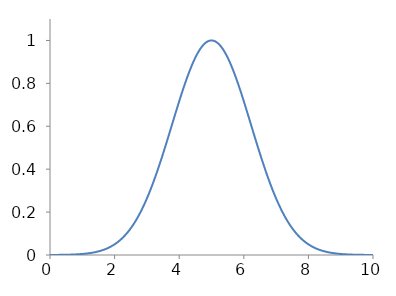
| Category | Series 0 |
|---|---|
| 0.0 | 0 |
| 0.001 | 0 |
| 0.002 | 0 |
| 0.003 | 0 |
| 0.004 | 0 |
| 0.005 | 0 |
| 0.006 | 0 |
| 0.007 | 0 |
| 0.008 | 0 |
| 0.009 | 0 |
| 0.01 | 0 |
| 0.011 | 0 |
| 0.012 | 0 |
| 0.013 | 0 |
| 0.014 | 0 |
| 0.015 | 0 |
| 0.016 | 0 |
| 0.017 | 0 |
| 0.018 | 0 |
| 0.019 | 0 |
| 0.02 | 0 |
| 0.021 | 0 |
| 0.022 | 0 |
| 0.023 | 0 |
| 0.024 | 0 |
| 0.025 | 0 |
| 0.026 | 0 |
| 0.027 | 0 |
| 0.028 | 0 |
| 0.029 | 0 |
| 0.03 | 0 |
| 0.031 | 0 |
| 0.032 | 0 |
| 0.033 | 0 |
| 0.034 | 0 |
| 0.035 | 0 |
| 0.036 | 0 |
| 0.037 | 0 |
| 0.038 | 0 |
| 0.039 | 0 |
| 0.04 | 0 |
| 0.041 | 0 |
| 0.042 | 0 |
| 0.043 | 0 |
| 0.044 | 0 |
| 0.045 | 0 |
| 0.046 | 0 |
| 0.047 | 0 |
| 0.048 | 0 |
| 0.049 | 0 |
| 0.05 | 0 |
| 0.051 | 0 |
| 0.052 | 0 |
| 0.053 | 0 |
| 0.054 | 0 |
| 0.055 | 0 |
| 0.056 | 0 |
| 0.057 | 0 |
| 0.058 | 0 |
| 0.059 | 0 |
| 0.06 | 0 |
| 0.061 | 0 |
| 0.062 | 0 |
| 0.063 | 0 |
| 0.064 | 0 |
| 0.065 | 0 |
| 0.066 | 0 |
| 0.067 | 0 |
| 0.068 | 0 |
| 0.069 | 0 |
| 0.07 | 0 |
| 0.071 | 0 |
| 0.072 | 0 |
| 0.073 | 0 |
| 0.074 | 0 |
| 0.075 | 0 |
| 0.076 | 0 |
| 0.077 | 0 |
| 0.078 | 0 |
| 0.079 | 0 |
| 0.08 | 0 |
| 0.081 | 0 |
| 0.082 | 0 |
| 0.083 | 0 |
| 0.084 | 0 |
| 0.085 | 0 |
| 0.086 | 0 |
| 0.087 | 0 |
| 0.088 | 0 |
| 0.089 | 0 |
| 0.09 | 0 |
| 0.091 | 0 |
| 0.092 | 0 |
| 0.093 | 0 |
| 0.094 | 0 |
| 0.095 | 0 |
| 0.096 | 0 |
| 0.097 | 0 |
| 0.098 | 0 |
| 0.099 | 0 |
| 0.1 | 0 |
| 0.101 | 0 |
| 0.102 | 0 |
| 0.103 | 0 |
| 0.104 | 0 |
| 0.105 | 0 |
| 0.106 | 0 |
| 0.107 | 0 |
| 0.108 | 0 |
| 0.109 | 0 |
| 0.11 | 0 |
| 0.111 | 0 |
| 0.112 | 0 |
| 0.113 | 0 |
| 0.114 | 0 |
| 0.115 | 0 |
| 0.116 | 0 |
| 0.117 | 0 |
| 0.118 | 0 |
| 0.119 | 0 |
| 0.12 | 0 |
| 0.121 | 0 |
| 0.122 | 0 |
| 0.123 | 0 |
| 0.124 | 0 |
| 0.125 | 0 |
| 0.126 | 0 |
| 0.127 | 0 |
| 0.128 | 0 |
| 0.129 | 0 |
| 0.13 | 0 |
| 0.131 | 0 |
| 0.132 | 0 |
| 0.133 | 0 |
| 0.134 | 0 |
| 0.135 | 0 |
| 0.136 | 0 |
| 0.137 | 0 |
| 0.138 | 0 |
| 0.139 | 0 |
| 0.14 | 0 |
| 0.141 | 0 |
| 0.142 | 0 |
| 0.143 | 0 |
| 0.144 | 0 |
| 0.145 | 0 |
| 0.146 | 0 |
| 0.147 | 0 |
| 0.148 | 0 |
| 0.149 | 0 |
| 0.15 | 0 |
| 0.151 | 0 |
| 0.152 | 0 |
| 0.153 | 0 |
| 0.154 | 0 |
| 0.155 | 0 |
| 0.156 | 0 |
| 0.157 | 0 |
| 0.158 | 0 |
| 0.159 | 0 |
| 0.16 | 0 |
| 0.161 | 0 |
| 0.162 | 0 |
| 0.163 | 0 |
| 0.164 | 0 |
| 0.165 | 0 |
| 0.166 | 0 |
| 0.167 | 0 |
| 0.168 | 0 |
| 0.169 | 0 |
| 0.17 | 0 |
| 0.171 | 0 |
| 0.172 | 0 |
| 0.173 | 0 |
| 0.174 | 0 |
| 0.175 | 0 |
| 0.176 | 0 |
| 0.177 | 0 |
| 0.178 | 0 |
| 0.179 | 0 |
| 0.18 | 0 |
| 0.181 | 0 |
| 0.182 | 0 |
| 0.183 | 0 |
| 0.184 | 0 |
| 0.185 | 0 |
| 0.186 | 0 |
| 0.187 | 0 |
| 0.188 | 0 |
| 0.189 | 0 |
| 0.19 | 0 |
| 0.191 | 0 |
| 0.192 | 0 |
| 0.193 | 0 |
| 0.194 | 0 |
| 0.195 | 0 |
| 0.196 | 0 |
| 0.197 | 0 |
| 0.198 | 0 |
| 0.199 | 0 |
| 0.2 | 0 |
| 0.201 | 0 |
| 0.202 | 0 |
| 0.203 | 0 |
| 0.204 | 0 |
| 0.205 | 0 |
| 0.206 | 0 |
| 0.207 | 0 |
| 0.208 | 0 |
| 0.209 | 0 |
| 0.21 | 0 |
| 0.211 | 0 |
| 0.212 | 0 |
| 0.213 | 0 |
| 0.214 | 0 |
| 0.215 | 0 |
| 0.216 | 0 |
| 0.217 | 0 |
| 0.218 | 0 |
| 0.219 | 0 |
| 0.22 | 0 |
| 0.221 | 0 |
| 0.222 | 0 |
| 0.223 | 0 |
| 0.224 | 0 |
| 0.225 | 0.001 |
| 0.226 | 0.001 |
| 0.227 | 0.001 |
| 0.228 | 0.001 |
| 0.229 | 0.001 |
| 0.23 | 0.001 |
| 0.231 | 0.001 |
| 0.232 | 0.001 |
| 0.233 | 0.001 |
| 0.234 | 0.001 |
| 0.235 | 0.001 |
| 0.236 | 0.001 |
| 0.237 | 0.001 |
| 0.238 | 0.001 |
| 0.239 | 0.001 |
| 0.24 | 0.001 |
| 0.241 | 0.001 |
| 0.242 | 0.001 |
| 0.243 | 0.001 |
| 0.244 | 0.001 |
| 0.245 | 0.001 |
| 0.246 | 0.001 |
| 0.247 | 0.001 |
| 0.248 | 0.001 |
| 0.249 | 0.001 |
| 0.25 | 0.001 |
| 0.251 | 0.001 |
| 0.252 | 0.001 |
| 0.253 | 0.001 |
| 0.254 | 0.001 |
| 0.255 | 0.001 |
| 0.256 | 0.001 |
| 0.257 | 0.001 |
| 0.258 | 0.001 |
| 0.259 | 0.001 |
| 0.26 | 0.001 |
| 0.261 | 0.001 |
| 0.262 | 0.001 |
| 0.263 | 0.001 |
| 0.264 | 0.001 |
| 0.265 | 0.001 |
| 0.266 | 0.001 |
| 0.267 | 0.001 |
| 0.268 | 0.001 |
| 0.269 | 0.001 |
| 0.27 | 0.001 |
| 0.271 | 0.001 |
| 0.272 | 0.001 |
| 0.273 | 0.001 |
| 0.274 | 0.001 |
| 0.275 | 0.001 |
| 0.276 | 0.001 |
| 0.277 | 0.001 |
| 0.278 | 0.001 |
| 0.279 | 0.001 |
| 0.28 | 0.001 |
| 0.281 | 0.001 |
| 0.282 | 0.001 |
| 0.283 | 0.001 |
| 0.284 | 0.001 |
| 0.285 | 0.001 |
| 0.286 | 0.001 |
| 0.287 | 0.001 |
| 0.288 | 0.001 |
| 0.289 | 0.001 |
| 0.29 | 0.001 |
| 0.291 | 0.001 |
| 0.292 | 0.001 |
| 0.293 | 0.001 |
| 0.294 | 0.001 |
| 0.295 | 0.001 |
| 0.296 | 0.001 |
| 0.297 | 0.001 |
| 0.298 | 0.001 |
| 0.299 | 0.001 |
| 0.3 | 0.001 |
| 0.301 | 0.001 |
| 0.302 | 0.001 |
| 0.303 | 0.001 |
| 0.304 | 0.001 |
| 0.305 | 0.001 |
| 0.306 | 0.001 |
| 0.307 | 0.001 |
| 0.308 | 0.001 |
| 0.309 | 0.001 |
| 0.31 | 0.001 |
| 0.311 | 0.001 |
| 0.312 | 0.001 |
| 0.313 | 0.001 |
| 0.314 | 0.001 |
| 0.315 | 0.001 |
| 0.316 | 0.001 |
| 0.317 | 0.001 |
| 0.318 | 0.001 |
| 0.319 | 0.001 |
| 0.32 | 0.001 |
| 0.321 | 0.001 |
| 0.322 | 0.001 |
| 0.323 | 0.001 |
| 0.324 | 0.001 |
| 0.325 | 0.001 |
| 0.326 | 0.001 |
| 0.327 | 0.001 |
| 0.328 | 0.001 |
| 0.329 | 0.001 |
| 0.33 | 0.001 |
| 0.331 | 0.001 |
| 0.332 | 0.001 |
| 0.333 | 0.001 |
| 0.334 | 0.001 |
| 0.335 | 0.001 |
| 0.336 | 0.001 |
| 0.337 | 0.001 |
| 0.338 | 0.001 |
| 0.339 | 0.001 |
| 0.34 | 0.001 |
| 0.341 | 0.001 |
| 0.342 | 0.001 |
| 0.343 | 0.001 |
| 0.344 | 0.001 |
| 0.345 | 0.001 |
| 0.346 | 0.001 |
| 0.347 | 0.001 |
| 0.348 | 0.001 |
| 0.349 | 0.001 |
| 0.35 | 0.001 |
| 0.351 | 0.001 |
| 0.352 | 0.001 |
| 0.353 | 0.001 |
| 0.354 | 0.001 |
| 0.355 | 0.001 |
| 0.356 | 0.001 |
| 0.357 | 0.001 |
| 0.358 | 0.001 |
| 0.359 | 0.001 |
| 0.36 | 0.001 |
| 0.361 | 0.001 |
| 0.362 | 0.001 |
| 0.363 | 0.001 |
| 0.364 | 0.001 |
| 0.365 | 0.001 |
| 0.366 | 0.001 |
| 0.367 | 0.001 |
| 0.368 | 0.001 |
| 0.369 | 0.001 |
| 0.37 | 0.001 |
| 0.371 | 0.001 |
| 0.372 | 0.001 |
| 0.373 | 0.001 |
| 0.374 | 0.001 |
| 0.375 | 0.001 |
| 0.376 | 0.001 |
| 0.377 | 0.001 |
| 0.378 | 0.001 |
| 0.379 | 0.001 |
| 0.38 | 0.001 |
| 0.381 | 0.001 |
| 0.382 | 0.001 |
| 0.383 | 0.001 |
| 0.384 | 0.001 |
| 0.385 | 0.001 |
| 0.386 | 0.001 |
| 0.387 | 0.001 |
| 0.388 | 0.001 |
| 0.389 | 0.001 |
| 0.39 | 0.001 |
| 0.391 | 0.001 |
| 0.392 | 0.001 |
| 0.393 | 0.001 |
| 0.394 | 0.001 |
| 0.395 | 0.001 |
| 0.396 | 0.001 |
| 0.397 | 0.001 |
| 0.398 | 0.001 |
| 0.399 | 0.001 |
| 0.4 | 0.001 |
| 0.401 | 0.001 |
| 0.402 | 0.001 |
| 0.403 | 0.001 |
| 0.404 | 0.001 |
| 0.405 | 0.001 |
| 0.406 | 0.001 |
| 0.407 | 0.001 |
| 0.408 | 0.001 |
| 0.409 | 0.001 |
| 0.41 | 0.001 |
| 0.411 | 0.001 |
| 0.412 | 0.001 |
| 0.413 | 0.001 |
| 0.414 | 0.001 |
| 0.415 | 0.001 |
| 0.416 | 0.001 |
| 0.417 | 0.001 |
| 0.418 | 0.001 |
| 0.419 | 0.001 |
| 0.42 | 0.001 |
| 0.421 | 0.001 |
| 0.422 | 0.001 |
| 0.423 | 0.001 |
| 0.424 | 0.001 |
| 0.425 | 0.001 |
| 0.426 | 0.001 |
| 0.427 | 0.001 |
| 0.428 | 0.001 |
| 0.429 | 0.001 |
| 0.43 | 0.001 |
| 0.431 | 0.001 |
| 0.432 | 0.001 |
| 0.433 | 0.001 |
| 0.434 | 0.001 |
| 0.435 | 0.001 |
| 0.436 | 0.001 |
| 0.437 | 0.001 |
| 0.438 | 0.001 |
| 0.439 | 0.001 |
| 0.44 | 0.001 |
| 0.441 | 0.001 |
| 0.442 | 0.001 |
| 0.443 | 0.001 |
| 0.444 | 0.001 |
| 0.445 | 0.001 |
| 0.446 | 0.001 |
| 0.447 | 0.001 |
| 0.448 | 0.001 |
| 0.449 | 0.001 |
| 0.45 | 0.001 |
| 0.451 | 0.001 |
| 0.452 | 0.001 |
| 0.453 | 0.001 |
| 0.454 | 0.001 |
| 0.455 | 0.001 |
| 0.456 | 0.001 |
| 0.457 | 0.001 |
| 0.458 | 0.001 |
| 0.459 | 0.001 |
| 0.46 | 0.001 |
| 0.461 | 0.001 |
| 0.462 | 0.001 |
| 0.463 | 0.001 |
| 0.464 | 0.001 |
| 0.465 | 0.001 |
| 0.466 | 0.001 |
| 0.467 | 0.001 |
| 0.468 | 0.001 |
| 0.469 | 0.001 |
| 0.47 | 0.001 |
| 0.471 | 0.001 |
| 0.472 | 0.001 |
| 0.473 | 0.001 |
| 0.474 | 0.001 |
| 0.475 | 0.001 |
| 0.476 | 0.001 |
| 0.477 | 0.001 |
| 0.478 | 0.001 |
| 0.479 | 0.001 |
| 0.48 | 0.001 |
| 0.481 | 0.001 |
| 0.482 | 0.001 |
| 0.483 | 0.001 |
| 0.484 | 0.001 |
| 0.485 | 0.001 |
| 0.486 | 0.001 |
| 0.487 | 0.001 |
| 0.488 | 0.001 |
| 0.489 | 0.001 |
| 0.49 | 0.001 |
| 0.491 | 0.001 |
| 0.492 | 0.001 |
| 0.493 | 0.001 |
| 0.494 | 0.001 |
| 0.495 | 0.001 |
| 0.496 | 0.001 |
| 0.497 | 0.001 |
| 0.498 | 0.001 |
| 0.499 | 0.001 |
| 0.5 | 0.001 |
| 0.501 | 0.001 |
| 0.502 | 0.001 |
| 0.503 | 0.001 |
| 0.504 | 0.001 |
| 0.505 | 0.001 |
| 0.506 | 0.001 |
| 0.507 | 0.001 |
| 0.508 | 0.001 |
| 0.509 | 0.001 |
| 0.51 | 0.001 |
| 0.511 | 0.001 |
| 0.512 | 0.001 |
| 0.513 | 0.001 |
| 0.514 | 0.001 |
| 0.515 | 0.001 |
| 0.516 | 0.001 |
| 0.517 | 0.001 |
| 0.518 | 0.001 |
| 0.519 | 0.001 |
| 0.52 | 0.001 |
| 0.521 | 0.001 |
| 0.522 | 0.001 |
| 0.523 | 0.001 |
| 0.524 | 0.001 |
| 0.525 | 0.001 |
| 0.526 | 0.001 |
| 0.527 | 0.001 |
| 0.528 | 0.001 |
| 0.529 | 0.001 |
| 0.53 | 0.001 |
| 0.531 | 0.001 |
| 0.532 | 0.001 |
| 0.533 | 0.001 |
| 0.534 | 0.001 |
| 0.535 | 0.001 |
| 0.536 | 0.001 |
| 0.537 | 0.001 |
| 0.538 | 0.001 |
| 0.539 | 0.001 |
| 0.54 | 0.001 |
| 0.541 | 0.001 |
| 0.542 | 0.001 |
| 0.543 | 0.001 |
| 0.544 | 0.001 |
| 0.545 | 0.001 |
| 0.546 | 0.001 |
| 0.547 | 0.001 |
| 0.548 | 0.001 |
| 0.549 | 0.001 |
| 0.55 | 0.001 |
| 0.551 | 0.001 |
| 0.552 | 0.001 |
| 0.553 | 0.001 |
| 0.554 | 0.001 |
| 0.555 | 0.001 |
| 0.556 | 0.001 |
| 0.557 | 0.001 |
| 0.558 | 0.001 |
| 0.559 | 0.001 |
| 0.56 | 0.001 |
| 0.561 | 0.001 |
| 0.562 | 0.001 |
| 0.563 | 0.001 |
| 0.564 | 0.001 |
| 0.565 | 0.001 |
| 0.566 | 0.001 |
| 0.567 | 0.001 |
| 0.568 | 0.001 |
| 0.569 | 0.001 |
| 0.57 | 0.001 |
| 0.571 | 0.001 |
| 0.572 | 0.001 |
| 0.573 | 0.001 |
| 0.574 | 0.001 |
| 0.575 | 0.001 |
| 0.576 | 0.001 |
| 0.577 | 0.001 |
| 0.578 | 0.001 |
| 0.579 | 0.001 |
| 0.58 | 0.001 |
| 0.581 | 0.001 |
| 0.582 | 0.001 |
| 0.583 | 0.001 |
| 0.584 | 0.002 |
| 0.585 | 0.002 |
| 0.586 | 0.002 |
| 0.587 | 0.002 |
| 0.588 | 0.002 |
| 0.589 | 0.002 |
| 0.59 | 0.002 |
| 0.591 | 0.002 |
| 0.592 | 0.002 |
| 0.593 | 0.002 |
| 0.594 | 0.002 |
| 0.595 | 0.002 |
| 0.596 | 0.002 |
| 0.597 | 0.002 |
| 0.598 | 0.002 |
| 0.599 | 0.002 |
| 0.6 | 0.002 |
| 0.601 | 0.002 |
| 0.602 | 0.002 |
| 0.603 | 0.002 |
| 0.604 | 0.002 |
| 0.605 | 0.002 |
| 0.606 | 0.002 |
| 0.607 | 0.002 |
| 0.608 | 0.002 |
| 0.609 | 0.002 |
| 0.61 | 0.002 |
| 0.611 | 0.002 |
| 0.612 | 0.002 |
| 0.613 | 0.002 |
| 0.614 | 0.002 |
| 0.615 | 0.002 |
| 0.616 | 0.002 |
| 0.617 | 0.002 |
| 0.618 | 0.002 |
| 0.619 | 0.002 |
| 0.62 | 0.002 |
| 0.621 | 0.002 |
| 0.622 | 0.002 |
| 0.623 | 0.002 |
| 0.624 | 0.002 |
| 0.625 | 0.002 |
| 0.626 | 0.002 |
| 0.627 | 0.002 |
| 0.628 | 0.002 |
| 0.629 | 0.002 |
| 0.63 | 0.002 |
| 0.631 | 0.002 |
| 0.632 | 0.002 |
| 0.633 | 0.002 |
| 0.634 | 0.002 |
| 0.635 | 0.002 |
| 0.636 | 0.002 |
| 0.637 | 0.002 |
| 0.638 | 0.002 |
| 0.639 | 0.002 |
| 0.64 | 0.002 |
| 0.641 | 0.002 |
| 0.642 | 0.002 |
| 0.643 | 0.002 |
| 0.644 | 0.002 |
| 0.645 | 0.002 |
| 0.646 | 0.002 |
| 0.647 | 0.002 |
| 0.648 | 0.002 |
| 0.649 | 0.002 |
| 0.65 | 0.002 |
| 0.651 | 0.002 |
| 0.652 | 0.002 |
| 0.653 | 0.002 |
| 0.654 | 0.002 |
| 0.655 | 0.002 |
| 0.656 | 0.002 |
| 0.657 | 0.002 |
| 0.658 | 0.002 |
| 0.659 | 0.002 |
| 0.66 | 0.002 |
| 0.661 | 0.002 |
| 0.662 | 0.002 |
| 0.663 | 0.002 |
| 0.664 | 0.002 |
| 0.665 | 0.002 |
| 0.666 | 0.002 |
| 0.667 | 0.002 |
| 0.668 | 0.002 |
| 0.669 | 0.002 |
| 0.67 | 0.002 |
| 0.671 | 0.002 |
| 0.672 | 0.002 |
| 0.673 | 0.002 |
| 0.674 | 0.002 |
| 0.675 | 0.002 |
| 0.676 | 0.002 |
| 0.677 | 0.002 |
| 0.678 | 0.002 |
| 0.679 | 0.002 |
| 0.68 | 0.002 |
| 0.681 | 0.002 |
| 0.682 | 0.002 |
| 0.683 | 0.002 |
| 0.684 | 0.002 |
| 0.685 | 0.002 |
| 0.686 | 0.002 |
| 0.687 | 0.002 |
| 0.688 | 0.002 |
| 0.689 | 0.002 |
| 0.69 | 0.002 |
| 0.691 | 0.002 |
| 0.692 | 0.002 |
| 0.693 | 0.002 |
| 0.694 | 0.002 |
| 0.695 | 0.002 |
| 0.696 | 0.002 |
| 0.697 | 0.002 |
| 0.698 | 0.002 |
| 0.699 | 0.002 |
| 0.7 | 0.002 |
| 0.701 | 0.002 |
| 0.702 | 0.002 |
| 0.703 | 0.002 |
| 0.704 | 0.002 |
| 0.705 | 0.002 |
| 0.706 | 0.002 |
| 0.707 | 0.002 |
| 0.708 | 0.002 |
| 0.709 | 0.002 |
| 0.71 | 0.002 |
| 0.711 | 0.002 |
| 0.712 | 0.002 |
| 0.713 | 0.002 |
| 0.714 | 0.002 |
| 0.715 | 0.002 |
| 0.716 | 0.002 |
| 0.717 | 0.002 |
| 0.718 | 0.002 |
| 0.719 | 0.002 |
| 0.72 | 0.002 |
| 0.721 | 0.002 |
| 0.722 | 0.002 |
| 0.723 | 0.002 |
| 0.724 | 0.002 |
| 0.725 | 0.002 |
| 0.726 | 0.002 |
| 0.727 | 0.002 |
| 0.728 | 0.002 |
| 0.729 | 0.002 |
| 0.73 | 0.002 |
| 0.731 | 0.002 |
| 0.732 | 0.002 |
| 0.733 | 0.002 |
| 0.734 | 0.002 |
| 0.735 | 0.002 |
| 0.736 | 0.002 |
| 0.737 | 0.002 |
| 0.738 | 0.002 |
| 0.739 | 0.002 |
| 0.74 | 0.002 |
| 0.741 | 0.002 |
| 0.742 | 0.002 |
| 0.743 | 0.002 |
| 0.744 | 0.002 |
| 0.745 | 0.002 |
| 0.746 | 0.002 |
| 0.747 | 0.002 |
| 0.748 | 0.002 |
| 0.749 | 0.002 |
| 0.75 | 0.002 |
| 0.751 | 0.002 |
| 0.752 | 0.002 |
| 0.753 | 0.002 |
| 0.754 | 0.002 |
| 0.755 | 0.002 |
| 0.756 | 0.002 |
| 0.757 | 0.002 |
| 0.758 | 0.002 |
| 0.759 | 0.002 |
| 0.76 | 0.002 |
| 0.761 | 0.003 |
| 0.762 | 0.003 |
| 0.763 | 0.003 |
| 0.764 | 0.003 |
| 0.765 | 0.003 |
| 0.766 | 0.003 |
| 0.767 | 0.003 |
| 0.768 | 0.003 |
| 0.769 | 0.003 |
| 0.77 | 0.003 |
| 0.771 | 0.003 |
| 0.772 | 0.003 |
| 0.773 | 0.003 |
| 0.774 | 0.003 |
| 0.775 | 0.003 |
| 0.776 | 0.003 |
| 0.777 | 0.003 |
| 0.778 | 0.003 |
| 0.779 | 0.003 |
| 0.78 | 0.003 |
| 0.781 | 0.003 |
| 0.782 | 0.003 |
| 0.783 | 0.003 |
| 0.784 | 0.003 |
| 0.785 | 0.003 |
| 0.786 | 0.003 |
| 0.787 | 0.003 |
| 0.788 | 0.003 |
| 0.789 | 0.003 |
| 0.79 | 0.003 |
| 0.791 | 0.003 |
| 0.792 | 0.003 |
| 0.793 | 0.003 |
| 0.794 | 0.003 |
| 0.795 | 0.003 |
| 0.796 | 0.003 |
| 0.797 | 0.003 |
| 0.798 | 0.003 |
| 0.799 | 0.003 |
| 0.8 | 0.003 |
| 0.801 | 0.003 |
| 0.802 | 0.003 |
| 0.803 | 0.003 |
| 0.804 | 0.003 |
| 0.805 | 0.003 |
| 0.806 | 0.003 |
| 0.807 | 0.003 |
| 0.808 | 0.003 |
| 0.809 | 0.003 |
| 0.81 | 0.003 |
| 0.811 | 0.003 |
| 0.812 | 0.003 |
| 0.813 | 0.003 |
| 0.814 | 0.003 |
| 0.815 | 0.003 |
| 0.816 | 0.003 |
| 0.817 | 0.003 |
| 0.818 | 0.003 |
| 0.819 | 0.003 |
| 0.82 | 0.003 |
| 0.821 | 0.003 |
| 0.822 | 0.003 |
| 0.823 | 0.003 |
| 0.824 | 0.003 |
| 0.825 | 0.003 |
| 0.826 | 0.003 |
| 0.827 | 0.003 |
| 0.828 | 0.003 |
| 0.829 | 0.003 |
| 0.83 | 0.003 |
| 0.831 | 0.003 |
| 0.832 | 0.003 |
| 0.833 | 0.003 |
| 0.834 | 0.003 |
| 0.835 | 0.003 |
| 0.836 | 0.003 |
| 0.837 | 0.003 |
| 0.838 | 0.003 |
| 0.839 | 0.003 |
| 0.84 | 0.003 |
| 0.841 | 0.003 |
| 0.842 | 0.003 |
| 0.843 | 0.003 |
| 0.844 | 0.003 |
| 0.845 | 0.003 |
| 0.846 | 0.003 |
| 0.847 | 0.003 |
| 0.848 | 0.003 |
| 0.849 | 0.003 |
| 0.85 | 0.003 |
| 0.851 | 0.003 |
| 0.852 | 0.003 |
| 0.853 | 0.003 |
| 0.854 | 0.003 |
| 0.855 | 0.003 |
| 0.856 | 0.003 |
| 0.857 | 0.003 |
| 0.858 | 0.003 |
| 0.859 | 0.003 |
| 0.86 | 0.003 |
| 0.861 | 0.003 |
| 0.862 | 0.003 |
| 0.863 | 0.003 |
| 0.864 | 0.003 |
| 0.865 | 0.003 |
| 0.866 | 0.003 |
| 0.867 | 0.003 |
| 0.868 | 0.003 |
| 0.869 | 0.003 |
| 0.87 | 0.003 |
| 0.871 | 0.003 |
| 0.872 | 0.003 |
| 0.873 | 0.003 |
| 0.874 | 0.003 |
| 0.875 | 0.003 |
| 0.876 | 0.003 |
| 0.877 | 0.003 |
| 0.878 | 0.003 |
| 0.879 | 0.003 |
| 0.88 | 0.003 |
| 0.881 | 0.003 |
| 0.882 | 0.004 |
| 0.883 | 0.004 |
| 0.884 | 0.004 |
| 0.885 | 0.004 |
| 0.886 | 0.004 |
| 0.887 | 0.004 |
| 0.888 | 0.004 |
| 0.889 | 0.004 |
| 0.89 | 0.004 |
| 0.891 | 0.004 |
| 0.892 | 0.004 |
| 0.893 | 0.004 |
| 0.894 | 0.004 |
| 0.895 | 0.004 |
| 0.896 | 0.004 |
| 0.897 | 0.004 |
| 0.898 | 0.004 |
| 0.899 | 0.004 |
| 0.9 | 0.004 |
| 0.901 | 0.004 |
| 0.902 | 0.004 |
| 0.903 | 0.004 |
| 0.904 | 0.004 |
| 0.905 | 0.004 |
| 0.906 | 0.004 |
| 0.907 | 0.004 |
| 0.908 | 0.004 |
| 0.909 | 0.004 |
| 0.91 | 0.004 |
| 0.911 | 0.004 |
| 0.912 | 0.004 |
| 0.913 | 0.004 |
| 0.914 | 0.004 |
| 0.915 | 0.004 |
| 0.916 | 0.004 |
| 0.917 | 0.004 |
| 0.918 | 0.004 |
| 0.919 | 0.004 |
| 0.92 | 0.004 |
| 0.921 | 0.004 |
| 0.922 | 0.004 |
| 0.923 | 0.004 |
| 0.924 | 0.004 |
| 0.925 | 0.004 |
| 0.926 | 0.004 |
| 0.927 | 0.004 |
| 0.928 | 0.004 |
| 0.929 | 0.004 |
| 0.93 | 0.004 |
| 0.931 | 0.004 |
| 0.932 | 0.004 |
| 0.933 | 0.004 |
| 0.934 | 0.004 |
| 0.935 | 0.004 |
| 0.936 | 0.004 |
| 0.937 | 0.004 |
| 0.938 | 0.004 |
| 0.939 | 0.004 |
| 0.94 | 0.004 |
| 0.941 | 0.004 |
| 0.942 | 0.004 |
| 0.943 | 0.004 |
| 0.944 | 0.004 |
| 0.945 | 0.004 |
| 0.946 | 0.004 |
| 0.947 | 0.004 |
| 0.948 | 0.004 |
| 0.949 | 0.004 |
| 0.95 | 0.004 |
| 0.951 | 0.004 |
| 0.952 | 0.004 |
| 0.953 | 0.004 |
| 0.954 | 0.004 |
| 0.955 | 0.004 |
| 0.956 | 0.004 |
| 0.957 | 0.004 |
| 0.958 | 0.004 |
| 0.959 | 0.004 |
| 0.96 | 0.004 |
| 0.961 | 0.004 |
| 0.962 | 0.004 |
| 0.963 | 0.004 |
| 0.964 | 0.004 |
| 0.965 | 0.004 |
| 0.966 | 0.004 |
| 0.967 | 0.004 |
| 0.968 | 0.004 |
| 0.969 | 0.004 |
| 0.97 | 0.004 |
| 0.971 | 0.004 |
| 0.972 | 0.004 |
| 0.973 | 0.004 |
| 0.974 | 0.005 |
| 0.975 | 0.005 |
| 0.976 | 0.005 |
| 0.977 | 0.005 |
| 0.978 | 0.005 |
| 0.979 | 0.005 |
| 0.98 | 0.005 |
| 0.981 | 0.005 |
| 0.982 | 0.005 |
| 0.983 | 0.005 |
| 0.984 | 0.005 |
| 0.985 | 0.005 |
| 0.986 | 0.005 |
| 0.987 | 0.005 |
| 0.988 | 0.005 |
| 0.989 | 0.005 |
| 0.99 | 0.005 |
| 0.991 | 0.005 |
| 0.992 | 0.005 |
| 0.993 | 0.005 |
| 0.994 | 0.005 |
| 0.995 | 0.005 |
| 0.996 | 0.005 |
| 0.997 | 0.005 |
| 0.998 | 0.005 |
| 0.999 | 0.005 |
| 1.0 | 0.005 |
| 1.001 | 0.005 |
| 1.002 | 0.005 |
| 1.003 | 0.005 |
| 1.004 | 0.005 |
| 1.005 | 0.005 |
| 1.006 | 0.005 |
| 1.007 | 0.005 |
| 1.008 | 0.005 |
| 1.009 | 0.005 |
| 1.01 | 0.005 |
| 1.011 | 0.005 |
| 1.012 | 0.005 |
| 1.013 | 0.005 |
| 1.014 | 0.005 |
| 1.015 | 0.005 |
| 1.016 | 0.005 |
| 1.017 | 0.005 |
| 1.018 | 0.005 |
| 1.019 | 0.005 |
| 1.02 | 0.005 |
| 1.021 | 0.005 |
| 1.022 | 0.005 |
| 1.023 | 0.005 |
| 1.024 | 0.005 |
| 1.025 | 0.005 |
| 1.026 | 0.005 |
| 1.027 | 0.005 |
| 1.028 | 0.005 |
| 1.029 | 0.005 |
| 1.03 | 0.005 |
| 1.031 | 0.005 |
| 1.032 | 0.005 |
| 1.033 | 0.005 |
| 1.034 | 0.005 |
| 1.035 | 0.005 |
| 1.036 | 0.005 |
| 1.037 | 0.005 |
| 1.038 | 0.005 |
| 1.039 | 0.005 |
| 1.04 | 0.005 |
| 1.041 | 0.005 |
| 1.042 | 0.005 |
| 1.043 | 0.005 |
| 1.044 | 0.005 |
| 1.045 | 0.005 |
| 1.046 | 0.005 |
| 1.047 | 0.005 |
| 1.048 | 0.005 |
| 1.049 | 0.005 |
| 1.05 | 0.006 |
| 1.051 | 0.006 |
| 1.052 | 0.006 |
| 1.053 | 0.006 |
| 1.054 | 0.006 |
| 1.055 | 0.006 |
| 1.056 | 0.006 |
| 1.057 | 0.006 |
| 1.058 | 0.006 |
| 1.059 | 0.006 |
| 1.06 | 0.006 |
| 1.061 | 0.006 |
| 1.062 | 0.006 |
| 1.063 | 0.006 |
| 1.064 | 0.006 |
| 1.065 | 0.006 |
| 1.066 | 0.006 |
| 1.067 | 0.006 |
| 1.068 | 0.006 |
| 1.069 | 0.006 |
| 1.07 | 0.006 |
| 1.071 | 0.006 |
| 1.072 | 0.006 |
| 1.073 | 0.006 |
| 1.074 | 0.006 |
| 1.075 | 0.006 |
| 1.076 | 0.006 |
| 1.077 | 0.006 |
| 1.078 | 0.006 |
| 1.079 | 0.006 |
| 1.08 | 0.006 |
| 1.081 | 0.006 |
| 1.082 | 0.006 |
| 1.083 | 0.006 |
| 1.084 | 0.006 |
| 1.085 | 0.006 |
| 1.086 | 0.006 |
| 1.087 | 0.006 |
| 1.088 | 0.006 |
| 1.089 | 0.006 |
| 1.09 | 0.006 |
| 1.091 | 0.006 |
| 1.092 | 0.006 |
| 1.093 | 0.006 |
| 1.094 | 0.006 |
| 1.095 | 0.006 |
| 1.096 | 0.006 |
| 1.097 | 0.006 |
| 1.098 | 0.006 |
| 1.099 | 0.006 |
| 1.1 | 0.006 |
| 1.101 | 0.006 |
| 1.102 | 0.006 |
| 1.103 | 0.006 |
| 1.104 | 0.006 |
| 1.105 | 0.006 |
| 1.106 | 0.006 |
| 1.107 | 0.006 |
| 1.108 | 0.006 |
| 1.109 | 0.006 |
| 1.11 | 0.006 |
| 1.111 | 0.006 |
| 1.112 | 0.006 |
| 1.113 | 0.006 |
| 1.114 | 0.007 |
| 1.115 | 0.007 |
| 1.116 | 0.007 |
| 1.117 | 0.007 |
| 1.118 | 0.007 |
| 1.119 | 0.007 |
| 1.12 | 0.007 |
| 1.121 | 0.007 |
| 1.122 | 0.007 |
| 1.123 | 0.007 |
| 1.124 | 0.007 |
| 1.125 | 0.007 |
| 1.126 | 0.007 |
| 1.127 | 0.007 |
| 1.128 | 0.007 |
| 1.129 | 0.007 |
| 1.13 | 0.007 |
| 1.131 | 0.007 |
| 1.132 | 0.007 |
| 1.133 | 0.007 |
| 1.134 | 0.007 |
| 1.135 | 0.007 |
| 1.136 | 0.007 |
| 1.137 | 0.007 |
| 1.138 | 0.007 |
| 1.139 | 0.007 |
| 1.14 | 0.007 |
| 1.141 | 0.007 |
| 1.142 | 0.007 |
| 1.143 | 0.007 |
| 1.144 | 0.007 |
| 1.145 | 0.007 |
| 1.146 | 0.007 |
| 1.147 | 0.007 |
| 1.148 | 0.007 |
| 1.149 | 0.007 |
| 1.15 | 0.007 |
| 1.151 | 0.007 |
| 1.152 | 0.007 |
| 1.153 | 0.007 |
| 1.154 | 0.007 |
| 1.155 | 0.007 |
| 1.156 | 0.007 |
| 1.157 | 0.007 |
| 1.158 | 0.007 |
| 1.159 | 0.007 |
| 1.16 | 0.007 |
| 1.161 | 0.007 |
| 1.162 | 0.007 |
| 1.163 | 0.007 |
| 1.164 | 0.007 |
| 1.165 | 0.007 |
| 1.166 | 0.007 |
| 1.167 | 0.007 |
| 1.168 | 0.007 |
| 1.169 | 0.008 |
| 1.17 | 0.008 |
| 1.171 | 0.008 |
| 1.172 | 0.008 |
| 1.173 | 0.008 |
| 1.174 | 0.008 |
| 1.175 | 0.008 |
| 1.176 | 0.008 |
| 1.177 | 0.008 |
| 1.178 | 0.008 |
| 1.179 | 0.008 |
| 1.18 | 0.008 |
| 1.181 | 0.008 |
| 1.182 | 0.008 |
| 1.183 | 0.008 |
| 1.184 | 0.008 |
| 1.185 | 0.008 |
| 1.186 | 0.008 |
| 1.187 | 0.008 |
| 1.188 | 0.008 |
| 1.189 | 0.008 |
| 1.19 | 0.008 |
| 1.191 | 0.008 |
| 1.192 | 0.008 |
| 1.193 | 0.008 |
| 1.194 | 0.008 |
| 1.195 | 0.008 |
| 1.196 | 0.008 |
| 1.197 | 0.008 |
| 1.198 | 0.008 |
| 1.199 | 0.008 |
| 1.2 | 0.008 |
| 1.201 | 0.008 |
| 1.202 | 0.008 |
| 1.203 | 0.008 |
| 1.204 | 0.008 |
| 1.205 | 0.008 |
| 1.206 | 0.008 |
| 1.207 | 0.008 |
| 1.208 | 0.008 |
| 1.209 | 0.008 |
| 1.21 | 0.008 |
| 1.211 | 0.008 |
| 1.212 | 0.008 |
| 1.213 | 0.008 |
| 1.214 | 0.008 |
| 1.215 | 0.008 |
| 1.216 | 0.008 |
| 1.217 | 0.008 |
| 1.218 | 0.008 |
| 1.219 | 0.009 |
| 1.22 | 0.009 |
| 1.221 | 0.009 |
| 1.222 | 0.009 |
| 1.223 | 0.009 |
| 1.224 | 0.009 |
| 1.225 | 0.009 |
| 1.226 | 0.009 |
| 1.227 | 0.009 |
| 1.228 | 0.009 |
| 1.229 | 0.009 |
| 1.23 | 0.009 |
| 1.231 | 0.009 |
| 1.232 | 0.009 |
| 1.233 | 0.009 |
| 1.234 | 0.009 |
| 1.235 | 0.009 |
| 1.236 | 0.009 |
| 1.237 | 0.009 |
| 1.238 | 0.009 |
| 1.239 | 0.009 |
| 1.24 | 0.009 |
| 1.241 | 0.009 |
| 1.242 | 0.009 |
| 1.243 | 0.009 |
| 1.244 | 0.009 |
| 1.245 | 0.009 |
| 1.246 | 0.009 |
| 1.247 | 0.009 |
| 1.248 | 0.009 |
| 1.249 | 0.009 |
| 1.25 | 0.009 |
| 1.251 | 0.009 |
| 1.252 | 0.009 |
| 1.253 | 0.009 |
| 1.254 | 0.009 |
| 1.255 | 0.009 |
| 1.256 | 0.009 |
| 1.257 | 0.009 |
| 1.258 | 0.009 |
| 1.259 | 0.009 |
| 1.26 | 0.009 |
| 1.261 | 0.009 |
| 1.262 | 0.009 |
| 1.263 | 0.01 |
| 1.264 | 0.01 |
| 1.265 | 0.01 |
| 1.266 | 0.01 |
| 1.267 | 0.01 |
| 1.268 | 0.01 |
| 1.269 | 0.01 |
| 1.27 | 0.01 |
| 1.271 | 0.01 |
| 1.272 | 0.01 |
| 1.273 | 0.01 |
| 1.274 | 0.01 |
| 1.275 | 0.01 |
| 1.276 | 0.01 |
| 1.277 | 0.01 |
| 1.278 | 0.01 |
| 1.279 | 0.01 |
| 1.28 | 0.01 |
| 1.281 | 0.01 |
| 1.282 | 0.01 |
| 1.283 | 0.01 |
| 1.284 | 0.01 |
| 1.285 | 0.01 |
| 1.286 | 0.01 |
| 1.287 | 0.01 |
| 1.288 | 0.01 |
| 1.289 | 0.01 |
| 1.29 | 0.01 |
| 1.291 | 0.01 |
| 1.292 | 0.01 |
| 1.293 | 0.01 |
| 1.294 | 0.01 |
| 1.295 | 0.01 |
| 1.296 | 0.01 |
| 1.297 | 0.01 |
| 1.298 | 0.01 |
| 1.299 | 0.01 |
| 1.3 | 0.01 |
| 1.301 | 0.01 |
| 1.302 | 0.01 |
| 1.303 | 0.011 |
| 1.304 | 0.011 |
| 1.305 | 0.011 |
| 1.306 | 0.011 |
| 1.307 | 0.011 |
| 1.308 | 0.011 |
| 1.309 | 0.011 |
| 1.31 | 0.011 |
| 1.311 | 0.011 |
| 1.312 | 0.011 |
| 1.313 | 0.011 |
| 1.314 | 0.011 |
| 1.315 | 0.011 |
| 1.316 | 0.011 |
| 1.317 | 0.011 |
| 1.318 | 0.011 |
| 1.319 | 0.011 |
| 1.32 | 0.011 |
| 1.321 | 0.011 |
| 1.322 | 0.011 |
| 1.323 | 0.011 |
| 1.324 | 0.011 |
| 1.325 | 0.011 |
| 1.326 | 0.011 |
| 1.327 | 0.011 |
| 1.328 | 0.011 |
| 1.329 | 0.011 |
| 1.33 | 0.011 |
| 1.331 | 0.011 |
| 1.332 | 0.011 |
| 1.333 | 0.011 |
| 1.334 | 0.011 |
| 1.335 | 0.011 |
| 1.336 | 0.011 |
| 1.337 | 0.011 |
| 1.338 | 0.011 |
| 1.339 | 0.011 |
| 1.34 | 0.012 |
| 1.341 | 0.012 |
| 1.342 | 0.012 |
| 1.343 | 0.012 |
| 1.344 | 0.012 |
| 1.345 | 0.012 |
| 1.346 | 0.012 |
| 1.347 | 0.012 |
| 1.348 | 0.012 |
| 1.349 | 0.012 |
| 1.35 | 0.012 |
| 1.351 | 0.012 |
| 1.352 | 0.012 |
| 1.353 | 0.012 |
| 1.354 | 0.012 |
| 1.355 | 0.012 |
| 1.356 | 0.012 |
| 1.357 | 0.012 |
| 1.358 | 0.012 |
| 1.359 | 0.012 |
| 1.36 | 0.012 |
| 1.361 | 0.012 |
| 1.362 | 0.012 |
| 1.363 | 0.012 |
| 1.364 | 0.012 |
| 1.365 | 0.012 |
| 1.366 | 0.012 |
| 1.367 | 0.012 |
| 1.368 | 0.012 |
| 1.369 | 0.012 |
| 1.37 | 0.012 |
| 1.371 | 0.012 |
| 1.372 | 0.012 |
| 1.373 | 0.012 |
| 1.374 | 0.012 |
| 1.375 | 0.013 |
| 1.376 | 0.013 |
| 1.377 | 0.013 |
| 1.378 | 0.013 |
| 1.379 | 0.013 |
| 1.38 | 0.013 |
| 1.381 | 0.013 |
| 1.382 | 0.013 |
| 1.383 | 0.013 |
| 1.384 | 0.013 |
| 1.385 | 0.013 |
| 1.386 | 0.013 |
| 1.387 | 0.013 |
| 1.388 | 0.013 |
| 1.389 | 0.013 |
| 1.39 | 0.013 |
| 1.391 | 0.013 |
| 1.392 | 0.013 |
| 1.393 | 0.013 |
| 1.394 | 0.013 |
| 1.395 | 0.013 |
| 1.396 | 0.013 |
| 1.397 | 0.013 |
| 1.398 | 0.013 |
| 1.399 | 0.013 |
| 1.4 | 0.013 |
| 1.401 | 0.013 |
| 1.402 | 0.013 |
| 1.403 | 0.013 |
| 1.404 | 0.013 |
| 1.405 | 0.013 |
| 1.406 | 0.013 |
| 1.407 | 0.014 |
| 1.408 | 0.014 |
| 1.409 | 0.014 |
| 1.41 | 0.014 |
| 1.411 | 0.014 |
| 1.412 | 0.014 |
| 1.413 | 0.014 |
| 1.414 | 0.014 |
| 1.415 | 0.014 |
| 1.416 | 0.014 |
| 1.417 | 0.014 |
| 1.418 | 0.014 |
| 1.419 | 0.014 |
| 1.42 | 0.014 |
| 1.421 | 0.014 |
| 1.422 | 0.014 |
| 1.423 | 0.014 |
| 1.424 | 0.014 |
| 1.425 | 0.014 |
| 1.426 | 0.014 |
| 1.427 | 0.014 |
| 1.428 | 0.014 |
| 1.429 | 0.014 |
| 1.43 | 0.014 |
| 1.431 | 0.014 |
| 1.432 | 0.014 |
| 1.433 | 0.014 |
| 1.434 | 0.014 |
| 1.435 | 0.014 |
| 1.436 | 0.014 |
| 1.437 | 0.015 |
| 1.438 | 0.015 |
| 1.439 | 0.015 |
| 1.44 | 0.015 |
| 1.441 | 0.015 |
| 1.442 | 0.015 |
| 1.443 | 0.015 |
| 1.444 | 0.015 |
| 1.445 | 0.015 |
| 1.446 | 0.015 |
| 1.447 | 0.015 |
| 1.448 | 0.015 |
| 1.449 | 0.015 |
| 1.45 | 0.015 |
| 1.451 | 0.015 |
| 1.452 | 0.015 |
| 1.453 | 0.015 |
| 1.454 | 0.015 |
| 1.455 | 0.015 |
| 1.456 | 0.015 |
| 1.457 | 0.015 |
| 1.458 | 0.015 |
| 1.459 | 0.015 |
| 1.46 | 0.015 |
| 1.461 | 0.015 |
| 1.462 | 0.015 |
| 1.463 | 0.015 |
| 1.464 | 0.015 |
| 1.465 | 0.016 |
| 1.466 | 0.016 |
| 1.467 | 0.016 |
| 1.468 | 0.016 |
| 1.469 | 0.016 |
| 1.47 | 0.016 |
| 1.471 | 0.016 |
| 1.472 | 0.016 |
| 1.473 | 0.016 |
| 1.474 | 0.016 |
| 1.475 | 0.016 |
| 1.476 | 0.016 |
| 1.477 | 0.016 |
| 1.478 | 0.016 |
| 1.479 | 0.016 |
| 1.48 | 0.016 |
| 1.481 | 0.016 |
| 1.482 | 0.016 |
| 1.483 | 0.016 |
| 1.484 | 0.016 |
| 1.485 | 0.016 |
| 1.486 | 0.016 |
| 1.487 | 0.016 |
| 1.488 | 0.016 |
| 1.489 | 0.016 |
| 1.49 | 0.016 |
| 1.491 | 0.017 |
| 1.492 | 0.017 |
| 1.493 | 0.017 |
| 1.494 | 0.017 |
| 1.495 | 0.017 |
| 1.496 | 0.017 |
| 1.497 | 0.017 |
| 1.498 | 0.017 |
| 1.499 | 0.017 |
| 1.5 | 0.017 |
| 1.501 | 0.017 |
| 1.502 | 0.017 |
| 1.503 | 0.017 |
| 1.504 | 0.017 |
| 1.505 | 0.017 |
| 1.506 | 0.017 |
| 1.507 | 0.017 |
| 1.508 | 0.017 |
| 1.509 | 0.017 |
| 1.51 | 0.017 |
| 1.511 | 0.017 |
| 1.512 | 0.017 |
| 1.513 | 0.017 |
| 1.514 | 0.017 |
| 1.515 | 0.017 |
| 1.516 | 0.017 |
| 1.517 | 0.018 |
| 1.518 | 0.018 |
| 1.519 | 0.018 |
| 1.52 | 0.018 |
| 1.521 | 0.018 |
| 1.522 | 0.018 |
| 1.523 | 0.018 |
| 1.524 | 0.018 |
| 1.525 | 0.018 |
| 1.526 | 0.018 |
| 1.527 | 0.018 |
| 1.528 | 0.018 |
| 1.529 | 0.018 |
| 1.53 | 0.018 |
| 1.531 | 0.018 |
| 1.532 | 0.018 |
| 1.533 | 0.018 |
| 1.534 | 0.018 |
| 1.535 | 0.018 |
| 1.536 | 0.018 |
| 1.537 | 0.018 |
| 1.538 | 0.018 |
| 1.539 | 0.018 |
| 1.54 | 0.018 |
| 1.541 | 0.019 |
| 1.542 | 0.019 |
| 1.543 | 0.019 |
| 1.544 | 0.019 |
| 1.545 | 0.019 |
| 1.546 | 0.019 |
| 1.547 | 0.019 |
| 1.548 | 0.019 |
| 1.549 | 0.019 |
| 1.55 | 0.019 |
| 1.551 | 0.019 |
| 1.552 | 0.019 |
| 1.553 | 0.019 |
| 1.554 | 0.019 |
| 1.555 | 0.019 |
| 1.556 | 0.019 |
| 1.557 | 0.019 |
| 1.558 | 0.019 |
| 1.559 | 0.019 |
| 1.56 | 0.019 |
| 1.561 | 0.019 |
| 1.562 | 0.019 |
| 1.563 | 0.019 |
| 1.564 | 0.02 |
| 1.565 | 0.02 |
| 1.566 | 0.02 |
| 1.567 | 0.02 |
| 1.568 | 0.02 |
| 1.569 | 0.02 |
| 1.57 | 0.02 |
| 1.571 | 0.02 |
| 1.572 | 0.02 |
| 1.573 | 0.02 |
| 1.574 | 0.02 |
| 1.575 | 0.02 |
| 1.576 | 0.02 |
| 1.577 | 0.02 |
| 1.578 | 0.02 |
| 1.579 | 0.02 |
| 1.58 | 0.02 |
| 1.581 | 0.02 |
| 1.582 | 0.02 |
| 1.583 | 0.02 |
| 1.584 | 0.02 |
| 1.585 | 0.02 |
| 1.586 | 0.021 |
| 1.587 | 0.021 |
| 1.588 | 0.021 |
| 1.589 | 0.021 |
| 1.59 | 0.021 |
| 1.591 | 0.021 |
| 1.592 | 0.021 |
| 1.593 | 0.021 |
| 1.594 | 0.021 |
| 1.595 | 0.021 |
| 1.596 | 0.021 |
| 1.597 | 0.021 |
| 1.598 | 0.021 |
| 1.599 | 0.021 |
| 1.6 | 0.021 |
| 1.601 | 0.021 |
| 1.602 | 0.021 |
| 1.603 | 0.021 |
| 1.604 | 0.021 |
| 1.605 | 0.021 |
| 1.606 | 0.021 |
| 1.607 | 0.022 |
| 1.608 | 0.022 |
| 1.609 | 0.022 |
| 1.61 | 0.022 |
| 1.611 | 0.022 |
| 1.612 | 0.022 |
| 1.613 | 0.022 |
| 1.614 | 0.022 |
| 1.615 | 0.022 |
| 1.616 | 0.022 |
| 1.617 | 0.022 |
| 1.618 | 0.022 |
| 1.619 | 0.022 |
| 1.62 | 0.022 |
| 1.621 | 0.022 |
| 1.622 | 0.022 |
| 1.623 | 0.022 |
| 1.624 | 0.022 |
| 1.625 | 0.022 |
| 1.626 | 0.022 |
| 1.627 | 0.023 |
| 1.628 | 0.023 |
| 1.629 | 0.023 |
| 1.63 | 0.023 |
| 1.631 | 0.023 |
| 1.632 | 0.023 |
| 1.633 | 0.023 |
| 1.634 | 0.023 |
| 1.635 | 0.023 |
| 1.636 | 0.023 |
| 1.637 | 0.023 |
| 1.638 | 0.023 |
| 1.639 | 0.023 |
| 1.64 | 0.023 |
| 1.641 | 0.023 |
| 1.642 | 0.023 |
| 1.643 | 0.023 |
| 1.644 | 0.023 |
| 1.645 | 0.023 |
| 1.646 | 0.024 |
| 1.647 | 0.024 |
| 1.648 | 0.024 |
| 1.649 | 0.024 |
| 1.65 | 0.024 |
| 1.651 | 0.024 |
| 1.652 | 0.024 |
| 1.653 | 0.024 |
| 1.654 | 0.024 |
| 1.655 | 0.024 |
| 1.656 | 0.024 |
| 1.657 | 0.024 |
| 1.658 | 0.024 |
| 1.659 | 0.024 |
| 1.66 | 0.024 |
| 1.661 | 0.024 |
| 1.662 | 0.024 |
| 1.663 | 0.024 |
| 1.664 | 0.024 |
| 1.665 | 0.025 |
| 1.666 | 0.025 |
| 1.667 | 0.025 |
| 1.668 | 0.025 |
| 1.669 | 0.025 |
| 1.67 | 0.025 |
| 1.671 | 0.025 |
| 1.672 | 0.025 |
| 1.673 | 0.025 |
| 1.674 | 0.025 |
| 1.675 | 0.025 |
| 1.676 | 0.025 |
| 1.677 | 0.025 |
| 1.678 | 0.025 |
| 1.679 | 0.025 |
| 1.68 | 0.025 |
| 1.681 | 0.025 |
| 1.682 | 0.025 |
| 1.683 | 0.026 |
| 1.684 | 0.026 |
| 1.685 | 0.026 |
| 1.686 | 0.026 |
| 1.687 | 0.026 |
| 1.688 | 0.026 |
| 1.689 | 0.026 |
| 1.69 | 0.026 |
| 1.691 | 0.026 |
| 1.692 | 0.026 |
| 1.693 | 0.026 |
| 1.694 | 0.026 |
| 1.695 | 0.026 |
| 1.696 | 0.026 |
| 1.697 | 0.026 |
| 1.698 | 0.026 |
| 1.699 | 0.026 |
| 1.7 | 0.027 |
| 1.701 | 0.027 |
| 1.702 | 0.027 |
| 1.703 | 0.027 |
| 1.704 | 0.027 |
| 1.705 | 0.027 |
| 1.706 | 0.027 |
| 1.707 | 0.027 |
| 1.708 | 0.027 |
| 1.709 | 0.027 |
| 1.71 | 0.027 |
| 1.711 | 0.027 |
| 1.712 | 0.027 |
| 1.713 | 0.027 |
| 1.714 | 0.027 |
| 1.715 | 0.027 |
| 1.716 | 0.027 |
| 1.717 | 0.028 |
| 1.718 | 0.028 |
| 1.719 | 0.028 |
| 1.72 | 0.028 |
| 1.721 | 0.028 |
| 1.722 | 0.028 |
| 1.723 | 0.028 |
| 1.724 | 0.028 |
| 1.725 | 0.028 |
| 1.726 | 0.028 |
| 1.727 | 0.028 |
| 1.728 | 0.028 |
| 1.729 | 0.028 |
| 1.73 | 0.028 |
| 1.731 | 0.028 |
| 1.732 | 0.028 |
| 1.733 | 0.029 |
| 1.734 | 0.029 |
| 1.735 | 0.029 |
| 1.736 | 0.029 |
| 1.737 | 0.029 |
| 1.738 | 0.029 |
| 1.739 | 0.029 |
| 1.74 | 0.029 |
| 1.741 | 0.029 |
| 1.742 | 0.029 |
| 1.743 | 0.029 |
| 1.744 | 0.029 |
| 1.745 | 0.029 |
| 1.746 | 0.029 |
| 1.747 | 0.029 |
| 1.748 | 0.029 |
| 1.749 | 0.03 |
| 1.75 | 0.03 |
| 1.751 | 0.03 |
| 1.752 | 0.03 |
| 1.753 | 0.03 |
| 1.754 | 0.03 |
| 1.755 | 0.03 |
| 1.756 | 0.03 |
| 1.757 | 0.03 |
| 1.758 | 0.03 |
| 1.759 | 0.03 |
| 1.76 | 0.03 |
| 1.761 | 0.03 |
| 1.762 | 0.03 |
| 1.763 | 0.03 |
| 1.764 | 0.03 |
| 1.765 | 0.031 |
| 1.766 | 0.031 |
| 1.767 | 0.031 |
| 1.768 | 0.031 |
| 1.769 | 0.031 |
| 1.77 | 0.031 |
| 1.771 | 0.031 |
| 1.772 | 0.031 |
| 1.773 | 0.031 |
| 1.774 | 0.031 |
| 1.775 | 0.031 |
| 1.776 | 0.031 |
| 1.777 | 0.031 |
| 1.778 | 0.031 |
| 1.779 | 0.031 |
| 1.78 | 0.032 |
| 1.781 | 0.032 |
| 1.782 | 0.032 |
| 1.783 | 0.032 |
| 1.784 | 0.032 |
| 1.785 | 0.032 |
| 1.786 | 0.032 |
| 1.787 | 0.032 |
| 1.788 | 0.032 |
| 1.789 | 0.032 |
| 1.79 | 0.032 |
| 1.791 | 0.032 |
| 1.792 | 0.032 |
| 1.793 | 0.032 |
| 1.794 | 0.033 |
| 1.795 | 0.033 |
| 1.796 | 0.033 |
| 1.797 | 0.033 |
| 1.798 | 0.033 |
| 1.799 | 0.033 |
| 1.8 | 0.033 |
| 1.801 | 0.033 |
| 1.802 | 0.033 |
| 1.803 | 0.033 |
| 1.804 | 0.033 |
| 1.805 | 0.033 |
| 1.806 | 0.033 |
| 1.807 | 0.033 |
| 1.808 | 0.033 |
| 1.809 | 0.034 |
| 1.81 | 0.034 |
| 1.811 | 0.034 |
| 1.812 | 0.034 |
| 1.813 | 0.034 |
| 1.814 | 0.034 |
| 1.815 | 0.034 |
| 1.816 | 0.034 |
| 1.817 | 0.034 |
| 1.818 | 0.034 |
| 1.819 | 0.034 |
| 1.82 | 0.034 |
| 1.821 | 0.034 |
| 1.822 | 0.035 |
| 1.823 | 0.035 |
| 1.824 | 0.035 |
| 1.825 | 0.035 |
| 1.826 | 0.035 |
| 1.827 | 0.035 |
| 1.828 | 0.035 |
| 1.829 | 0.035 |
| 1.83 | 0.035 |
| 1.831 | 0.035 |
| 1.832 | 0.035 |
| 1.833 | 0.035 |
| 1.834 | 0.035 |
| 1.835 | 0.035 |
| 1.836 | 0.036 |
| 1.837 | 0.036 |
| 1.838 | 0.036 |
| 1.839 | 0.036 |
| 1.84 | 0.036 |
| 1.841 | 0.036 |
| 1.842 | 0.036 |
| 1.843 | 0.036 |
| 1.844 | 0.036 |
| 1.845 | 0.036 |
| 1.846 | 0.036 |
| 1.847 | 0.036 |
| 1.848 | 0.036 |
| 1.849 | 0.037 |
| 1.85 | 0.037 |
| 1.851 | 0.037 |
| 1.852 | 0.037 |
| 1.853 | 0.037 |
| 1.854 | 0.037 |
| 1.855 | 0.037 |
| 1.856 | 0.037 |
| 1.857 | 0.037 |
| 1.858 | 0.037 |
| 1.859 | 0.037 |
| 1.86 | 0.037 |
| 1.861 | 0.037 |
| 1.862 | 0.038 |
| 1.863 | 0.038 |
| 1.864 | 0.038 |
| 1.865 | 0.038 |
| 1.866 | 0.038 |
| 1.867 | 0.038 |
| 1.868 | 0.038 |
| 1.869 | 0.038 |
| 1.87 | 0.038 |
| 1.871 | 0.038 |
| 1.872 | 0.038 |
| 1.873 | 0.038 |
| 1.874 | 0.038 |
| 1.875 | 0.039 |
| 1.876 | 0.039 |
| 1.877 | 0.039 |
| 1.878 | 0.039 |
| 1.879 | 0.039 |
| 1.88 | 0.039 |
| 1.881 | 0.039 |
| 1.882 | 0.039 |
| 1.883 | 0.039 |
| 1.884 | 0.039 |
| 1.885 | 0.039 |
| 1.886 | 0.039 |
| 1.887 | 0.04 |
| 1.888 | 0.04 |
| 1.889 | 0.04 |
| 1.89 | 0.04 |
| 1.891 | 0.04 |
| 1.892 | 0.04 |
| 1.893 | 0.04 |
| 1.894 | 0.04 |
| 1.895 | 0.04 |
| 1.896 | 0.04 |
| 1.897 | 0.04 |
| 1.898 | 0.04 |
| 1.899 | 0.041 |
| 1.9 | 0.041 |
| 1.901 | 0.041 |
| 1.902 | 0.041 |
| 1.903 | 0.041 |
| 1.904 | 0.041 |
| 1.905 | 0.041 |
| 1.906 | 0.041 |
| 1.907 | 0.041 |
| 1.908 | 0.041 |
| 1.909 | 0.041 |
| 1.91 | 0.041 |
| 1.911 | 0.042 |
| 1.912 | 0.042 |
| 1.913 | 0.042 |
| 1.914 | 0.042 |
| 1.915 | 0.042 |
| 1.916 | 0.042 |
| 1.917 | 0.042 |
| 1.918 | 0.042 |
| 1.919 | 0.042 |
| 1.92 | 0.042 |
| 1.921 | 0.042 |
| 1.922 | 0.043 |
| 1.923 | 0.043 |
| 1.924 | 0.043 |
| 1.925 | 0.043 |
| 1.926 | 0.043 |
| 1.927 | 0.043 |
| 1.928 | 0.043 |
| 1.929 | 0.043 |
| 1.93 | 0.043 |
| 1.931 | 0.043 |
| 1.932 | 0.043 |
| 1.933 | 0.043 |
| 1.934 | 0.044 |
| 1.935 | 0.044 |
| 1.936 | 0.044 |
| 1.937 | 0.044 |
| 1.938 | 0.044 |
| 1.939 | 0.044 |
| 1.94 | 0.044 |
| 1.941 | 0.044 |
| 1.942 | 0.044 |
| 1.943 | 0.044 |
| 1.944 | 0.044 |
| 1.945 | 0.045 |
| 1.946 | 0.045 |
| 1.947 | 0.045 |
| 1.948 | 0.045 |
| 1.949 | 0.045 |
| 1.95 | 0.045 |
| 1.951 | 0.045 |
| 1.952 | 0.045 |
| 1.953 | 0.045 |
| 1.954 | 0.045 |
| 1.955 | 0.045 |
| 1.956 | 0.046 |
| 1.957 | 0.046 |
| 1.958 | 0.046 |
| 1.959 | 0.046 |
| 1.96 | 0.046 |
| 1.961 | 0.046 |
| 1.962 | 0.046 |
| 1.963 | 0.046 |
| 1.964 | 0.046 |
| 1.965 | 0.046 |
| 1.966 | 0.046 |
| 1.967 | 0.047 |
| 1.968 | 0.047 |
| 1.969 | 0.047 |
| 1.97 | 0.047 |
| 1.971 | 0.047 |
| 1.972 | 0.047 |
| 1.973 | 0.047 |
| 1.974 | 0.047 |
| 1.975 | 0.047 |
| 1.976 | 0.047 |
| 1.977 | 0.048 |
| 1.978 | 0.048 |
| 1.979 | 0.048 |
| 1.98 | 0.048 |
| 1.981 | 0.048 |
| 1.982 | 0.048 |
| 1.983 | 0.048 |
| 1.984 | 0.048 |
| 1.985 | 0.048 |
| 1.986 | 0.048 |
| 1.987 | 0.049 |
| 1.988 | 0.049 |
| 1.989 | 0.049 |
| 1.99 | 0.049 |
| 1.991 | 0.049 |
| 1.992 | 0.049 |
| 1.993 | 0.049 |
| 1.994 | 0.049 |
| 1.995 | 0.049 |
| 1.996 | 0.049 |
| 1.997 | 0.049 |
| 1.998 | 0.05 |
| 1.999 | 0.05 |
| 2.0 | 0.05 |
| 2.001 | 0.05 |
| 2.002 | 0.05 |
| 2.003 | 0.05 |
| 2.004 | 0.05 |
| 2.005 | 0.05 |
| 2.006 | 0.05 |
| 2.007 | 0.05 |
| 2.008 | 0.051 |
| 2.009 | 0.051 |
| 2.01 | 0.051 |
| 2.011 | 0.051 |
| 2.012 | 0.051 |
| 2.013 | 0.051 |
| 2.014 | 0.051 |
| 2.015 | 0.051 |
| 2.016 | 0.051 |
| 2.017 | 0.052 |
| 2.018 | 0.052 |
| 2.019 | 0.052 |
| 2.02 | 0.052 |
| 2.021 | 0.052 |
| 2.022 | 0.052 |
| 2.023 | 0.052 |
| 2.024 | 0.052 |
| 2.025 | 0.052 |
| 2.026 | 0.052 |
| 2.027 | 0.053 |
| 2.028 | 0.053 |
| 2.029 | 0.053 |
| 2.03 | 0.053 |
| 2.031 | 0.053 |
| 2.032 | 0.053 |
| 2.033 | 0.053 |
| 2.034 | 0.053 |
| 2.035 | 0.053 |
| 2.036 | 0.053 |
| 2.037 | 0.054 |
| 2.038 | 0.054 |
| 2.039 | 0.054 |
| 2.04 | 0.054 |
| 2.041 | 0.054 |
| 2.042 | 0.054 |
| 2.043 | 0.054 |
| 2.044 | 0.054 |
| 2.045 | 0.054 |
| 2.046 | 0.055 |
| 2.047 | 0.055 |
| 2.048 | 0.055 |
| 2.049 | 0.055 |
| 2.05 | 0.055 |
| 2.051 | 0.055 |
| 2.052 | 0.055 |
| 2.053 | 0.055 |
| 2.054 | 0.055 |
| 2.055 | 0.056 |
| 2.056 | 0.056 |
| 2.057 | 0.056 |
| 2.058 | 0.056 |
| 2.059 | 0.056 |
| 2.06 | 0.056 |
| 2.061 | 0.056 |
| 2.062 | 0.056 |
| 2.063 | 0.056 |
| 2.064 | 0.057 |
| 2.065 | 0.057 |
| 2.066 | 0.057 |
| 2.067 | 0.057 |
| 2.068 | 0.057 |
| 2.069 | 0.057 |
| 2.07 | 0.057 |
| 2.071 | 0.057 |
| 2.072 | 0.057 |
| 2.073 | 0.058 |
| 2.074 | 0.058 |
| 2.075 | 0.058 |
| 2.076 | 0.058 |
| 2.077 | 0.058 |
| 2.078 | 0.058 |
| 2.079 | 0.058 |
| 2.08 | 0.058 |
| 2.081 | 0.058 |
| 2.082 | 0.059 |
| 2.083 | 0.059 |
| 2.084 | 0.059 |
| 2.085 | 0.059 |
| 2.086 | 0.059 |
| 2.087 | 0.059 |
| 2.088 | 0.059 |
| 2.089 | 0.059 |
| 2.09 | 0.059 |
| 2.091 | 0.06 |
| 2.092 | 0.06 |
| 2.093 | 0.06 |
| 2.094 | 0.06 |
| 2.095 | 0.06 |
| 2.096 | 0.06 |
| 2.097 | 0.06 |
| 2.098 | 0.06 |
| 2.099 | 0.06 |
| 2.1 | 0.061 |
| 2.101 | 0.061 |
| 2.102 | 0.061 |
| 2.103 | 0.061 |
| 2.104 | 0.061 |
| 2.105 | 0.061 |
| 2.106 | 0.061 |
| 2.107 | 0.061 |
| 2.108 | 0.062 |
| 2.109 | 0.062 |
| 2.11 | 0.062 |
| 2.111 | 0.062 |
| 2.112 | 0.062 |
| 2.113 | 0.062 |
| 2.114 | 0.062 |
| 2.115 | 0.062 |
| 2.116 | 0.063 |
| 2.117 | 0.063 |
| 2.118 | 0.063 |
| 2.119 | 0.063 |
| 2.12 | 0.063 |
| 2.121 | 0.063 |
| 2.122 | 0.063 |
| 2.123 | 0.063 |
| 2.124 | 0.063 |
| 2.125 | 0.064 |
| 2.126 | 0.064 |
| 2.127 | 0.064 |
| 2.128 | 0.064 |
| 2.129 | 0.064 |
| 2.13 | 0.064 |
| 2.131 | 0.064 |
| 2.132 | 0.064 |
| 2.133 | 0.065 |
| 2.134 | 0.065 |
| 2.135 | 0.065 |
| 2.136 | 0.065 |
| 2.137 | 0.065 |
| 2.138 | 0.065 |
| 2.139 | 0.065 |
| 2.14 | 0.065 |
| 2.141 | 0.066 |
| 2.142 | 0.066 |
| 2.143 | 0.066 |
| 2.144 | 0.066 |
| 2.145 | 0.066 |
| 2.146 | 0.066 |
| 2.147 | 0.066 |
| 2.148 | 0.066 |
| 2.149 | 0.067 |
| 2.15 | 0.067 |
| 2.151 | 0.067 |
| 2.152 | 0.067 |
| 2.153 | 0.067 |
| 2.154 | 0.067 |
| 2.155 | 0.067 |
| 2.156 | 0.067 |
| 2.157 | 0.068 |
| 2.158 | 0.068 |
| 2.159 | 0.068 |
| 2.16 | 0.068 |
| 2.161 | 0.068 |
| 2.162 | 0.068 |
| 2.163 | 0.068 |
| 2.164 | 0.068 |
| 2.165 | 0.069 |
| 2.166 | 0.069 |
| 2.167 | 0.069 |
| 2.168 | 0.069 |
| 2.169 | 0.069 |
| 2.17 | 0.069 |
| 2.171 | 0.069 |
| 2.172 | 0.07 |
| 2.173 | 0.07 |
| 2.174 | 0.07 |
| 2.175 | 0.07 |
| 2.176 | 0.07 |
| 2.177 | 0.07 |
| 2.178 | 0.07 |
| 2.179 | 0.07 |
| 2.18 | 0.071 |
| 2.181 | 0.071 |
| 2.182 | 0.071 |
| 2.183 | 0.071 |
| 2.184 | 0.071 |
| 2.185 | 0.071 |
| 2.186 | 0.071 |
| 2.187 | 0.072 |
| 2.188 | 0.072 |
| 2.189 | 0.072 |
| 2.19 | 0.072 |
| 2.191 | 0.072 |
| 2.192 | 0.072 |
| 2.193 | 0.072 |
| 2.194 | 0.072 |
| 2.195 | 0.073 |
| 2.196 | 0.073 |
| 2.197 | 0.073 |
| 2.198 | 0.073 |
| 2.199 | 0.073 |
| 2.2 | 0.073 |
| 2.201 | 0.073 |
| 2.202 | 0.074 |
| 2.203 | 0.074 |
| 2.204 | 0.074 |
| 2.205 | 0.074 |
| 2.206 | 0.074 |
| 2.207 | 0.074 |
| 2.208 | 0.074 |
| 2.209 | 0.075 |
| 2.21 | 0.075 |
| 2.211 | 0.075 |
| 2.212 | 0.075 |
| 2.213 | 0.075 |
| 2.214 | 0.075 |
| 2.215 | 0.075 |
| 2.216 | 0.076 |
| 2.217 | 0.076 |
| 2.218 | 0.076 |
| 2.219 | 0.076 |
| 2.22 | 0.076 |
| 2.221 | 0.076 |
| 2.222 | 0.076 |
| 2.223 | 0.076 |
| 2.224 | 0.077 |
| 2.225 | 0.077 |
| 2.226 | 0.077 |
| 2.227 | 0.077 |
| 2.228 | 0.077 |
| 2.229 | 0.077 |
| 2.23 | 0.077 |
| 2.231 | 0.078 |
| 2.232 | 0.078 |
| 2.233 | 0.078 |
| 2.234 | 0.078 |
| 2.235 | 0.078 |
| 2.236 | 0.078 |
| 2.237 | 0.078 |
| 2.238 | 0.079 |
| 2.239 | 0.079 |
| 2.24 | 0.079 |
| 2.241 | 0.079 |
| 2.242 | 0.079 |
| 2.243 | 0.079 |
| 2.244 | 0.08 |
| 2.245 | 0.08 |
| 2.246 | 0.08 |
| 2.247 | 0.08 |
| 2.248 | 0.08 |
| 2.249 | 0.08 |
| 2.25 | 0.08 |
| 2.251 | 0.081 |
| 2.252 | 0.081 |
| 2.253 | 0.081 |
| 2.254 | 0.081 |
| 2.255 | 0.081 |
| 2.256 | 0.081 |
| 2.257 | 0.081 |
| 2.258 | 0.082 |
| 2.259 | 0.082 |
| 2.26 | 0.082 |
| 2.261 | 0.082 |
| 2.262 | 0.082 |
| 2.263 | 0.082 |
| 2.264 | 0.082 |
| 2.265 | 0.083 |
| 2.266 | 0.083 |
| 2.267 | 0.083 |
| 2.268 | 0.083 |
| 2.269 | 0.083 |
| 2.27 | 0.083 |
| 2.271 | 0.084 |
| 2.272 | 0.084 |
| 2.273 | 0.084 |
| 2.274 | 0.084 |
| 2.275 | 0.084 |
| 2.276 | 0.084 |
| 2.277 | 0.084 |
| 2.278 | 0.085 |
| 2.279 | 0.085 |
| 2.28 | 0.085 |
| 2.281 | 0.085 |
| 2.282 | 0.085 |
| 2.283 | 0.085 |
| 2.284 | 0.086 |
| 2.285 | 0.086 |
| 2.286 | 0.086 |
| 2.287 | 0.086 |
| 2.288 | 0.086 |
| 2.289 | 0.086 |
| 2.29 | 0.086 |
| 2.291 | 0.087 |
| 2.292 | 0.087 |
| 2.293 | 0.087 |
| 2.294 | 0.087 |
| 2.295 | 0.087 |
| 2.296 | 0.087 |
| 2.297 | 0.088 |
| 2.298 | 0.088 |
| 2.299 | 0.088 |
| 2.3 | 0.088 |
| 2.301 | 0.088 |
| 2.302 | 0.088 |
| 2.303 | 0.089 |
| 2.304 | 0.089 |
| 2.305 | 0.089 |
| 2.306 | 0.089 |
| 2.307 | 0.089 |
| 2.308 | 0.089 |
| 2.309 | 0.089 |
| 2.31 | 0.09 |
| 2.311 | 0.09 |
| 2.312 | 0.09 |
| 2.313 | 0.09 |
| 2.314 | 0.09 |
| 2.315 | 0.09 |
| 2.316 | 0.091 |
| 2.317 | 0.091 |
| 2.318 | 0.091 |
| 2.319 | 0.091 |
| 2.32 | 0.091 |
| 2.321 | 0.091 |
| 2.322 | 0.092 |
| 2.323 | 0.092 |
| 2.324 | 0.092 |
| 2.325 | 0.092 |
| 2.326 | 0.092 |
| 2.327 | 0.092 |
| 2.328 | 0.093 |
| 2.329 | 0.093 |
| 2.33 | 0.093 |
| 2.331 | 0.093 |
| 2.332 | 0.093 |
| 2.333 | 0.093 |
| 2.334 | 0.094 |
| 2.335 | 0.094 |
| 2.336 | 0.094 |
| 2.337 | 0.094 |
| 2.338 | 0.094 |
| 2.339 | 0.094 |
| 2.34 | 0.095 |
| 2.341 | 0.095 |
| 2.342 | 0.095 |
| 2.343 | 0.095 |
| 2.344 | 0.095 |
| 2.345 | 0.095 |
| 2.346 | 0.096 |
| 2.347 | 0.096 |
| 2.348 | 0.096 |
| 2.349 | 0.096 |
| 2.35 | 0.096 |
| 2.351 | 0.096 |
| 2.352 | 0.097 |
| 2.353 | 0.097 |
| 2.354 | 0.097 |
| 2.355 | 0.097 |
| 2.356 | 0.097 |
| 2.357 | 0.097 |
| 2.358 | 0.098 |
| 2.359 | 0.098 |
| 2.36 | 0.098 |
| 2.361 | 0.098 |
| 2.362 | 0.098 |
| 2.363 | 0.098 |
| 2.364 | 0.099 |
| 2.365 | 0.099 |
| 2.366 | 0.099 |
| 2.367 | 0.099 |
| 2.368 | 0.099 |
| 2.369 | 0.1 |
| 2.37 | 0.1 |
| 2.371 | 0.1 |
| 2.372 | 0.1 |
| 2.373 | 0.1 |
| 2.374 | 0.1 |
| 2.375 | 0.101 |
| 2.376 | 0.101 |
| 2.377 | 0.101 |
| 2.378 | 0.101 |
| 2.379 | 0.101 |
| 2.38 | 0.101 |
| 2.381 | 0.102 |
| 2.382 | 0.102 |
| 2.383 | 0.102 |
| 2.384 | 0.102 |
| 2.385 | 0.102 |
| 2.386 | 0.103 |
| 2.387 | 0.103 |
| 2.388 | 0.103 |
| 2.389 | 0.103 |
| 2.39 | 0.103 |
| 2.391 | 0.103 |
| 2.392 | 0.104 |
| 2.393 | 0.104 |
| 2.394 | 0.104 |
| 2.395 | 0.104 |
| 2.396 | 0.104 |
| 2.397 | 0.105 |
| 2.398 | 0.105 |
| 2.399 | 0.105 |
| 2.4 | 0.105 |
| 2.401 | 0.105 |
| 2.402 | 0.105 |
| 2.403 | 0.106 |
| 2.404 | 0.106 |
| 2.405 | 0.106 |
| 2.406 | 0.106 |
| 2.407 | 0.106 |
| 2.408 | 0.107 |
| 2.409 | 0.107 |
| 2.41 | 0.107 |
| 2.411 | 0.107 |
| 2.412 | 0.107 |
| 2.413 | 0.107 |
| 2.414 | 0.108 |
| 2.415 | 0.108 |
| 2.416 | 0.108 |
| 2.417 | 0.108 |
| 2.418 | 0.108 |
| 2.419 | 0.109 |
| 2.42 | 0.109 |
| 2.421 | 0.109 |
| 2.422 | 0.109 |
| 2.423 | 0.109 |
| 2.424 | 0.109 |
| 2.425 | 0.11 |
| 2.426 | 0.11 |
| 2.427 | 0.11 |
| 2.428 | 0.11 |
| 2.429 | 0.11 |
| 2.43 | 0.111 |
| 2.431 | 0.111 |
| 2.432 | 0.111 |
| 2.433 | 0.111 |
| 2.434 | 0.111 |
| 2.435 | 0.112 |
| 2.436 | 0.112 |
| 2.437 | 0.112 |
| 2.438 | 0.112 |
| 2.439 | 0.112 |
| 2.44 | 0.113 |
| 2.441 | 0.113 |
| 2.442 | 0.113 |
| 2.443 | 0.113 |
| 2.444 | 0.113 |
| 2.445 | 0.113 |
| 2.446 | 0.114 |
| 2.447 | 0.114 |
| 2.448 | 0.114 |
| 2.449 | 0.114 |
| 2.45 | 0.114 |
| 2.451 | 0.115 |
| 2.452 | 0.115 |
| 2.453 | 0.115 |
| 2.454 | 0.115 |
| 2.455 | 0.115 |
| 2.456 | 0.116 |
| 2.457 | 0.116 |
| 2.458 | 0.116 |
| 2.459 | 0.116 |
| 2.46 | 0.116 |
| 2.461 | 0.117 |
| 2.462 | 0.117 |
| 2.463 | 0.117 |
| 2.464 | 0.117 |
| 2.465 | 0.117 |
| 2.466 | 0.118 |
| 2.467 | 0.118 |
| 2.468 | 0.118 |
| 2.469 | 0.118 |
| 2.47 | 0.118 |
| 2.471 | 0.119 |
| 2.472 | 0.119 |
| 2.473 | 0.119 |
| 2.474 | 0.119 |
| 2.475 | 0.119 |
| 2.476 | 0.12 |
| 2.477 | 0.12 |
| 2.478 | 0.12 |
| 2.479 | 0.12 |
| 2.48 | 0.12 |
| 2.481 | 0.121 |
| 2.482 | 0.121 |
| 2.483 | 0.121 |
| 2.484 | 0.121 |
| 2.485 | 0.121 |
| 2.486 | 0.122 |
| 2.487 | 0.122 |
| 2.488 | 0.122 |
| 2.489 | 0.122 |
| 2.49 | 0.122 |
| 2.491 | 0.123 |
| 2.492 | 0.123 |
| 2.493 | 0.123 |
| 2.494 | 0.123 |
| 2.495 | 0.123 |
| 2.496 | 0.124 |
| 2.497 | 0.124 |
| 2.498 | 0.124 |
| 2.499 | 0.124 |
| 2.5 | 0.125 |
| 2.501 | 0.125 |
| 2.502 | 0.125 |
| 2.503 | 0.125 |
| 2.504 | 0.125 |
| 2.505 | 0.126 |
| 2.506 | 0.126 |
| 2.507 | 0.126 |
| 2.508 | 0.126 |
| 2.509 | 0.126 |
| 2.51 | 0.127 |
| 2.511 | 0.127 |
| 2.512 | 0.127 |
| 2.513 | 0.127 |
| 2.514 | 0.127 |
| 2.515 | 0.128 |
| 2.516 | 0.128 |
| 2.517 | 0.128 |
| 2.518 | 0.128 |
| 2.519 | 0.129 |
| 2.52 | 0.129 |
| 2.521 | 0.129 |
| 2.522 | 0.129 |
| 2.523 | 0.129 |
| 2.524 | 0.13 |
| 2.525 | 0.13 |
| 2.526 | 0.13 |
| 2.527 | 0.13 |
| 2.528 | 0.13 |
| 2.529 | 0.131 |
| 2.53 | 0.131 |
| 2.531 | 0.131 |
| 2.532 | 0.131 |
| 2.533 | 0.132 |
| 2.534 | 0.132 |
| 2.535 | 0.132 |
| 2.536 | 0.132 |
| 2.537 | 0.132 |
| 2.538 | 0.133 |
| 2.539 | 0.133 |
| 2.54 | 0.133 |
| 2.541 | 0.133 |
| 2.542 | 0.133 |
| 2.543 | 0.134 |
| 2.544 | 0.134 |
| 2.545 | 0.134 |
| 2.546 | 0.134 |
| 2.547 | 0.135 |
| 2.548 | 0.135 |
| 2.549 | 0.135 |
| 2.55 | 0.135 |
| 2.551 | 0.135 |
| 2.552 | 0.136 |
| 2.553 | 0.136 |
| 2.554 | 0.136 |
| 2.555 | 0.136 |
| 2.556 | 0.137 |
| 2.557 | 0.137 |
| 2.558 | 0.137 |
| 2.559 | 0.137 |
| 2.56 | 0.137 |
| 2.561 | 0.138 |
| 2.562 | 0.138 |
| 2.563 | 0.138 |
| 2.564 | 0.138 |
| 2.565 | 0.139 |
| 2.566 | 0.139 |
| 2.567 | 0.139 |
| 2.568 | 0.139 |
| 2.569 | 0.139 |
| 2.57 | 0.14 |
| 2.571 | 0.14 |
| 2.572 | 0.14 |
| 2.573 | 0.14 |
| 2.574 | 0.141 |
| 2.575 | 0.141 |
| 2.576 | 0.141 |
| 2.577 | 0.141 |
| 2.578 | 0.142 |
| 2.579 | 0.142 |
| 2.58 | 0.142 |
| 2.581 | 0.142 |
| 2.582 | 0.142 |
| 2.583 | 0.143 |
| 2.584 | 0.143 |
| 2.585 | 0.143 |
| 2.586 | 0.143 |
| 2.587 | 0.144 |
| 2.588 | 0.144 |
| 2.589 | 0.144 |
| 2.59 | 0.144 |
| 2.591 | 0.145 |
| 2.592 | 0.145 |
| 2.593 | 0.145 |
| 2.594 | 0.145 |
| 2.595 | 0.145 |
| 2.596 | 0.146 |
| 2.597 | 0.146 |
| 2.598 | 0.146 |
| 2.599 | 0.146 |
| 2.6 | 0.147 |
| 2.601 | 0.147 |
| 2.602 | 0.147 |
| 2.603 | 0.147 |
| 2.604 | 0.148 |
| 2.605 | 0.148 |
| 2.606 | 0.148 |
| 2.607 | 0.148 |
| 2.608 | 0.148 |
| 2.609 | 0.149 |
| 2.61 | 0.149 |
| 2.611 | 0.149 |
| 2.612 | 0.149 |
| 2.613 | 0.15 |
| 2.614 | 0.15 |
| 2.615 | 0.15 |
| 2.616 | 0.15 |
| 2.617 | 0.151 |
| 2.618 | 0.151 |
| 2.619 | 0.151 |
| 2.62 | 0.151 |
| 2.621 | 0.152 |
| 2.622 | 0.152 |
| 2.623 | 0.152 |
| 2.624 | 0.152 |
| 2.625 | 0.153 |
| 2.626 | 0.153 |
| 2.627 | 0.153 |
| 2.628 | 0.153 |
| 2.629 | 0.154 |
| 2.63 | 0.154 |
| 2.631 | 0.154 |
| 2.632 | 0.154 |
| 2.633 | 0.154 |
| 2.634 | 0.155 |
| 2.635 | 0.155 |
| 2.636 | 0.155 |
| 2.637 | 0.155 |
| 2.638 | 0.156 |
| 2.639 | 0.156 |
| 2.64 | 0.156 |
| 2.641 | 0.156 |
| 2.642 | 0.157 |
| 2.643 | 0.157 |
| 2.644 | 0.157 |
| 2.645 | 0.157 |
| 2.646 | 0.158 |
| 2.647 | 0.158 |
| 2.648 | 0.158 |
| 2.649 | 0.158 |
| 2.65 | 0.159 |
| 2.651 | 0.159 |
| 2.652 | 0.159 |
| 2.653 | 0.159 |
| 2.654 | 0.16 |
| 2.655 | 0.16 |
| 2.656 | 0.16 |
| 2.657 | 0.16 |
| 2.658 | 0.161 |
| 2.659 | 0.161 |
| 2.66 | 0.161 |
| 2.661 | 0.161 |
| 2.662 | 0.162 |
| 2.663 | 0.162 |
| 2.664 | 0.162 |
| 2.665 | 0.162 |
| 2.666 | 0.163 |
| 2.667 | 0.163 |
| 2.668 | 0.163 |
| 2.669 | 0.163 |
| 2.67 | 0.164 |
| 2.671 | 0.164 |
| 2.672 | 0.164 |
| 2.673 | 0.164 |
| 2.674 | 0.165 |
| 2.675 | 0.165 |
| 2.676 | 0.165 |
| 2.677 | 0.166 |
| 2.678 | 0.166 |
| 2.679 | 0.166 |
| 2.68 | 0.166 |
| 2.681 | 0.167 |
| 2.682 | 0.167 |
| 2.683 | 0.167 |
| 2.684 | 0.167 |
| 2.685 | 0.168 |
| 2.686 | 0.168 |
| 2.687 | 0.168 |
| 2.688 | 0.168 |
| 2.689 | 0.169 |
| 2.69 | 0.169 |
| 2.691 | 0.169 |
| 2.692 | 0.169 |
| 2.693 | 0.17 |
| 2.694 | 0.17 |
| 2.695 | 0.17 |
| 2.696 | 0.17 |
| 2.697 | 0.171 |
| 2.698 | 0.171 |
| 2.699 | 0.171 |
| 2.7 | 0.171 |
| 2.701 | 0.172 |
| 2.702 | 0.172 |
| 2.703 | 0.172 |
| 2.704 | 0.173 |
| 2.705 | 0.173 |
| 2.706 | 0.173 |
| 2.707 | 0.173 |
| 2.708 | 0.174 |
| 2.709 | 0.174 |
| 2.71 | 0.174 |
| 2.711 | 0.174 |
| 2.712 | 0.175 |
| 2.713 | 0.175 |
| 2.714 | 0.175 |
| 2.715 | 0.175 |
| 2.716 | 0.176 |
| 2.717 | 0.176 |
| 2.718 | 0.176 |
| 2.719 | 0.177 |
| 2.72 | 0.177 |
| 2.721 | 0.177 |
| 2.722 | 0.177 |
| 2.723 | 0.178 |
| 2.724 | 0.178 |
| 2.725 | 0.178 |
| 2.726 | 0.178 |
| 2.727 | 0.179 |
| 2.728 | 0.179 |
| 2.729 | 0.179 |
| 2.73 | 0.179 |
| 2.731 | 0.18 |
| 2.732 | 0.18 |
| 2.733 | 0.18 |
| 2.734 | 0.181 |
| 2.735 | 0.181 |
| 2.736 | 0.181 |
| 2.737 | 0.181 |
| 2.738 | 0.182 |
| 2.739 | 0.182 |
| 2.74 | 0.182 |
| 2.741 | 0.182 |
| 2.742 | 0.183 |
| 2.743 | 0.183 |
| 2.744 | 0.183 |
| 2.745 | 0.184 |
| 2.746 | 0.184 |
| 2.747 | 0.184 |
| 2.748 | 0.184 |
| 2.749 | 0.185 |
| 2.75 | 0.185 |
| 2.751 | 0.185 |
| 2.752 | 0.186 |
| 2.753 | 0.186 |
| 2.754 | 0.186 |
| 2.755 | 0.186 |
| 2.756 | 0.187 |
| 2.757 | 0.187 |
| 2.758 | 0.187 |
| 2.759 | 0.187 |
| 2.76 | 0.188 |
| 2.761 | 0.188 |
| 2.762 | 0.188 |
| 2.763 | 0.189 |
| 2.764 | 0.189 |
| 2.765 | 0.189 |
| 2.766 | 0.189 |
| 2.767 | 0.19 |
| 2.768 | 0.19 |
| 2.769 | 0.19 |
| 2.77 | 0.191 |
| 2.771 | 0.191 |
| 2.772 | 0.191 |
| 2.773 | 0.191 |
| 2.774 | 0.192 |
| 2.775 | 0.192 |
| 2.776 | 0.192 |
| 2.777 | 0.193 |
| 2.778 | 0.193 |
| 2.779 | 0.193 |
| 2.78 | 0.193 |
| 2.781 | 0.194 |
| 2.782 | 0.194 |
| 2.783 | 0.194 |
| 2.784 | 0.195 |
| 2.785 | 0.195 |
| 2.786 | 0.195 |
| 2.787 | 0.195 |
| 2.788 | 0.196 |
| 2.789 | 0.196 |
| 2.79 | 0.196 |
| 2.791 | 0.197 |
| 2.792 | 0.197 |
| 2.793 | 0.197 |
| 2.794 | 0.197 |
| 2.795 | 0.198 |
| 2.796 | 0.198 |
| 2.797 | 0.198 |
| 2.798 | 0.199 |
| 2.799 | 0.199 |
| 2.8 | 0.199 |
| 2.801 | 0.2 |
| 2.802 | 0.2 |
| 2.803 | 0.2 |
| 2.804 | 0.2 |
| 2.805 | 0.201 |
| 2.806 | 0.201 |
| 2.807 | 0.201 |
| 2.808 | 0.202 |
| 2.809 | 0.202 |
| 2.81 | 0.202 |
| 2.811 | 0.202 |
| 2.812 | 0.203 |
| 2.813 | 0.203 |
| 2.814 | 0.203 |
| 2.815 | 0.204 |
| 2.816 | 0.204 |
| 2.817 | 0.204 |
| 2.818 | 0.205 |
| 2.819 | 0.205 |
| 2.82 | 0.205 |
| 2.821 | 0.205 |
| 2.822 | 0.206 |
| 2.823 | 0.206 |
| 2.824 | 0.206 |
| 2.825 | 0.207 |
| 2.826 | 0.207 |
| 2.827 | 0.207 |
| 2.828 | 0.208 |
| 2.829 | 0.208 |
| 2.83 | 0.208 |
| 2.831 | 0.208 |
| 2.832 | 0.209 |
| 2.833 | 0.209 |
| 2.834 | 0.209 |
| 2.835 | 0.21 |
| 2.836 | 0.21 |
| 2.837 | 0.21 |
| 2.838 | 0.211 |
| 2.839 | 0.211 |
| 2.84 | 0.211 |
| 2.841 | 0.211 |
| 2.842 | 0.212 |
| 2.843 | 0.212 |
| 2.844 | 0.212 |
| 2.845 | 0.213 |
| 2.846 | 0.213 |
| 2.847 | 0.213 |
| 2.848 | 0.214 |
| 2.849 | 0.214 |
| 2.85 | 0.214 |
| 2.851 | 0.215 |
| 2.852 | 0.215 |
| 2.853 | 0.215 |
| 2.854 | 0.215 |
| 2.855 | 0.216 |
| 2.856 | 0.216 |
| 2.857 | 0.216 |
| 2.858 | 0.217 |
| 2.859 | 0.217 |
| 2.86 | 0.217 |
| 2.861 | 0.218 |
| 2.862 | 0.218 |
| 2.863 | 0.218 |
| 2.864 | 0.219 |
| 2.865 | 0.219 |
| 2.866 | 0.219 |
| 2.867 | 0.219 |
| 2.868 | 0.22 |
| 2.869 | 0.22 |
| 2.87 | 0.22 |
| 2.871 | 0.221 |
| 2.872 | 0.221 |
| 2.873 | 0.221 |
| 2.874 | 0.222 |
| 2.875 | 0.222 |
| 2.876 | 0.222 |
| 2.877 | 0.223 |
| 2.878 | 0.223 |
| 2.879 | 0.223 |
| 2.88 | 0.224 |
| 2.881 | 0.224 |
| 2.882 | 0.224 |
| 2.883 | 0.224 |
| 2.884 | 0.225 |
| 2.885 | 0.225 |
| 2.886 | 0.225 |
| 2.887 | 0.226 |
| 2.888 | 0.226 |
| 2.889 | 0.226 |
| 2.89 | 0.227 |
| 2.891 | 0.227 |
| 2.892 | 0.227 |
| 2.893 | 0.228 |
| 2.894 | 0.228 |
| 2.895 | 0.228 |
| 2.896 | 0.229 |
| 2.897 | 0.229 |
| 2.898 | 0.229 |
| 2.899 | 0.23 |
| 2.9 | 0.23 |
| 2.901 | 0.23 |
| 2.902 | 0.231 |
| 2.903 | 0.231 |
| 2.904 | 0.231 |
| 2.905 | 0.232 |
| 2.906 | 0.232 |
| 2.907 | 0.232 |
| 2.908 | 0.233 |
| 2.909 | 0.233 |
| 2.91 | 0.233 |
| 2.911 | 0.233 |
| 2.912 | 0.234 |
| 2.913 | 0.234 |
| 2.914 | 0.234 |
| 2.915 | 0.235 |
| 2.916 | 0.235 |
| 2.917 | 0.235 |
| 2.918 | 0.236 |
| 2.919 | 0.236 |
| 2.92 | 0.236 |
| 2.921 | 0.237 |
| 2.922 | 0.237 |
| 2.923 | 0.237 |
| 2.924 | 0.238 |
| 2.925 | 0.238 |
| 2.926 | 0.238 |
| 2.927 | 0.239 |
| 2.928 | 0.239 |
| 2.929 | 0.239 |
| 2.93 | 0.24 |
| 2.931 | 0.24 |
| 2.932 | 0.24 |
| 2.933 | 0.241 |
| 2.934 | 0.241 |
| 2.935 | 0.241 |
| 2.936 | 0.242 |
| 2.937 | 0.242 |
| 2.938 | 0.242 |
| 2.939 | 0.243 |
| 2.94 | 0.243 |
| 2.941 | 0.243 |
| 2.942 | 0.244 |
| 2.943 | 0.244 |
| 2.944 | 0.244 |
| 2.945 | 0.245 |
| 2.946 | 0.245 |
| 2.947 | 0.245 |
| 2.948 | 0.246 |
| 2.949 | 0.246 |
| 2.95 | 0.246 |
| 2.951 | 0.247 |
| 2.952 | 0.247 |
| 2.953 | 0.247 |
| 2.954 | 0.248 |
| 2.955 | 0.248 |
| 2.956 | 0.248 |
| 2.957 | 0.249 |
| 2.958 | 0.249 |
| 2.959 | 0.249 |
| 2.96 | 0.25 |
| 2.961 | 0.25 |
| 2.962 | 0.25 |
| 2.963 | 0.251 |
| 2.964 | 0.251 |
| 2.965 | 0.251 |
| 2.966 | 0.252 |
| 2.967 | 0.252 |
| 2.968 | 0.253 |
| 2.969 | 0.253 |
| 2.97 | 0.253 |
| 2.971 | 0.254 |
| 2.972 | 0.254 |
| 2.973 | 0.254 |
| 2.974 | 0.255 |
| 2.975 | 0.255 |
| 2.976 | 0.255 |
| 2.977 | 0.256 |
| 2.978 | 0.256 |
| 2.979 | 0.256 |
| 2.98 | 0.257 |
| 2.981 | 0.257 |
| 2.982 | 0.257 |
| 2.983 | 0.258 |
| 2.984 | 0.258 |
| 2.985 | 0.258 |
| 2.986 | 0.259 |
| 2.987 | 0.259 |
| 2.988 | 0.259 |
| 2.989 | 0.26 |
| 2.99 | 0.26 |
| 2.991 | 0.26 |
| 2.992 | 0.261 |
| 2.993 | 0.261 |
| 2.994 | 0.261 |
| 2.995 | 0.262 |
| 2.996 | 0.262 |
| 2.997 | 0.263 |
| 2.998 | 0.263 |
| 2.999 | 0.263 |
| 3.0 | 0.264 |
| 3.001 | 0.264 |
| 3.002 | 0.264 |
| 3.003 | 0.265 |
| 3.004 | 0.265 |
| 3.005 | 0.265 |
| 3.006 | 0.266 |
| 3.007 | 0.266 |
| 3.008 | 0.266 |
| 3.009 | 0.267 |
| 3.01 | 0.267 |
| 3.011 | 0.267 |
| 3.012 | 0.268 |
| 3.013 | 0.268 |
| 3.014 | 0.269 |
| 3.015 | 0.269 |
| 3.016 | 0.269 |
| 3.017 | 0.27 |
| 3.018 | 0.27 |
| 3.019 | 0.27 |
| 3.02 | 0.271 |
| 3.021 | 0.271 |
| 3.022 | 0.271 |
| 3.023 | 0.272 |
| 3.024 | 0.272 |
| 3.025 | 0.272 |
| 3.026 | 0.273 |
| 3.027 | 0.273 |
| 3.028 | 0.274 |
| 3.029 | 0.274 |
| 3.03 | 0.274 |
| 3.031 | 0.275 |
| 3.032 | 0.275 |
| 3.033 | 0.275 |
| 3.034 | 0.276 |
| 3.035 | 0.276 |
| 3.036 | 0.276 |
| 3.037 | 0.277 |
| 3.038 | 0.277 |
| 3.039 | 0.278 |
| 3.04 | 0.278 |
| 3.041 | 0.278 |
| 3.042 | 0.279 |
| 3.043 | 0.279 |
| 3.044 | 0.279 |
| 3.045 | 0.28 |
| 3.046 | 0.28 |
| 3.047 | 0.28 |
| 3.048 | 0.281 |
| 3.049 | 0.281 |
| 3.05 | 0.282 |
| 3.051 | 0.282 |
| 3.052 | 0.282 |
| 3.053 | 0.283 |
| 3.054 | 0.283 |
| 3.055 | 0.283 |
| 3.056 | 0.284 |
| 3.057 | 0.284 |
| 3.058 | 0.284 |
| 3.059 | 0.285 |
| 3.06 | 0.285 |
| 3.061 | 0.286 |
| 3.062 | 0.286 |
| 3.063 | 0.286 |
| 3.064 | 0.287 |
| 3.065 | 0.287 |
| 3.066 | 0.287 |
| 3.067 | 0.288 |
| 3.068 | 0.288 |
| 3.069 | 0.289 |
| 3.07 | 0.289 |
| 3.071 | 0.289 |
| 3.072 | 0.29 |
| 3.073 | 0.29 |
| 3.074 | 0.29 |
| 3.075 | 0.291 |
| 3.076 | 0.291 |
| 3.077 | 0.292 |
| 3.078 | 0.292 |
| 3.079 | 0.292 |
| 3.08 | 0.293 |
| 3.081 | 0.293 |
| 3.082 | 0.293 |
| 3.083 | 0.294 |
| 3.084 | 0.294 |
| 3.085 | 0.295 |
| 3.086 | 0.295 |
| 3.087 | 0.295 |
| 3.088 | 0.296 |
| 3.089 | 0.296 |
| 3.09 | 0.296 |
| 3.091 | 0.297 |
| 3.092 | 0.297 |
| 3.093 | 0.298 |
| 3.094 | 0.298 |
| 3.095 | 0.298 |
| 3.096 | 0.299 |
| 3.097 | 0.299 |
| 3.098 | 0.299 |
| 3.099 | 0.3 |
| 3.1 | 0.3 |
| 3.101 | 0.301 |
| 3.102 | 0.301 |
| 3.103 | 0.301 |
| 3.104 | 0.302 |
| 3.105 | 0.302 |
| 3.106 | 0.302 |
| 3.107 | 0.303 |
| 3.108 | 0.303 |
| 3.109 | 0.304 |
| 3.11 | 0.304 |
| 3.111 | 0.304 |
| 3.112 | 0.305 |
| 3.113 | 0.305 |
| 3.114 | 0.306 |
| 3.115 | 0.306 |
| 3.116 | 0.306 |
| 3.117 | 0.307 |
| 3.118 | 0.307 |
| 3.119 | 0.307 |
| 3.12 | 0.308 |
| 3.121 | 0.308 |
| 3.122 | 0.309 |
| 3.123 | 0.309 |
| 3.124 | 0.309 |
| 3.125 | 0.31 |
| 3.126 | 0.31 |
| 3.127 | 0.311 |
| 3.128 | 0.311 |
| 3.129 | 0.311 |
| 3.13 | 0.312 |
| 3.131 | 0.312 |
| 3.132 | 0.313 |
| 3.133 | 0.313 |
| 3.134 | 0.313 |
| 3.135 | 0.314 |
| 3.136 | 0.314 |
| 3.137 | 0.314 |
| 3.138 | 0.315 |
| 3.139 | 0.315 |
| 3.14 | 0.316 |
| 3.141 | 0.316 |
| 3.142 | 0.316 |
| 3.143 | 0.317 |
| 3.144 | 0.317 |
| 3.145 | 0.318 |
| 3.146 | 0.318 |
| 3.147 | 0.318 |
| 3.148 | 0.319 |
| 3.149 | 0.319 |
| 3.15 | 0.32 |
| 3.151 | 0.32 |
| 3.152 | 0.32 |
| 3.153 | 0.321 |
| 3.154 | 0.321 |
| 3.155 | 0.322 |
| 3.156 | 0.322 |
| 3.157 | 0.322 |
| 3.158 | 0.323 |
| 3.159 | 0.323 |
| 3.16 | 0.324 |
| 3.161 | 0.324 |
| 3.162 | 0.324 |
| 3.163 | 0.325 |
| 3.164 | 0.325 |
| 3.165 | 0.325 |
| 3.166 | 0.326 |
| 3.167 | 0.326 |
| 3.168 | 0.327 |
| 3.169 | 0.327 |
| 3.17 | 0.327 |
| 3.171 | 0.328 |
| 3.172 | 0.328 |
| 3.173 | 0.329 |
| 3.174 | 0.329 |
| 3.175 | 0.329 |
| 3.176 | 0.33 |
| 3.177 | 0.33 |
| 3.178 | 0.331 |
| 3.179 | 0.331 |
| 3.18 | 0.331 |
| 3.181 | 0.332 |
| 3.182 | 0.332 |
| 3.183 | 0.333 |
| 3.184 | 0.333 |
| 3.185 | 0.334 |
| 3.186 | 0.334 |
| 3.187 | 0.334 |
| 3.188 | 0.335 |
| 3.189 | 0.335 |
| 3.19 | 0.336 |
| 3.191 | 0.336 |
| 3.192 | 0.336 |
| 3.193 | 0.337 |
| 3.194 | 0.337 |
| 3.195 | 0.338 |
| 3.196 | 0.338 |
| 3.197 | 0.338 |
| 3.198 | 0.339 |
| 3.199 | 0.339 |
| 3.2 | 0.34 |
| 3.201 | 0.34 |
| 3.202 | 0.34 |
| 3.203 | 0.341 |
| 3.204 | 0.341 |
| 3.205 | 0.342 |
| 3.206 | 0.342 |
| 3.207 | 0.342 |
| 3.208 | 0.343 |
| 3.209 | 0.343 |
| 3.21 | 0.344 |
| 3.211 | 0.344 |
| 3.212 | 0.345 |
| 3.213 | 0.345 |
| 3.214 | 0.345 |
| 3.215 | 0.346 |
| 3.216 | 0.346 |
| 3.217 | 0.347 |
| 3.218 | 0.347 |
| 3.219 | 0.347 |
| 3.22 | 0.348 |
| 3.221 | 0.348 |
| 3.222 | 0.349 |
| 3.223 | 0.349 |
| 3.224 | 0.349 |
| 3.225 | 0.35 |
| 3.226 | 0.35 |
| 3.227 | 0.351 |
| 3.228 | 0.351 |
| 3.229 | 0.352 |
| 3.23 | 0.352 |
| 3.231 | 0.352 |
| 3.232 | 0.353 |
| 3.233 | 0.353 |
| 3.234 | 0.354 |
| 3.235 | 0.354 |
| 3.236 | 0.354 |
| 3.237 | 0.355 |
| 3.238 | 0.355 |
| 3.239 | 0.356 |
| 3.24 | 0.356 |
| 3.241 | 0.357 |
| 3.242 | 0.357 |
| 3.243 | 0.357 |
| 3.244 | 0.358 |
| 3.245 | 0.358 |
| 3.246 | 0.359 |
| 3.247 | 0.359 |
| 3.248 | 0.359 |
| 3.249 | 0.36 |
| 3.25 | 0.36 |
| 3.251 | 0.361 |
| 3.252 | 0.361 |
| 3.253 | 0.362 |
| 3.254 | 0.362 |
| 3.255 | 0.362 |
| 3.256 | 0.363 |
| 3.257 | 0.363 |
| 3.258 | 0.364 |
| 3.259 | 0.364 |
| 3.26 | 0.365 |
| 3.261 | 0.365 |
| 3.262 | 0.365 |
| 3.263 | 0.366 |
| 3.264 | 0.366 |
| 3.265 | 0.367 |
| 3.266 | 0.367 |
| 3.267 | 0.367 |
| 3.268 | 0.368 |
| 3.269 | 0.368 |
| 3.27 | 0.369 |
| 3.271 | 0.369 |
| 3.272 | 0.37 |
| 3.273 | 0.37 |
| 3.274 | 0.37 |
| 3.275 | 0.371 |
| 3.276 | 0.371 |
| 3.277 | 0.372 |
| 3.278 | 0.372 |
| 3.279 | 0.373 |
| 3.28 | 0.373 |
| 3.281 | 0.373 |
| 3.282 | 0.374 |
| 3.283 | 0.374 |
| 3.284 | 0.375 |
| 3.285 | 0.375 |
| 3.286 | 0.376 |
| 3.287 | 0.376 |
| 3.288 | 0.376 |
| 3.289 | 0.377 |
| 3.29 | 0.377 |
| 3.291 | 0.378 |
| 3.292 | 0.378 |
| 3.293 | 0.379 |
| 3.294 | 0.379 |
| 3.295 | 0.379 |
| 3.296 | 0.38 |
| 3.297 | 0.38 |
| 3.298 | 0.381 |
| 3.299 | 0.381 |
| 3.3 | 0.382 |
| 3.301 | 0.382 |
| 3.302 | 0.382 |
| 3.303 | 0.383 |
| 3.304 | 0.383 |
| 3.305 | 0.384 |
| 3.306 | 0.384 |
| 3.307 | 0.385 |
| 3.308 | 0.385 |
| 3.309 | 0.386 |
| 3.31 | 0.386 |
| 3.311 | 0.386 |
| 3.312 | 0.387 |
| 3.313 | 0.387 |
| 3.314 | 0.388 |
| 3.315 | 0.388 |
| 3.316 | 0.389 |
| 3.317 | 0.389 |
| 3.318 | 0.389 |
| 3.319 | 0.39 |
| 3.32 | 0.39 |
| 3.321 | 0.391 |
| 3.322 | 0.391 |
| 3.323 | 0.392 |
| 3.324 | 0.392 |
| 3.325 | 0.393 |
| 3.326 | 0.393 |
| 3.327 | 0.393 |
| 3.328 | 0.394 |
| 3.329 | 0.394 |
| 3.33 | 0.395 |
| 3.331 | 0.395 |
| 3.332 | 0.396 |
| 3.333 | 0.396 |
| 3.334 | 0.396 |
| 3.335 | 0.397 |
| 3.336 | 0.397 |
| 3.337 | 0.398 |
| 3.338 | 0.398 |
| 3.339 | 0.399 |
| 3.34 | 0.399 |
| 3.341 | 0.4 |
| 3.342 | 0.4 |
| 3.343 | 0.4 |
| 3.344 | 0.401 |
| 3.345 | 0.401 |
| 3.346 | 0.402 |
| 3.347 | 0.402 |
| 3.348 | 0.403 |
| 3.349 | 0.403 |
| 3.35 | 0.404 |
| 3.351 | 0.404 |
| 3.352 | 0.404 |
| 3.353 | 0.405 |
| 3.354 | 0.405 |
| 3.355 | 0.406 |
| 3.356 | 0.406 |
| 3.357 | 0.407 |
| 3.358 | 0.407 |
| 3.359 | 0.408 |
| 3.36 | 0.408 |
| 3.361 | 0.408 |
| 3.362 | 0.409 |
| 3.363 | 0.409 |
| 3.364 | 0.41 |
| 3.365 | 0.41 |
| 3.366 | 0.411 |
| 3.367 | 0.411 |
| 3.368 | 0.412 |
| 3.369 | 0.412 |
| 3.37 | 0.412 |
| 3.371 | 0.413 |
| 3.372 | 0.413 |
| 3.373 | 0.414 |
| 3.374 | 0.414 |
| 3.375 | 0.415 |
| 3.376 | 0.415 |
| 3.377 | 0.416 |
| 3.378 | 0.416 |
| 3.379 | 0.416 |
| 3.38 | 0.417 |
| 3.381 | 0.417 |
| 3.382 | 0.418 |
| 3.383 | 0.418 |
| 3.384 | 0.419 |
| 3.385 | 0.419 |
| 3.386 | 0.42 |
| 3.387 | 0.42 |
| 3.388 | 0.421 |
| 3.389 | 0.421 |
| 3.39 | 0.421 |
| 3.391 | 0.422 |
| 3.392 | 0.422 |
| 3.393 | 0.423 |
| 3.394 | 0.423 |
| 3.395 | 0.424 |
| 3.396 | 0.424 |
| 3.397 | 0.425 |
| 3.398 | 0.425 |
| 3.399 | 0.426 |
| 3.4 | 0.426 |
| 3.401 | 0.426 |
| 3.402 | 0.427 |
| 3.403 | 0.427 |
| 3.404 | 0.428 |
| 3.405 | 0.428 |
| 3.406 | 0.429 |
| 3.407 | 0.429 |
| 3.408 | 0.43 |
| 3.409 | 0.43 |
| 3.41 | 0.431 |
| 3.411 | 0.431 |
| 3.412 | 0.431 |
| 3.413 | 0.432 |
| 3.414 | 0.432 |
| 3.415 | 0.433 |
| 3.416 | 0.433 |
| 3.417 | 0.434 |
| 3.418 | 0.434 |
| 3.419 | 0.435 |
| 3.42 | 0.435 |
| 3.421 | 0.436 |
| 3.422 | 0.436 |
| 3.423 | 0.436 |
| 3.424 | 0.437 |
| 3.425 | 0.437 |
| 3.426 | 0.438 |
| 3.427 | 0.438 |
| 3.428 | 0.439 |
| 3.429 | 0.439 |
| 3.43 | 0.44 |
| 3.431 | 0.44 |
| 3.432 | 0.441 |
| 3.433 | 0.441 |
| 3.434 | 0.442 |
| 3.435 | 0.442 |
| 3.436 | 0.442 |
| 3.437 | 0.443 |
| 3.438 | 0.443 |
| 3.439 | 0.444 |
| 3.44 | 0.444 |
| 3.441 | 0.445 |
| 3.442 | 0.445 |
| 3.443 | 0.446 |
| 3.444 | 0.446 |
| 3.445 | 0.447 |
| 3.446 | 0.447 |
| 3.447 | 0.448 |
| 3.448 | 0.448 |
| 3.449 | 0.448 |
| 3.45 | 0.449 |
| 3.451 | 0.449 |
| 3.452 | 0.45 |
| 3.453 | 0.45 |
| 3.454 | 0.451 |
| 3.455 | 0.451 |
| 3.456 | 0.452 |
| 3.457 | 0.452 |
| 3.458 | 0.453 |
| 3.459 | 0.453 |
| 3.46 | 0.454 |
| 3.461 | 0.454 |
| 3.462 | 0.455 |
| 3.463 | 0.455 |
| 3.464 | 0.455 |
| 3.465 | 0.456 |
| 3.466 | 0.456 |
| 3.467 | 0.457 |
| 3.468 | 0.457 |
| 3.469 | 0.458 |
| 3.47 | 0.458 |
| 3.471 | 0.459 |
| 3.472 | 0.459 |
| 3.473 | 0.46 |
| 3.474 | 0.46 |
| 3.475 | 0.461 |
| 3.476 | 0.461 |
| 3.477 | 0.462 |
| 3.478 | 0.462 |
| 3.479 | 0.462 |
| 3.48 | 0.463 |
| 3.481 | 0.463 |
| 3.482 | 0.464 |
| 3.483 | 0.464 |
| 3.484 | 0.465 |
| 3.485 | 0.465 |
| 3.486 | 0.466 |
| 3.487 | 0.466 |
| 3.488 | 0.467 |
| 3.489 | 0.467 |
| 3.49 | 0.468 |
| 3.491 | 0.468 |
| 3.492 | 0.469 |
| 3.493 | 0.469 |
| 3.494 | 0.47 |
| 3.495 | 0.47 |
| 3.496 | 0.47 |
| 3.497 | 0.471 |
| 3.498 | 0.471 |
| 3.499 | 0.472 |
| 3.5 | 0.472 |
| 3.501 | 0.473 |
| 3.502 | 0.473 |
| 3.503 | 0.474 |
| 3.504 | 0.474 |
| 3.505 | 0.475 |
| 3.506 | 0.475 |
| 3.507 | 0.476 |
| 3.508 | 0.476 |
| 3.509 | 0.477 |
| 3.51 | 0.477 |
| 3.511 | 0.478 |
| 3.512 | 0.478 |
| 3.513 | 0.479 |
| 3.514 | 0.479 |
| 3.515 | 0.479 |
| 3.516 | 0.48 |
| 3.517 | 0.48 |
| 3.518 | 0.481 |
| 3.519 | 0.481 |
| 3.52 | 0.482 |
| 3.521 | 0.482 |
| 3.522 | 0.483 |
| 3.523 | 0.483 |
| 3.524 | 0.484 |
| 3.525 | 0.484 |
| 3.526 | 0.485 |
| 3.527 | 0.485 |
| 3.528 | 0.486 |
| 3.529 | 0.486 |
| 3.53 | 0.487 |
| 3.531 | 0.487 |
| 3.532 | 0.488 |
| 3.533 | 0.488 |
| 3.534 | 0.489 |
| 3.535 | 0.489 |
| 3.536 | 0.489 |
| 3.537 | 0.49 |
| 3.538 | 0.49 |
| 3.539 | 0.491 |
| 3.54 | 0.491 |
| 3.541 | 0.492 |
| 3.542 | 0.492 |
| 3.543 | 0.493 |
| 3.544 | 0.493 |
| 3.545 | 0.494 |
| 3.546 | 0.494 |
| 3.547 | 0.495 |
| 3.548 | 0.495 |
| 3.549 | 0.496 |
| 3.55 | 0.496 |
| 3.551 | 0.497 |
| 3.552 | 0.497 |
| 3.553 | 0.498 |
| 3.554 | 0.498 |
| 3.555 | 0.499 |
| 3.556 | 0.499 |
| 3.557 | 0.5 |
| 3.558 | 0.5 |
| 3.559 | 0.5 |
| 3.56 | 0.501 |
| 3.561 | 0.501 |
| 3.562 | 0.502 |
| 3.563 | 0.502 |
| 3.564 | 0.503 |
| 3.565 | 0.503 |
| 3.566 | 0.504 |
| 3.567 | 0.504 |
| 3.568 | 0.505 |
| 3.569 | 0.505 |
| 3.57 | 0.506 |
| 3.571 | 0.506 |
| 3.572 | 0.507 |
| 3.573 | 0.507 |
| 3.574 | 0.508 |
| 3.575 | 0.508 |
| 3.576 | 0.509 |
| 3.577 | 0.509 |
| 3.578 | 0.51 |
| 3.579 | 0.51 |
| 3.58 | 0.511 |
| 3.581 | 0.511 |
| 3.582 | 0.512 |
| 3.583 | 0.512 |
| 3.584 | 0.513 |
| 3.585 | 0.513 |
| 3.586 | 0.514 |
| 3.587 | 0.514 |
| 3.588 | 0.514 |
| 3.589 | 0.515 |
| 3.59 | 0.515 |
| 3.591 | 0.516 |
| 3.592 | 0.516 |
| 3.593 | 0.517 |
| 3.594 | 0.517 |
| 3.595 | 0.518 |
| 3.596 | 0.518 |
| 3.597 | 0.519 |
| 3.598 | 0.519 |
| 3.599 | 0.52 |
| 3.6 | 0.52 |
| 3.601 | 0.521 |
| 3.602 | 0.521 |
| 3.603 | 0.522 |
| 3.604 | 0.522 |
| 3.605 | 0.523 |
| 3.606 | 0.523 |
| 3.607 | 0.524 |
| 3.608 | 0.524 |
| 3.609 | 0.525 |
| 3.61 | 0.525 |
| 3.611 | 0.526 |
| 3.612 | 0.526 |
| 3.613 | 0.527 |
| 3.614 | 0.527 |
| 3.615 | 0.528 |
| 3.616 | 0.528 |
| 3.617 | 0.529 |
| 3.618 | 0.529 |
| 3.619 | 0.53 |
| 3.62 | 0.53 |
| 3.621 | 0.531 |
| 3.622 | 0.531 |
| 3.623 | 0.532 |
| 3.624 | 0.532 |
| 3.625 | 0.532 |
| 3.626 | 0.533 |
| 3.627 | 0.533 |
| 3.628 | 0.534 |
| 3.629 | 0.534 |
| 3.63 | 0.535 |
| 3.631 | 0.535 |
| 3.632 | 0.536 |
| 3.633 | 0.536 |
| 3.634 | 0.537 |
| 3.635 | 0.537 |
| 3.636 | 0.538 |
| 3.637 | 0.538 |
| 3.638 | 0.539 |
| 3.639 | 0.539 |
| 3.64 | 0.54 |
| 3.641 | 0.54 |
| 3.642 | 0.541 |
| 3.643 | 0.541 |
| 3.644 | 0.542 |
| 3.645 | 0.542 |
| 3.646 | 0.543 |
| 3.647 | 0.543 |
| 3.648 | 0.544 |
| 3.649 | 0.544 |
| 3.65 | 0.545 |
| 3.651 | 0.545 |
| 3.652 | 0.546 |
| 3.653 | 0.546 |
| 3.654 | 0.547 |
| 3.655 | 0.547 |
| 3.656 | 0.548 |
| 3.657 | 0.548 |
| 3.658 | 0.549 |
| 3.659 | 0.549 |
| 3.66 | 0.55 |
| 3.661 | 0.55 |
| 3.662 | 0.551 |
| 3.663 | 0.551 |
| 3.664 | 0.552 |
| 3.665 | 0.552 |
| 3.666 | 0.553 |
| 3.667 | 0.553 |
| 3.668 | 0.554 |
| 3.669 | 0.554 |
| 3.67 | 0.555 |
| 3.671 | 0.555 |
| 3.672 | 0.556 |
| 3.673 | 0.556 |
| 3.674 | 0.556 |
| 3.675 | 0.557 |
| 3.676 | 0.557 |
| 3.677 | 0.558 |
| 3.678 | 0.558 |
| 3.679 | 0.559 |
| 3.68 | 0.559 |
| 3.681 | 0.56 |
| 3.682 | 0.56 |
| 3.683 | 0.561 |
| 3.684 | 0.561 |
| 3.685 | 0.562 |
| 3.686 | 0.562 |
| 3.687 | 0.563 |
| 3.688 | 0.563 |
| 3.689 | 0.564 |
| 3.69 | 0.564 |
| 3.691 | 0.565 |
| 3.692 | 0.565 |
| 3.693 | 0.566 |
| 3.694 | 0.566 |
| 3.695 | 0.567 |
| 3.696 | 0.567 |
| 3.697 | 0.568 |
| 3.698 | 0.568 |
| 3.699 | 0.569 |
| 3.7 | 0.569 |
| 3.701 | 0.57 |
| 3.702 | 0.57 |
| 3.703 | 0.571 |
| 3.704 | 0.571 |
| 3.705 | 0.572 |
| 3.706 | 0.572 |
| 3.707 | 0.573 |
| 3.708 | 0.573 |
| 3.709 | 0.574 |
| 3.71 | 0.574 |
| 3.711 | 0.575 |
| 3.712 | 0.575 |
| 3.713 | 0.576 |
| 3.714 | 0.576 |
| 3.715 | 0.577 |
| 3.716 | 0.577 |
| 3.717 | 0.578 |
| 3.718 | 0.578 |
| 3.719 | 0.579 |
| 3.72 | 0.579 |
| 3.721 | 0.58 |
| 3.722 | 0.58 |
| 3.723 | 0.581 |
| 3.724 | 0.581 |
| 3.725 | 0.582 |
| 3.726 | 0.582 |
| 3.727 | 0.583 |
| 3.728 | 0.583 |
| 3.729 | 0.584 |
| 3.73 | 0.584 |
| 3.731 | 0.585 |
| 3.732 | 0.585 |
| 3.733 | 0.586 |
| 3.734 | 0.586 |
| 3.735 | 0.587 |
| 3.736 | 0.587 |
| 3.737 | 0.588 |
| 3.738 | 0.588 |
| 3.739 | 0.589 |
| 3.74 | 0.589 |
| 3.741 | 0.59 |
| 3.742 | 0.59 |
| 3.743 | 0.591 |
| 3.744 | 0.591 |
| 3.745 | 0.592 |
| 3.746 | 0.592 |
| 3.747 | 0.593 |
| 3.748 | 0.593 |
| 3.749 | 0.594 |
| 3.75 | 0.594 |
| 3.751 | 0.595 |
| 3.752 | 0.595 |
| 3.753 | 0.596 |
| 3.754 | 0.596 |
| 3.755 | 0.597 |
| 3.756 | 0.597 |
| 3.757 | 0.597 |
| 3.758 | 0.598 |
| 3.759 | 0.598 |
| 3.76 | 0.599 |
| 3.761 | 0.599 |
| 3.762 | 0.6 |
| 3.763 | 0.6 |
| 3.764 | 0.601 |
| 3.765 | 0.601 |
| 3.766 | 0.602 |
| 3.767 | 0.602 |
| 3.768 | 0.603 |
| 3.769 | 0.603 |
| 3.77 | 0.604 |
| 3.771 | 0.604 |
| 3.772 | 0.605 |
| 3.773 | 0.605 |
| 3.774 | 0.606 |
| 3.775 | 0.606 |
| 3.776 | 0.607 |
| 3.777 | 0.607 |
| 3.778 | 0.608 |
| 3.779 | 0.608 |
| 3.78 | 0.609 |
| 3.781 | 0.609 |
| 3.782 | 0.61 |
| 3.783 | 0.61 |
| 3.784 | 0.611 |
| 3.785 | 0.611 |
| 3.786 | 0.612 |
| 3.787 | 0.612 |
| 3.788 | 0.613 |
| 3.789 | 0.613 |
| 3.79 | 0.614 |
| 3.791 | 0.614 |
| 3.792 | 0.615 |
| 3.793 | 0.615 |
| 3.794 | 0.616 |
| 3.795 | 0.616 |
| 3.796 | 0.617 |
| 3.797 | 0.617 |
| 3.798 | 0.618 |
| 3.799 | 0.618 |
| 3.8 | 0.619 |
| 3.801 | 0.619 |
| 3.802 | 0.62 |
| 3.803 | 0.62 |
| 3.804 | 0.621 |
| 3.805 | 0.621 |
| 3.806 | 0.622 |
| 3.807 | 0.622 |
| 3.808 | 0.623 |
| 3.809 | 0.623 |
| 3.81 | 0.624 |
| 3.811 | 0.624 |
| 3.812 | 0.625 |
| 3.813 | 0.625 |
| 3.814 | 0.626 |
| 3.815 | 0.626 |
| 3.816 | 0.627 |
| 3.817 | 0.627 |
| 3.818 | 0.628 |
| 3.819 | 0.628 |
| 3.82 | 0.629 |
| 3.821 | 0.629 |
| 3.822 | 0.63 |
| 3.823 | 0.63 |
| 3.824 | 0.631 |
| 3.825 | 0.631 |
| 3.826 | 0.632 |
| 3.827 | 0.632 |
| 3.828 | 0.633 |
| 3.829 | 0.633 |
| 3.83 | 0.634 |
| 3.831 | 0.634 |
| 3.832 | 0.635 |
| 3.833 | 0.635 |
| 3.834 | 0.636 |
| 3.835 | 0.636 |
| 3.836 | 0.637 |
| 3.837 | 0.637 |
| 3.838 | 0.638 |
| 3.839 | 0.638 |
| 3.84 | 0.639 |
| 3.841 | 0.639 |
| 3.842 | 0.64 |
| 3.843 | 0.64 |
| 3.844 | 0.641 |
| 3.845 | 0.641 |
| 3.846 | 0.642 |
| 3.847 | 0.642 |
| 3.848 | 0.643 |
| 3.849 | 0.643 |
| 3.85 | 0.643 |
| 3.851 | 0.644 |
| 3.852 | 0.644 |
| 3.853 | 0.645 |
| 3.854 | 0.645 |
| 3.855 | 0.646 |
| 3.856 | 0.646 |
| 3.857 | 0.647 |
| 3.858 | 0.647 |
| 3.859 | 0.648 |
| 3.86 | 0.648 |
| 3.861 | 0.649 |
| 3.862 | 0.649 |
| 3.863 | 0.65 |
| 3.864 | 0.65 |
| 3.865 | 0.651 |
| 3.866 | 0.651 |
| 3.867 | 0.652 |
| 3.868 | 0.652 |
| 3.869 | 0.653 |
| 3.87 | 0.653 |
| 3.871 | 0.654 |
| 3.872 | 0.654 |
| 3.873 | 0.655 |
| 3.874 | 0.655 |
| 3.875 | 0.656 |
| 3.876 | 0.656 |
| 3.877 | 0.657 |
| 3.878 | 0.657 |
| 3.879 | 0.658 |
| 3.88 | 0.658 |
| 3.881 | 0.659 |
| 3.882 | 0.659 |
| 3.883 | 0.66 |
| 3.884 | 0.66 |
| 3.885 | 0.661 |
| 3.886 | 0.661 |
| 3.887 | 0.662 |
| 3.888 | 0.662 |
| 3.889 | 0.663 |
| 3.89 | 0.663 |
| 3.891 | 0.664 |
| 3.892 | 0.664 |
| 3.893 | 0.665 |
| 3.894 | 0.665 |
| 3.895 | 0.666 |
| 3.896 | 0.666 |
| 3.897 | 0.667 |
| 3.898 | 0.667 |
| 3.899 | 0.668 |
| 3.9 | 0.668 |
| 3.901 | 0.669 |
| 3.902 | 0.669 |
| 3.903 | 0.67 |
| 3.904 | 0.67 |
| 3.905 | 0.671 |
| 3.906 | 0.671 |
| 3.907 | 0.672 |
| 3.908 | 0.672 |
| 3.909 | 0.672 |
| 3.91 | 0.673 |
| 3.911 | 0.673 |
| 3.912 | 0.674 |
| 3.913 | 0.674 |
| 3.914 | 0.675 |
| 3.915 | 0.675 |
| 3.916 | 0.676 |
| 3.917 | 0.676 |
| 3.918 | 0.677 |
| 3.919 | 0.677 |
| 3.92 | 0.678 |
| 3.921 | 0.678 |
| 3.922 | 0.679 |
| 3.923 | 0.679 |
| 3.924 | 0.68 |
| 3.925 | 0.68 |
| 3.926 | 0.681 |
| 3.927 | 0.681 |
| 3.928 | 0.682 |
| 3.929 | 0.682 |
| 3.93 | 0.683 |
| 3.931 | 0.683 |
| 3.932 | 0.684 |
| 3.933 | 0.684 |
| 3.934 | 0.685 |
| 3.935 | 0.685 |
| 3.936 | 0.686 |
| 3.937 | 0.686 |
| 3.938 | 0.687 |
| 3.939 | 0.687 |
| 3.94 | 0.688 |
| 3.941 | 0.688 |
| 3.942 | 0.689 |
| 3.943 | 0.689 |
| 3.944 | 0.69 |
| 3.945 | 0.69 |
| 3.946 | 0.691 |
| 3.947 | 0.691 |
| 3.948 | 0.691 |
| 3.949 | 0.692 |
| 3.95 | 0.692 |
| 3.951 | 0.693 |
| 3.952 | 0.693 |
| 3.953 | 0.694 |
| 3.954 | 0.694 |
| 3.955 | 0.695 |
| 3.956 | 0.695 |
| 3.957 | 0.696 |
| 3.958 | 0.696 |
| 3.959 | 0.697 |
| 3.96 | 0.697 |
| 3.961 | 0.698 |
| 3.962 | 0.698 |
| 3.963 | 0.699 |
| 3.964 | 0.699 |
| 3.965 | 0.7 |
| 3.966 | 0.7 |
| 3.967 | 0.701 |
| 3.968 | 0.701 |
| 3.969 | 0.702 |
| 3.97 | 0.702 |
| 3.971 | 0.703 |
| 3.972 | 0.703 |
| 3.973 | 0.704 |
| 3.974 | 0.704 |
| 3.975 | 0.705 |
| 3.976 | 0.705 |
| 3.977 | 0.706 |
| 3.978 | 0.706 |
| 3.979 | 0.706 |
| 3.98 | 0.707 |
| 3.981 | 0.707 |
| 3.982 | 0.708 |
| 3.983 | 0.708 |
| 3.984 | 0.709 |
| 3.985 | 0.709 |
| 3.986 | 0.71 |
| 3.987 | 0.71 |
| 3.988 | 0.711 |
| 3.989 | 0.711 |
| 3.99 | 0.712 |
| 3.991 | 0.712 |
| 3.992 | 0.713 |
| 3.993 | 0.713 |
| 3.994 | 0.714 |
| 3.995 | 0.714 |
| 3.996 | 0.715 |
| 3.997 | 0.715 |
| 3.998 | 0.716 |
| 3.999 | 0.716 |
| 4.0 | 0.717 |
| 4.001 | 0.717 |
| 4.002 | 0.717 |
| 4.003 | 0.718 |
| 4.004 | 0.718 |
| 4.005 | 0.719 |
| 4.006 | 0.719 |
| 4.007 | 0.72 |
| 4.008 | 0.72 |
| 4.009 | 0.721 |
| 4.01 | 0.721 |
| 4.011 | 0.722 |
| 4.012 | 0.722 |
| 4.013 | 0.723 |
| 4.014 | 0.723 |
| 4.015 | 0.724 |
| 4.016 | 0.724 |
| 4.017 | 0.725 |
| 4.018 | 0.725 |
| 4.019 | 0.726 |
| 4.02 | 0.726 |
| 4.021 | 0.727 |
| 4.022 | 0.727 |
| 4.023 | 0.727 |
| 4.024 | 0.728 |
| 4.025 | 0.728 |
| 4.026 | 0.729 |
| 4.027 | 0.729 |
| 4.028 | 0.73 |
| 4.029 | 0.73 |
| 4.03 | 0.731 |
| 4.031 | 0.731 |
| 4.032 | 0.732 |
| 4.033 | 0.732 |
| 4.034 | 0.733 |
| 4.035 | 0.733 |
| 4.036 | 0.734 |
| 4.037 | 0.734 |
| 4.038 | 0.735 |
| 4.039 | 0.735 |
| 4.04 | 0.736 |
| 4.041 | 0.736 |
| 4.042 | 0.736 |
| 4.043 | 0.737 |
| 4.044 | 0.737 |
| 4.045 | 0.738 |
| 4.046 | 0.738 |
| 4.047 | 0.739 |
| 4.048 | 0.739 |
| 4.049 | 0.74 |
| 4.05 | 0.74 |
| 4.051 | 0.741 |
| 4.052 | 0.741 |
| 4.053 | 0.742 |
| 4.054 | 0.742 |
| 4.055 | 0.743 |
| 4.056 | 0.743 |
| 4.057 | 0.743 |
| 4.058 | 0.744 |
| 4.059 | 0.744 |
| 4.06 | 0.745 |
| 4.061 | 0.745 |
| 4.062 | 0.746 |
| 4.063 | 0.746 |
| 4.064 | 0.747 |
| 4.065 | 0.747 |
| 4.066 | 0.748 |
| 4.067 | 0.748 |
| 4.068 | 0.749 |
| 4.069 | 0.749 |
| 4.07 | 0.75 |
| 4.071 | 0.75 |
| 4.072 | 0.75 |
| 4.073 | 0.751 |
| 4.074 | 0.751 |
| 4.075 | 0.752 |
| 4.076 | 0.752 |
| 4.077 | 0.753 |
| 4.078 | 0.753 |
| 4.079 | 0.754 |
| 4.08 | 0.754 |
| 4.081 | 0.755 |
| 4.082 | 0.755 |
| 4.083 | 0.756 |
| 4.084 | 0.756 |
| 4.085 | 0.756 |
| 4.086 | 0.757 |
| 4.087 | 0.757 |
| 4.088 | 0.758 |
| 4.089 | 0.758 |
| 4.09 | 0.759 |
| 4.091 | 0.759 |
| 4.092 | 0.76 |
| 4.093 | 0.76 |
| 4.094 | 0.761 |
| 4.095 | 0.761 |
| 4.096 | 0.762 |
| 4.097 | 0.762 |
| 4.098 | 0.762 |
| 4.099 | 0.763 |
| 4.1 | 0.763 |
| 4.101 | 0.764 |
| 4.102 | 0.764 |
| 4.103 | 0.765 |
| 4.104 | 0.765 |
| 4.105 | 0.766 |
| 4.106 | 0.766 |
| 4.107 | 0.767 |
| 4.108 | 0.767 |
| 4.109 | 0.767 |
| 4.11 | 0.768 |
| 4.111 | 0.768 |
| 4.112 | 0.769 |
| 4.113 | 0.769 |
| 4.114 | 0.77 |
| 4.115 | 0.77 |
| 4.116 | 0.771 |
| 4.117 | 0.771 |
| 4.118 | 0.772 |
| 4.119 | 0.772 |
| 4.12 | 0.772 |
| 4.121 | 0.773 |
| 4.122 | 0.773 |
| 4.123 | 0.774 |
| 4.124 | 0.774 |
| 4.125 | 0.775 |
| 4.126 | 0.775 |
| 4.127 | 0.776 |
| 4.128 | 0.776 |
| 4.129 | 0.777 |
| 4.13 | 0.777 |
| 4.131 | 0.777 |
| 4.132 | 0.778 |
| 4.133 | 0.778 |
| 4.134 | 0.779 |
| 4.135 | 0.779 |
| 4.136 | 0.78 |
| 4.137 | 0.78 |
| 4.138 | 0.781 |
| 4.139 | 0.781 |
| 4.14 | 0.782 |
| 4.141 | 0.782 |
| 4.142 | 0.782 |
| 4.143 | 0.783 |
| 4.144 | 0.783 |
| 4.145 | 0.784 |
| 4.146 | 0.784 |
| 4.147 | 0.785 |
| 4.148 | 0.785 |
| 4.149 | 0.786 |
| 4.15 | 0.786 |
| 4.151 | 0.786 |
| 4.152 | 0.787 |
| 4.153 | 0.787 |
| 4.154 | 0.788 |
| 4.155 | 0.788 |
| 4.156 | 0.789 |
| 4.157 | 0.789 |
| 4.158 | 0.79 |
| 4.159 | 0.79 |
| 4.16 | 0.79 |
| 4.161 | 0.791 |
| 4.162 | 0.791 |
| 4.163 | 0.792 |
| 4.164 | 0.792 |
| 4.165 | 0.793 |
| 4.166 | 0.793 |
| 4.167 | 0.794 |
| 4.168 | 0.794 |
| 4.169 | 0.794 |
| 4.17 | 0.795 |
| 4.171 | 0.795 |
| 4.172 | 0.796 |
| 4.173 | 0.796 |
| 4.174 | 0.797 |
| 4.175 | 0.797 |
| 4.176 | 0.797 |
| 4.177 | 0.798 |
| 4.178 | 0.798 |
| 4.179 | 0.799 |
| 4.18 | 0.799 |
| 4.181 | 0.8 |
| 4.182 | 0.8 |
| 4.183 | 0.801 |
| 4.184 | 0.801 |
| 4.185 | 0.801 |
| 4.186 | 0.802 |
| 4.187 | 0.802 |
| 4.188 | 0.803 |
| 4.189 | 0.803 |
| 4.19 | 0.804 |
| 4.191 | 0.804 |
| 4.192 | 0.804 |
| 4.193 | 0.805 |
| 4.194 | 0.805 |
| 4.195 | 0.806 |
| 4.196 | 0.806 |
| 4.197 | 0.807 |
| 4.198 | 0.807 |
| 4.199 | 0.807 |
| 4.2 | 0.808 |
| 4.201 | 0.808 |
| 4.202 | 0.809 |
| 4.203 | 0.809 |
| 4.204 | 0.81 |
| 4.205 | 0.81 |
| 4.206 | 0.81 |
| 4.207 | 0.811 |
| 4.208 | 0.811 |
| 4.209 | 0.812 |
| 4.21 | 0.812 |
| 4.211 | 0.813 |
| 4.212 | 0.813 |
| 4.213 | 0.813 |
| 4.214 | 0.814 |
| 4.215 | 0.814 |
| 4.216 | 0.815 |
| 4.217 | 0.815 |
| 4.218 | 0.816 |
| 4.219 | 0.816 |
| 4.22 | 0.816 |
| 4.221 | 0.817 |
| 4.222 | 0.817 |
| 4.223 | 0.818 |
| 4.224 | 0.818 |
| 4.225 | 0.819 |
| 4.226 | 0.819 |
| 4.227 | 0.819 |
| 4.228 | 0.82 |
| 4.229 | 0.82 |
| 4.23 | 0.821 |
| 4.231 | 0.821 |
| 4.232 | 0.822 |
| 4.233 | 0.822 |
| 4.234 | 0.822 |
| 4.235 | 0.823 |
| 4.236 | 0.823 |
| 4.237 | 0.824 |
| 4.238 | 0.824 |
| 4.239 | 0.824 |
| 4.24 | 0.825 |
| 4.241 | 0.825 |
| 4.242 | 0.826 |
| 4.243 | 0.826 |
| 4.244 | 0.827 |
| 4.245 | 0.827 |
| 4.246 | 0.827 |
| 4.247 | 0.828 |
| 4.248 | 0.828 |
| 4.249 | 0.829 |
| 4.25 | 0.829 |
| 4.251 | 0.829 |
| 4.252 | 0.83 |
| 4.253 | 0.83 |
| 4.254 | 0.831 |
| 4.255 | 0.831 |
| 4.256 | 0.832 |
| 4.257 | 0.832 |
| 4.258 | 0.832 |
| 4.259 | 0.833 |
| 4.26 | 0.833 |
| 4.261 | 0.834 |
| 4.262 | 0.834 |
| 4.263 | 0.834 |
| 4.264 | 0.835 |
| 4.265 | 0.835 |
| 4.266 | 0.836 |
| 4.267 | 0.836 |
| 4.268 | 0.836 |
| 4.269 | 0.837 |
| 4.27 | 0.837 |
| 4.271 | 0.838 |
| 4.272 | 0.838 |
| 4.273 | 0.838 |
| 4.274 | 0.839 |
| 4.275 | 0.839 |
| 4.276 | 0.84 |
| 4.277 | 0.84 |
| 4.278 | 0.84 |
| 4.279 | 0.841 |
| 4.28 | 0.841 |
| 4.281 | 0.842 |
| 4.282 | 0.842 |
| 4.283 | 0.843 |
| 4.284 | 0.843 |
| 4.285 | 0.843 |
| 4.286 | 0.844 |
| 4.287 | 0.844 |
| 4.288 | 0.845 |
| 4.289 | 0.845 |
| 4.29 | 0.845 |
| 4.291 | 0.846 |
| 4.292 | 0.846 |
| 4.293 | 0.847 |
| 4.294 | 0.847 |
| 4.295 | 0.847 |
| 4.296 | 0.848 |
| 4.297 | 0.848 |
| 4.298 | 0.849 |
| 4.299 | 0.849 |
| 4.3 | 0.849 |
| 4.301 | 0.85 |
| 4.302 | 0.85 |
| 4.303 | 0.85 |
| 4.304 | 0.851 |
| 4.305 | 0.851 |
| 4.306 | 0.852 |
| 4.307 | 0.852 |
| 4.308 | 0.852 |
| 4.309 | 0.853 |
| 4.31 | 0.853 |
| 4.311 | 0.854 |
| 4.312 | 0.854 |
| 4.313 | 0.854 |
| 4.314 | 0.855 |
| 4.315 | 0.855 |
| 4.316 | 0.856 |
| 4.317 | 0.856 |
| 4.318 | 0.856 |
| 4.319 | 0.857 |
| 4.32 | 0.857 |
| 4.321 | 0.858 |
| 4.322 | 0.858 |
| 4.323 | 0.858 |
| 4.324 | 0.859 |
| 4.325 | 0.859 |
| 4.326 | 0.859 |
| 4.327 | 0.86 |
| 4.328 | 0.86 |
| 4.329 | 0.861 |
| 4.33 | 0.861 |
| 4.331 | 0.861 |
| 4.332 | 0.862 |
| 4.333 | 0.862 |
| 4.334 | 0.863 |
| 4.335 | 0.863 |
| 4.336 | 0.863 |
| 4.337 | 0.864 |
| 4.338 | 0.864 |
| 4.339 | 0.864 |
| 4.34 | 0.865 |
| 4.341 | 0.865 |
| 4.342 | 0.866 |
| 4.343 | 0.866 |
| 4.344 | 0.866 |
| 4.345 | 0.867 |
| 4.346 | 0.867 |
| 4.347 | 0.868 |
| 4.348 | 0.868 |
| 4.349 | 0.868 |
| 4.35 | 0.869 |
| 4.351 | 0.869 |
| 4.352 | 0.869 |
| 4.353 | 0.87 |
| 4.354 | 0.87 |
| 4.355 | 0.871 |
| 4.356 | 0.871 |
| 4.357 | 0.871 |
| 4.358 | 0.872 |
| 4.359 | 0.872 |
| 4.36 | 0.872 |
| 4.361 | 0.873 |
| 4.362 | 0.873 |
| 4.363 | 0.873 |
| 4.364 | 0.874 |
| 4.365 | 0.874 |
| 4.366 | 0.875 |
| 4.367 | 0.875 |
| 4.368 | 0.875 |
| 4.369 | 0.876 |
| 4.37 | 0.876 |
| 4.371 | 0.876 |
| 4.372 | 0.877 |
| 4.373 | 0.877 |
| 4.374 | 0.878 |
| 4.375 | 0.878 |
| 4.376 | 0.878 |
| 4.377 | 0.879 |
| 4.378 | 0.879 |
| 4.379 | 0.879 |
| 4.38 | 0.88 |
| 4.381 | 0.88 |
| 4.382 | 0.88 |
| 4.383 | 0.881 |
| 4.384 | 0.881 |
| 4.385 | 0.882 |
| 4.386 | 0.882 |
| 4.387 | 0.882 |
| 4.388 | 0.883 |
| 4.389 | 0.883 |
| 4.39 | 0.883 |
| 4.391 | 0.884 |
| 4.392 | 0.884 |
| 4.393 | 0.884 |
| 4.394 | 0.885 |
| 4.395 | 0.885 |
| 4.396 | 0.885 |
| 4.397 | 0.886 |
| 4.398 | 0.886 |
| 4.399 | 0.887 |
| 4.4 | 0.887 |
| 4.401 | 0.887 |
| 4.402 | 0.888 |
| 4.403 | 0.888 |
| 4.404 | 0.888 |
| 4.405 | 0.889 |
| 4.406 | 0.889 |
| 4.407 | 0.889 |
| 4.408 | 0.89 |
| 4.409 | 0.89 |
| 4.41 | 0.89 |
| 4.411 | 0.891 |
| 4.412 | 0.891 |
| 4.413 | 0.891 |
| 4.414 | 0.892 |
| 4.415 | 0.892 |
| 4.416 | 0.893 |
| 4.417 | 0.893 |
| 4.418 | 0.893 |
| 4.419 | 0.894 |
| 4.42 | 0.894 |
| 4.421 | 0.894 |
| 4.422 | 0.895 |
| 4.423 | 0.895 |
| 4.424 | 0.895 |
| 4.425 | 0.896 |
| 4.426 | 0.896 |
| 4.427 | 0.896 |
| 4.428 | 0.897 |
| 4.429 | 0.897 |
| 4.43 | 0.897 |
| 4.431 | 0.898 |
| 4.432 | 0.898 |
| 4.433 | 0.898 |
| 4.434 | 0.899 |
| 4.435 | 0.899 |
| 4.436 | 0.899 |
| 4.437 | 0.9 |
| 4.438 | 0.9 |
| 4.439 | 0.9 |
| 4.44 | 0.901 |
| 4.441 | 0.901 |
| 4.442 | 0.901 |
| 4.443 | 0.902 |
| 4.444 | 0.902 |
| 4.445 | 0.902 |
| 4.446 | 0.903 |
| 4.447 | 0.903 |
| 4.448 | 0.903 |
| 4.449 | 0.904 |
| 4.45 | 0.904 |
| 4.451 | 0.904 |
| 4.452 | 0.905 |
| 4.453 | 0.905 |
| 4.454 | 0.905 |
| 4.455 | 0.906 |
| 4.456 | 0.906 |
| 4.457 | 0.906 |
| 4.458 | 0.907 |
| 4.459 | 0.907 |
| 4.46 | 0.907 |
| 4.461 | 0.908 |
| 4.462 | 0.908 |
| 4.463 | 0.908 |
| 4.464 | 0.909 |
| 4.465 | 0.909 |
| 4.466 | 0.909 |
| 4.467 | 0.91 |
| 4.468 | 0.91 |
| 4.469 | 0.91 |
| 4.47 | 0.911 |
| 4.471 | 0.911 |
| 4.472 | 0.911 |
| 4.473 | 0.912 |
| 4.474 | 0.912 |
| 4.475 | 0.912 |
| 4.476 | 0.913 |
| 4.477 | 0.913 |
| 4.478 | 0.913 |
| 4.479 | 0.913 |
| 4.48 | 0.914 |
| 4.481 | 0.914 |
| 4.482 | 0.914 |
| 4.483 | 0.915 |
| 4.484 | 0.915 |
| 4.485 | 0.915 |
| 4.486 | 0.916 |
| 4.487 | 0.916 |
| 4.488 | 0.916 |
| 4.489 | 0.917 |
| 4.49 | 0.917 |
| 4.491 | 0.917 |
| 4.492 | 0.918 |
| 4.493 | 0.918 |
| 4.494 | 0.918 |
| 4.495 | 0.919 |
| 4.496 | 0.919 |
| 4.497 | 0.919 |
| 4.498 | 0.919 |
| 4.499 | 0.92 |
| 4.5 | 0.92 |
| 4.501 | 0.92 |
| 4.502 | 0.921 |
| 4.503 | 0.921 |
| 4.504 | 0.921 |
| 4.505 | 0.922 |
| 4.506 | 0.922 |
| 4.507 | 0.922 |
| 4.508 | 0.922 |
| 4.509 | 0.923 |
| 4.51 | 0.923 |
| 4.511 | 0.923 |
| 4.512 | 0.924 |
| 4.513 | 0.924 |
| 4.514 | 0.924 |
| 4.515 | 0.925 |
| 4.516 | 0.925 |
| 4.517 | 0.925 |
| 4.518 | 0.925 |
| 4.519 | 0.926 |
| 4.52 | 0.926 |
| 4.521 | 0.926 |
| 4.522 | 0.927 |
| 4.523 | 0.927 |
| 4.524 | 0.927 |
| 4.525 | 0.928 |
| 4.526 | 0.928 |
| 4.527 | 0.928 |
| 4.528 | 0.928 |
| 4.529 | 0.929 |
| 4.53 | 0.929 |
| 4.531 | 0.929 |
| 4.532 | 0.93 |
| 4.533 | 0.93 |
| 4.534 | 0.93 |
| 4.535 | 0.93 |
| 4.536 | 0.931 |
| 4.537 | 0.931 |
| 4.538 | 0.931 |
| 4.539 | 0.932 |
| 4.54 | 0.932 |
| 4.541 | 0.932 |
| 4.542 | 0.932 |
| 4.543 | 0.933 |
| 4.544 | 0.933 |
| 4.545 | 0.933 |
| 4.546 | 0.934 |
| 4.547 | 0.934 |
| 4.548 | 0.934 |
| 4.549 | 0.934 |
| 4.55 | 0.935 |
| 4.551 | 0.935 |
| 4.552 | 0.935 |
| 4.553 | 0.936 |
| 4.554 | 0.936 |
| 4.555 | 0.936 |
| 4.556 | 0.936 |
| 4.557 | 0.937 |
| 4.558 | 0.937 |
| 4.559 | 0.937 |
| 4.56 | 0.938 |
| 4.561 | 0.938 |
| 4.562 | 0.938 |
| 4.563 | 0.938 |
| 4.564 | 0.939 |
| 4.565 | 0.939 |
| 4.566 | 0.939 |
| 4.567 | 0.939 |
| 4.568 | 0.94 |
| 4.569 | 0.94 |
| 4.57 | 0.94 |
| 4.571 | 0.94 |
| 4.572 | 0.941 |
| 4.573 | 0.941 |
| 4.574 | 0.941 |
| 4.575 | 0.942 |
| 4.576 | 0.942 |
| 4.577 | 0.942 |
| 4.578 | 0.942 |
| 4.579 | 0.943 |
| 4.58 | 0.943 |
| 4.581 | 0.943 |
| 4.582 | 0.943 |
| 4.583 | 0.944 |
| 4.584 | 0.944 |
| 4.585 | 0.944 |
| 4.586 | 0.944 |
| 4.587 | 0.945 |
| 4.588 | 0.945 |
| 4.589 | 0.945 |
| 4.59 | 0.946 |
| 4.591 | 0.946 |
| 4.592 | 0.946 |
| 4.593 | 0.946 |
| 4.594 | 0.947 |
| 4.595 | 0.947 |
| 4.596 | 0.947 |
| 4.597 | 0.947 |
| 4.598 | 0.948 |
| 4.599 | 0.948 |
| 4.6 | 0.948 |
| 4.601 | 0.948 |
| 4.602 | 0.949 |
| 4.603 | 0.949 |
| 4.604 | 0.949 |
| 4.605 | 0.949 |
| 4.606 | 0.95 |
| 4.607 | 0.95 |
| 4.608 | 0.95 |
| 4.609 | 0.95 |
| 4.61 | 0.951 |
| 4.611 | 0.951 |
| 4.612 | 0.951 |
| 4.613 | 0.951 |
| 4.614 | 0.952 |
| 4.615 | 0.952 |
| 4.616 | 0.952 |
| 4.617 | 0.952 |
| 4.618 | 0.953 |
| 4.619 | 0.953 |
| 4.62 | 0.953 |
| 4.621 | 0.953 |
| 4.622 | 0.953 |
| 4.623 | 0.954 |
| 4.624 | 0.954 |
| 4.625 | 0.954 |
| 4.626 | 0.954 |
| 4.627 | 0.955 |
| 4.628 | 0.955 |
| 4.628999999999999 | 0.955 |
| 4.63 | 0.955 |
| 4.631 | 0.956 |
| 4.632 | 0.956 |
| 4.633 | 0.956 |
| 4.634 | 0.956 |
| 4.635 | 0.957 |
| 4.636 | 0.957 |
| 4.636999999999999 | 0.957 |
| 4.638 | 0.957 |
| 4.639 | 0.957 |
| 4.64 | 0.958 |
| 4.641 | 0.958 |
| 4.642 | 0.958 |
| 4.643 | 0.958 |
| 4.644 | 0.959 |
| 4.644999999999999 | 0.959 |
| 4.646 | 0.959 |
| 4.647 | 0.959 |
| 4.648 | 0.96 |
| 4.649 | 0.96 |
| 4.65 | 0.96 |
| 4.651 | 0.96 |
| 4.652 | 0.96 |
| 4.652999999999999 | 0.961 |
| 4.654 | 0.961 |
| 4.655 | 0.961 |
| 4.656 | 0.961 |
| 4.657 | 0.962 |
| 4.658 | 0.962 |
| 4.659 | 0.962 |
| 4.66 | 0.962 |
| 4.660999999999999 | 0.962 |
| 4.662 | 0.963 |
| 4.663 | 0.963 |
| 4.664 | 0.963 |
| 4.665 | 0.963 |
| 4.666 | 0.963 |
| 4.667 | 0.964 |
| 4.668 | 0.964 |
| 4.668999999999999 | 0.964 |
| 4.67 | 0.964 |
| 4.671 | 0.965 |
| 4.672 | 0.965 |
| 4.673 | 0.965 |
| 4.674 | 0.965 |
| 4.675 | 0.965 |
| 4.676 | 0.966 |
| 4.677 | 0.966 |
| 4.678 | 0.966 |
| 4.679 | 0.966 |
| 4.68 | 0.966 |
| 4.681 | 0.967 |
| 4.682 | 0.967 |
| 4.683 | 0.967 |
| 4.684 | 0.967 |
| 4.685 | 0.967 |
| 4.686 | 0.968 |
| 4.687 | 0.968 |
| 4.688 | 0.968 |
| 4.689 | 0.968 |
| 4.69 | 0.968 |
| 4.691 | 0.969 |
| 4.692 | 0.969 |
| 4.693 | 0.969 |
| 4.694 | 0.969 |
| 4.695 | 0.969 |
| 4.696 | 0.97 |
| 4.697 | 0.97 |
| 4.698 | 0.97 |
| 4.699 | 0.97 |
| 4.7 | 0.97 |
| 4.701 | 0.971 |
| 4.702 | 0.971 |
| 4.703 | 0.971 |
| 4.704 | 0.971 |
| 4.705 | 0.971 |
| 4.706 | 0.972 |
| 4.707 | 0.972 |
| 4.708 | 0.972 |
| 4.709 | 0.972 |
| 4.71 | 0.972 |
| 4.711 | 0.973 |
| 4.712 | 0.973 |
| 4.713 | 0.973 |
| 4.714 | 0.973 |
| 4.715 | 0.973 |
| 4.716 | 0.973 |
| 4.717 | 0.974 |
| 4.718 | 0.974 |
| 4.719 | 0.974 |
| 4.72 | 0.974 |
| 4.721 | 0.974 |
| 4.722 | 0.975 |
| 4.723 | 0.975 |
| 4.724 | 0.975 |
| 4.725 | 0.975 |
| 4.726 | 0.975 |
| 4.727 | 0.975 |
| 4.728 | 0.976 |
| 4.729 | 0.976 |
| 4.73 | 0.976 |
| 4.731 | 0.976 |
| 4.732 | 0.976 |
| 4.733 | 0.977 |
| 4.734 | 0.977 |
| 4.735 | 0.977 |
| 4.736 | 0.977 |
| 4.737 | 0.977 |
| 4.738 | 0.977 |
| 4.739 | 0.978 |
| 4.74 | 0.978 |
| 4.741 | 0.978 |
| 4.742 | 0.978 |
| 4.743 | 0.978 |
| 4.744 | 0.978 |
| 4.745 | 0.979 |
| 4.746 | 0.979 |
| 4.747 | 0.979 |
| 4.748 | 0.979 |
| 4.749 | 0.979 |
| 4.75 | 0.979 |
| 4.751 | 0.98 |
| 4.752 | 0.98 |
| 4.753 | 0.98 |
| 4.753999999999999 | 0.98 |
| 4.755 | 0.98 |
| 4.756 | 0.98 |
| 4.757 | 0.981 |
| 4.758 | 0.981 |
| 4.759 | 0.981 |
| 4.76 | 0.981 |
| 4.761 | 0.981 |
| 4.761999999999999 | 0.981 |
| 4.763 | 0.981 |
| 4.764 | 0.982 |
| 4.765 | 0.982 |
| 4.766 | 0.982 |
| 4.767 | 0.982 |
| 4.768 | 0.982 |
| 4.769 | 0.982 |
| 4.769999999999999 | 0.983 |
| 4.771 | 0.983 |
| 4.772 | 0.983 |
| 4.773 | 0.983 |
| 4.774 | 0.983 |
| 4.775 | 0.983 |
| 4.776 | 0.983 |
| 4.777 | 0.984 |
| 4.778 | 0.984 |
| 4.779 | 0.984 |
| 4.78 | 0.984 |
| 4.781 | 0.984 |
| 4.782 | 0.984 |
| 4.783 | 0.984 |
| 4.784 | 0.985 |
| 4.785 | 0.985 |
| 4.786 | 0.985 |
| 4.787 | 0.985 |
| 4.788 | 0.985 |
| 4.789 | 0.985 |
| 4.79 | 0.985 |
| 4.791 | 0.986 |
| 4.792 | 0.986 |
| 4.793 | 0.986 |
| 4.794 | 0.986 |
| 4.795 | 0.986 |
| 4.796 | 0.986 |
| 4.797 | 0.986 |
| 4.798 | 0.986 |
| 4.799 | 0.987 |
| 4.8 | 0.987 |
| 4.801 | 0.987 |
| 4.802 | 0.987 |
| 4.803 | 0.987 |
| 4.804 | 0.987 |
| 4.805 | 0.987 |
| 4.806 | 0.988 |
| 4.807 | 0.988 |
| 4.808 | 0.988 |
| 4.809 | 0.988 |
| 4.81 | 0.988 |
| 4.811 | 0.988 |
| 4.812 | 0.988 |
| 4.813 | 0.988 |
| 4.814 | 0.989 |
| 4.815 | 0.989 |
| 4.816 | 0.989 |
| 4.817 | 0.989 |
| 4.818 | 0.989 |
| 4.819 | 0.989 |
| 4.82 | 0.989 |
| 4.821 | 0.989 |
| 4.822 | 0.989 |
| 4.823 | 0.99 |
| 4.824 | 0.99 |
| 4.825 | 0.99 |
| 4.826 | 0.99 |
| 4.827 | 0.99 |
| 4.828 | 0.99 |
| 4.829 | 0.99 |
| 4.83 | 0.99 |
| 4.831 | 0.991 |
| 4.832 | 0.991 |
| 4.833 | 0.991 |
| 4.834 | 0.991 |
| 4.835 | 0.991 |
| 4.836 | 0.991 |
| 4.837 | 0.991 |
| 4.838 | 0.991 |
| 4.839 | 0.991 |
| 4.84 | 0.992 |
| 4.841 | 0.992 |
| 4.842 | 0.992 |
| 4.843 | 0.992 |
| 4.844 | 0.992 |
| 4.845 | 0.992 |
| 4.846 | 0.992 |
| 4.847 | 0.992 |
| 4.848 | 0.992 |
| 4.849 | 0.992 |
| 4.85 | 0.993 |
| 4.851 | 0.993 |
| 4.852 | 0.993 |
| 4.853 | 0.993 |
| 4.854 | 0.993 |
| 4.855 | 0.993 |
| 4.856 | 0.993 |
| 4.857 | 0.993 |
| 4.858 | 0.993 |
| 4.859 | 0.993 |
| 4.86 | 0.993 |
| 4.861 | 0.994 |
| 4.862 | 0.994 |
| 4.863 | 0.994 |
| 4.864 | 0.994 |
| 4.865 | 0.994 |
| 4.866 | 0.994 |
| 4.867 | 0.994 |
| 4.868 | 0.994 |
| 4.869 | 0.994 |
| 4.87 | 0.994 |
| 4.871 | 0.994 |
| 4.872 | 0.995 |
| 4.873 | 0.995 |
| 4.874 | 0.995 |
| 4.875 | 0.995 |
| 4.876 | 0.995 |
| 4.877 | 0.995 |
| 4.878 | 0.995 |
| 4.879 | 0.995 |
| 4.88 | 0.995 |
| 4.881 | 0.995 |
| 4.882 | 0.995 |
| 4.883 | 0.995 |
| 4.884 | 0.996 |
| 4.885 | 0.996 |
| 4.886 | 0.996 |
| 4.887 | 0.996 |
| 4.888 | 0.996 |
| 4.889 | 0.996 |
| 4.89 | 0.996 |
| 4.891 | 0.996 |
| 4.892 | 0.996 |
| 4.893 | 0.996 |
| 4.894 | 0.996 |
| 4.895 | 0.996 |
| 4.896 | 0.996 |
| 4.897 | 0.996 |
| 4.898 | 0.997 |
| 4.899 | 0.997 |
| 4.9 | 0.997 |
| 4.901 | 0.997 |
| 4.902 | 0.997 |
| 4.903 | 0.997 |
| 4.904 | 0.997 |
| 4.905 | 0.997 |
| 4.906 | 0.997 |
| 4.907 | 0.997 |
| 4.908 | 0.997 |
| 4.909 | 0.997 |
| 4.91 | 0.997 |
| 4.911 | 0.997 |
| 4.912 | 0.997 |
| 4.913 | 0.997 |
| 4.914 | 0.998 |
| 4.915 | 0.998 |
| 4.916 | 0.998 |
| 4.917 | 0.998 |
| 4.918 | 0.998 |
| 4.919 | 0.998 |
| 4.92 | 0.998 |
| 4.921 | 0.998 |
| 4.922 | 0.998 |
| 4.923 | 0.998 |
| 4.924 | 0.998 |
| 4.925 | 0.998 |
| 4.926 | 0.998 |
| 4.927 | 0.998 |
| 4.928 | 0.998 |
| 4.929 | 0.998 |
| 4.93 | 0.998 |
| 4.931 | 0.998 |
| 4.932 | 0.998 |
| 4.933 | 0.999 |
| 4.934 | 0.999 |
| 4.935 | 0.999 |
| 4.936 | 0.999 |
| 4.937 | 0.999 |
| 4.938 | 0.999 |
| 4.939 | 0.999 |
| 4.94 | 0.999 |
| 4.941 | 0.999 |
| 4.942 | 0.999 |
| 4.943 | 0.999 |
| 4.944 | 0.999 |
| 4.945 | 0.999 |
| 4.946 | 0.999 |
| 4.947 | 0.999 |
| 4.948 | 0.999 |
| 4.949 | 0.999 |
| 4.95 | 0.999 |
| 4.951 | 0.999 |
| 4.952 | 0.999 |
| 4.953 | 0.999 |
| 4.954 | 0.999 |
| 4.955 | 0.999 |
| 4.956 | 0.999 |
| 4.957 | 0.999 |
| 4.958 | 0.999 |
| 4.959 | 0.999 |
| 4.96 | 0.999 |
| 4.961 | 0.999 |
| 4.962 | 1 |
| 4.963 | 1 |
| 4.964 | 1 |
| 4.965 | 1 |
| 4.966 | 1 |
| 4.967 | 1 |
| 4.968 | 1 |
| 4.969 | 1 |
| 4.97 | 1 |
| 4.971 | 1 |
| 4.972 | 1 |
| 4.973 | 1 |
| 4.974 | 1 |
| 4.975 | 1 |
| 4.976 | 1 |
| 4.977 | 1 |
| 4.978 | 1 |
| 4.979 | 1 |
| 4.98 | 1 |
| 4.981 | 1 |
| 4.982 | 1 |
| 4.983 | 1 |
| 4.984 | 1 |
| 4.985 | 1 |
| 4.986 | 1 |
| 4.987 | 1 |
| 4.988 | 1 |
| 4.989 | 1 |
| 4.99 | 1 |
| 4.991 | 1 |
| 4.992 | 1 |
| 4.993 | 1 |
| 4.994 | 1 |
| 4.995 | 1 |
| 4.996 | 1 |
| 4.997 | 1 |
| 4.998 | 1 |
| 4.999 | 1 |
| 5.0 | 1 |
| 5.001 | 1 |
| 5.002 | 1 |
| 5.003 | 1 |
| 5.004 | 1 |
| 5.005 | 1 |
| 5.006 | 1 |
| 5.007 | 1 |
| 5.008 | 1 |
| 5.009 | 1 |
| 5.01 | 1 |
| 5.011 | 1 |
| 5.012 | 1 |
| 5.013 | 1 |
| 5.014 | 1 |
| 5.015 | 1 |
| 5.016 | 1 |
| 5.017 | 1 |
| 5.018 | 1 |
| 5.019 | 1 |
| 5.02 | 1 |
| 5.021 | 1 |
| 5.022 | 1 |
| 5.023 | 1 |
| 5.024 | 1 |
| 5.025 | 1 |
| 5.026 | 1 |
| 5.027 | 1 |
| 5.028 | 1 |
| 5.029 | 1 |
| 5.03 | 1 |
| 5.031 | 1 |
| 5.032 | 1 |
| 5.033 | 1 |
| 5.034 | 1 |
| 5.035 | 1 |
| 5.036 | 1 |
| 5.037 | 1 |
| 5.038 | 1 |
| 5.039 | 0.999 |
| 5.04 | 0.999 |
| 5.041 | 0.999 |
| 5.042 | 0.999 |
| 5.043 | 0.999 |
| 5.044 | 0.999 |
| 5.045 | 0.999 |
| 5.046 | 0.999 |
| 5.047 | 0.999 |
| 5.048 | 0.999 |
| 5.049 | 0.999 |
| 5.05 | 0.999 |
| 5.051 | 0.999 |
| 5.052 | 0.999 |
| 5.053 | 0.999 |
| 5.054 | 0.999 |
| 5.055 | 0.999 |
| 5.056 | 0.999 |
| 5.057 | 0.999 |
| 5.058 | 0.999 |
| 5.059 | 0.999 |
| 5.06 | 0.999 |
| 5.061 | 0.999 |
| 5.062 | 0.999 |
| 5.063 | 0.999 |
| 5.064 | 0.999 |
| 5.065 | 0.999 |
| 5.066 | 0.999 |
| 5.067 | 0.999 |
| 5.068 | 0.998 |
| 5.069 | 0.998 |
| 5.07 | 0.998 |
| 5.071 | 0.998 |
| 5.072 | 0.998 |
| 5.073 | 0.998 |
| 5.074 | 0.998 |
| 5.075 | 0.998 |
| 5.076 | 0.998 |
| 5.077 | 0.998 |
| 5.078 | 0.998 |
| 5.079 | 0.998 |
| 5.08 | 0.998 |
| 5.081 | 0.998 |
| 5.082 | 0.998 |
| 5.083 | 0.998 |
| 5.084 | 0.998 |
| 5.085 | 0.998 |
| 5.086 | 0.998 |
| 5.087 | 0.997 |
| 5.088 | 0.997 |
| 5.089 | 0.997 |
| 5.09 | 0.997 |
| 5.091 | 0.997 |
| 5.092 | 0.997 |
| 5.093 | 0.997 |
| 5.094 | 0.997 |
| 5.095 | 0.997 |
| 5.096 | 0.997 |
| 5.097 | 0.997 |
| 5.098 | 0.997 |
| 5.099 | 0.997 |
| 5.1 | 0.997 |
| 5.101 | 0.997 |
| 5.102 | 0.997 |
| 5.103 | 0.996 |
| 5.104 | 0.996 |
| 5.105 | 0.996 |
| 5.106 | 0.996 |
| 5.107 | 0.996 |
| 5.108 | 0.996 |
| 5.109 | 0.996 |
| 5.11 | 0.996 |
| 5.111 | 0.996 |
| 5.112 | 0.996 |
| 5.113 | 0.996 |
| 5.114 | 0.996 |
| 5.115 | 0.996 |
| 5.116 | 0.996 |
| 5.117 | 0.995 |
| 5.118 | 0.995 |
| 5.119 | 0.995 |
| 5.12 | 0.995 |
| 5.121 | 0.995 |
| 5.122 | 0.995 |
| 5.123 | 0.995 |
| 5.124 | 0.995 |
| 5.125 | 0.995 |
| 5.126 | 0.995 |
| 5.127 | 0.995 |
| 5.128 | 0.995 |
| 5.129 | 0.994 |
| 5.13 | 0.994 |
| 5.131 | 0.994 |
| 5.132 | 0.994 |
| 5.133 | 0.994 |
| 5.134 | 0.994 |
| 5.135 | 0.994 |
| 5.136 | 0.994 |
| 5.137 | 0.994 |
| 5.138 | 0.994 |
| 5.139 | 0.994 |
| 5.14 | 0.993 |
| 5.141 | 0.993 |
| 5.142 | 0.993 |
| 5.143 | 0.993 |
| 5.144 | 0.993 |
| 5.145 | 0.993 |
| 5.146 | 0.993 |
| 5.147 | 0.993 |
| 5.148 | 0.993 |
| 5.149 | 0.993 |
| 5.15 | 0.993 |
| 5.151 | 0.992 |
| 5.152 | 0.992 |
| 5.153 | 0.992 |
| 5.154 | 0.992 |
| 5.155 | 0.992 |
| 5.156 | 0.992 |
| 5.157 | 0.992 |
| 5.158 | 0.992 |
| 5.159 | 0.992 |
| 5.16 | 0.992 |
| 5.161 | 0.991 |
| 5.162 | 0.991 |
| 5.163 | 0.991 |
| 5.164 | 0.991 |
| 5.165 | 0.991 |
| 5.166 | 0.991 |
| 5.167 | 0.991 |
| 5.168 | 0.991 |
| 5.169 | 0.991 |
| 5.17 | 0.99 |
| 5.171 | 0.99 |
| 5.172 | 0.99 |
| 5.173 | 0.99 |
| 5.174 | 0.99 |
| 5.175 | 0.99 |
| 5.176 | 0.99 |
| 5.177 | 0.99 |
| 5.178 | 0.989 |
| 5.179 | 0.989 |
| 5.18 | 0.989 |
| 5.181 | 0.989 |
| 5.182 | 0.989 |
| 5.183 | 0.989 |
| 5.184 | 0.989 |
| 5.185 | 0.989 |
| 5.186 | 0.989 |
| 5.187 | 0.988 |
| 5.188 | 0.988 |
| 5.189 | 0.988 |
| 5.19 | 0.988 |
| 5.191 | 0.988 |
| 5.192 | 0.988 |
| 5.193 | 0.988 |
| 5.194 | 0.988 |
| 5.195 | 0.987 |
| 5.196 | 0.987 |
| 5.197 | 0.987 |
| 5.198 | 0.987 |
| 5.199 | 0.987 |
| 5.2 | 0.987 |
| 5.201 | 0.987 |
| 5.202 | 0.986 |
| 5.203 | 0.986 |
| 5.204 | 0.986 |
| 5.205 | 0.986 |
| 5.206 | 0.986 |
| 5.207 | 0.986 |
| 5.208 | 0.986 |
| 5.209 | 0.986 |
| 5.21 | 0.985 |
| 5.211 | 0.985 |
| 5.212 | 0.985 |
| 5.213 | 0.985 |
| 5.214 | 0.985 |
| 5.215 | 0.985 |
| 5.216 | 0.985 |
| 5.217 | 0.984 |
| 5.218 | 0.984 |
| 5.219 | 0.984 |
| 5.22 | 0.984 |
| 5.221 | 0.984 |
| 5.222 | 0.984 |
| 5.223 | 0.984 |
| 5.224 | 0.983 |
| 5.225 | 0.983 |
| 5.226 | 0.983 |
| 5.227 | 0.983 |
| 5.228 | 0.983 |
| 5.229 | 0.983 |
| 5.23 | 0.983 |
| 5.231 | 0.982 |
| 5.232 | 0.982 |
| 5.233 | 0.982 |
| 5.234 | 0.982 |
| 5.235 | 0.982 |
| 5.236 | 0.982 |
| 5.237 | 0.981 |
| 5.238 | 0.981 |
| 5.239 | 0.981 |
| 5.24 | 0.981 |
| 5.241 | 0.981 |
| 5.242 | 0.981 |
| 5.243 | 0.981 |
| 5.244 | 0.98 |
| 5.245 | 0.98 |
| 5.246 | 0.98 |
| 5.247 | 0.98 |
| 5.248 | 0.98 |
| 5.249 | 0.98 |
| 5.25 | 0.979 |
| 5.251 | 0.979 |
| 5.252 | 0.979 |
| 5.253 | 0.979 |
| 5.254 | 0.979 |
| 5.255 | 0.979 |
| 5.256 | 0.978 |
| 5.257 | 0.978 |
| 5.258 | 0.978 |
| 5.259 | 0.978 |
| 5.26 | 0.978 |
| 5.261 | 0.978 |
| 5.262 | 0.977 |
| 5.263 | 0.977 |
| 5.264 | 0.977 |
| 5.265 | 0.977 |
| 5.266 | 0.977 |
| 5.267 | 0.977 |
| 5.268 | 0.976 |
| 5.269 | 0.976 |
| 5.27 | 0.976 |
| 5.271 | 0.976 |
| 5.272 | 0.976 |
| 5.273 | 0.975 |
| 5.274 | 0.975 |
| 5.275 | 0.975 |
| 5.276 | 0.975 |
| 5.277 | 0.975 |
| 5.278 | 0.975 |
| 5.279 | 0.974 |
| 5.28 | 0.974 |
| 5.281 | 0.974 |
| 5.282 | 0.974 |
| 5.283 | 0.974 |
| 5.284 | 0.973 |
| 5.285 | 0.973 |
| 5.286 | 0.973 |
| 5.287 | 0.973 |
| 5.288 | 0.973 |
| 5.289 | 0.973 |
| 5.29 | 0.972 |
| 5.291 | 0.972 |
| 5.292 | 0.972 |
| 5.293 | 0.972 |
| 5.294 | 0.972 |
| 5.295 | 0.971 |
| 5.296 | 0.971 |
| 5.297 | 0.971 |
| 5.298 | 0.971 |
| 5.299 | 0.971 |
| 5.3 | 0.97 |
| 5.301 | 0.97 |
| 5.302 | 0.97 |
| 5.303 | 0.97 |
| 5.304 | 0.97 |
| 5.305 | 0.969 |
| 5.306 | 0.969 |
| 5.307 | 0.969 |
| 5.308 | 0.969 |
| 5.309 | 0.969 |
| 5.31 | 0.968 |
| 5.311 | 0.968 |
| 5.312 | 0.968 |
| 5.313 | 0.968 |
| 5.314 | 0.968 |
| 5.315 | 0.967 |
| 5.316 | 0.967 |
| 5.317 | 0.967 |
| 5.318 | 0.967 |
| 5.319 | 0.967 |
| 5.32 | 0.966 |
| 5.321 | 0.966 |
| 5.322 | 0.966 |
| 5.323 | 0.966 |
| 5.324 | 0.966 |
| 5.325 | 0.965 |
| 5.326 | 0.965 |
| 5.327 | 0.965 |
| 5.328 | 0.965 |
| 5.329 | 0.965 |
| 5.33 | 0.964 |
| 5.331 | 0.964 |
| 5.332 | 0.964 |
| 5.333 | 0.964 |
| 5.334 | 0.963 |
| 5.335 | 0.963 |
| 5.336 | 0.963 |
| 5.337 | 0.963 |
| 5.338 | 0.963 |
| 5.339 | 0.962 |
| 5.34 | 0.962 |
| 5.341 | 0.962 |
| 5.342 | 0.962 |
| 5.343 | 0.962 |
| 5.344 | 0.961 |
| 5.345 | 0.961 |
| 5.346 | 0.961 |
| 5.347 | 0.961 |
| 5.348 | 0.96 |
| 5.349 | 0.96 |
| 5.35 | 0.96 |
| 5.351 | 0.96 |
| 5.352 | 0.96 |
| 5.353 | 0.959 |
| 5.354 | 0.959 |
| 5.355 | 0.959 |
| 5.356 | 0.959 |
| 5.357 | 0.958 |
| 5.358 | 0.958 |
| 5.359 | 0.958 |
| 5.36 | 0.958 |
| 5.361 | 0.957 |
| 5.362 | 0.957 |
| 5.363 | 0.957 |
| 5.364 | 0.957 |
| 5.365 | 0.957 |
| 5.366 | 0.956 |
| 5.367 | 0.956 |
| 5.368 | 0.956 |
| 5.369 | 0.956 |
| 5.37 | 0.955 |
| 5.371 | 0.955 |
| 5.372 | 0.955 |
| 5.373 | 0.955 |
| 5.374 | 0.954 |
| 5.375 | 0.954 |
| 5.376 | 0.954 |
| 5.377 | 0.954 |
| 5.378 | 0.953 |
| 5.379 | 0.953 |
| 5.38 | 0.953 |
| 5.381 | 0.953 |
| 5.382 | 0.953 |
| 5.383 | 0.952 |
| 5.384 | 0.952 |
| 5.385 | 0.952 |
| 5.386 | 0.952 |
| 5.387 | 0.951 |
| 5.388 | 0.951 |
| 5.389 | 0.951 |
| 5.39 | 0.951 |
| 5.391 | 0.95 |
| 5.392 | 0.95 |
| 5.393 | 0.95 |
| 5.394 | 0.95 |
| 5.395 | 0.949 |
| 5.396 | 0.949 |
| 5.397 | 0.949 |
| 5.398 | 0.949 |
| 5.399 | 0.948 |
| 5.4 | 0.948 |
| 5.401 | 0.948 |
| 5.402 | 0.948 |
| 5.403 | 0.947 |
| 5.404 | 0.947 |
| 5.405 | 0.947 |
| 5.406 | 0.947 |
| 5.407 | 0.946 |
| 5.408 | 0.946 |
| 5.409 | 0.946 |
| 5.41 | 0.946 |
| 5.411 | 0.945 |
| 5.412 | 0.945 |
| 5.413 | 0.945 |
| 5.414 | 0.944 |
| 5.415 | 0.944 |
| 5.416 | 0.944 |
| 5.417 | 0.944 |
| 5.418 | 0.943 |
| 5.419 | 0.943 |
| 5.42 | 0.943 |
| 5.421 | 0.943 |
| 5.422 | 0.942 |
| 5.423 | 0.942 |
| 5.424 | 0.942 |
| 5.425 | 0.942 |
| 5.426 | 0.941 |
| 5.427 | 0.941 |
| 5.428 | 0.941 |
| 5.429 | 0.94 |
| 5.43 | 0.94 |
| 5.431 | 0.94 |
| 5.432 | 0.94 |
| 5.433 | 0.939 |
| 5.434 | 0.939 |
| 5.435 | 0.939 |
| 5.436 | 0.939 |
| 5.437 | 0.938 |
| 5.438 | 0.938 |
| 5.439 | 0.938 |
| 5.44 | 0.938 |
| 5.441 | 0.937 |
| 5.442 | 0.937 |
| 5.443 | 0.937 |
| 5.444 | 0.936 |
| 5.445 | 0.936 |
| 5.446 | 0.936 |
| 5.447 | 0.936 |
| 5.448 | 0.935 |
| 5.449 | 0.935 |
| 5.45 | 0.935 |
| 5.451 | 0.934 |
| 5.452 | 0.934 |
| 5.453 | 0.934 |
| 5.454 | 0.934 |
| 5.455 | 0.933 |
| 5.456 | 0.933 |
| 5.457 | 0.933 |
| 5.458 | 0.932 |
| 5.459 | 0.932 |
| 5.46 | 0.932 |
| 5.461 | 0.932 |
| 5.462 | 0.931 |
| 5.463 | 0.931 |
| 5.464 | 0.931 |
| 5.465 | 0.93 |
| 5.466 | 0.93 |
| 5.467 | 0.93 |
| 5.468 | 0.93 |
| 5.469 | 0.929 |
| 5.47 | 0.929 |
| 5.471 | 0.929 |
| 5.472 | 0.928 |
| 5.473 | 0.928 |
| 5.474 | 0.928 |
| 5.475 | 0.928 |
| 5.476 | 0.927 |
| 5.477 | 0.927 |
| 5.478 | 0.927 |
| 5.479 | 0.926 |
| 5.48 | 0.926 |
| 5.481 | 0.926 |
| 5.482 | 0.925 |
| 5.483 | 0.925 |
| 5.484 | 0.925 |
| 5.485 | 0.925 |
| 5.486 | 0.924 |
| 5.487 | 0.924 |
| 5.488 | 0.924 |
| 5.489 | 0.923 |
| 5.49 | 0.923 |
| 5.491 | 0.923 |
| 5.492 | 0.922 |
| 5.493 | 0.922 |
| 5.494 | 0.922 |
| 5.495 | 0.922 |
| 5.496 | 0.921 |
| 5.497 | 0.921 |
| 5.498 | 0.921 |
| 5.499 | 0.92 |
| 5.5 | 0.92 |
| 5.501 | 0.92 |
| 5.502 | 0.919 |
| 5.503 | 0.919 |
| 5.504 | 0.919 |
| 5.505 | 0.919 |
| 5.506 | 0.918 |
| 5.507 | 0.918 |
| 5.508 | 0.918 |
| 5.509 | 0.917 |
| 5.51 | 0.917 |
| 5.511 | 0.917 |
| 5.512 | 0.916 |
| 5.513 | 0.916 |
| 5.514 | 0.916 |
| 5.515 | 0.915 |
| 5.516 | 0.915 |
| 5.517 | 0.915 |
| 5.518 | 0.914 |
| 5.519 | 0.914 |
| 5.52 | 0.914 |
| 5.521 | 0.913 |
| 5.522 | 0.913 |
| 5.523 | 0.913 |
| 5.524 | 0.913 |
| 5.525 | 0.912 |
| 5.526 | 0.912 |
| 5.527 | 0.912 |
| 5.528 | 0.911 |
| 5.529 | 0.911 |
| 5.53 | 0.911 |
| 5.531 | 0.91 |
| 5.532 | 0.91 |
| 5.533 | 0.91 |
| 5.534 | 0.909 |
| 5.535 | 0.909 |
| 5.536 | 0.909 |
| 5.537 | 0.908 |
| 5.538 | 0.908 |
| 5.539 | 0.908 |
| 5.54 | 0.907 |
| 5.541 | 0.907 |
| 5.542 | 0.907 |
| 5.543 | 0.906 |
| 5.544 | 0.906 |
| 5.545 | 0.906 |
| 5.546 | 0.905 |
| 5.547 | 0.905 |
| 5.548 | 0.905 |
| 5.549 | 0.904 |
| 5.55 | 0.904 |
| 5.551 | 0.904 |
| 5.552 | 0.903 |
| 5.553 | 0.903 |
| 5.554 | 0.903 |
| 5.555 | 0.902 |
| 5.556 | 0.902 |
| 5.557 | 0.902 |
| 5.558 | 0.901 |
| 5.559 | 0.901 |
| 5.56 | 0.901 |
| 5.561 | 0.9 |
| 5.562 | 0.9 |
| 5.563 | 0.9 |
| 5.564 | 0.899 |
| 5.565 | 0.899 |
| 5.566 | 0.899 |
| 5.567 | 0.898 |
| 5.568 | 0.898 |
| 5.569 | 0.898 |
| 5.57 | 0.897 |
| 5.571 | 0.897 |
| 5.572 | 0.897 |
| 5.573 | 0.896 |
| 5.574 | 0.896 |
| 5.575 | 0.896 |
| 5.576 | 0.895 |
| 5.577 | 0.895 |
| 5.578 | 0.895 |
| 5.579 | 0.894 |
| 5.58 | 0.894 |
| 5.581 | 0.894 |
| 5.582 | 0.893 |
| 5.583 | 0.893 |
| 5.584 | 0.893 |
| 5.585 | 0.892 |
| 5.586 | 0.892 |
| 5.587 | 0.891 |
| 5.588 | 0.891 |
| 5.589 | 0.891 |
| 5.59 | 0.89 |
| 5.591 | 0.89 |
| 5.592 | 0.89 |
| 5.593 | 0.889 |
| 5.594 | 0.889 |
| 5.595 | 0.889 |
| 5.596 | 0.888 |
| 5.597 | 0.888 |
| 5.598 | 0.888 |
| 5.599 | 0.887 |
| 5.6 | 0.887 |
| 5.601 | 0.887 |
| 5.602 | 0.886 |
| 5.603 | 0.886 |
| 5.604 | 0.885 |
| 5.605 | 0.885 |
| 5.606 | 0.885 |
| 5.607 | 0.884 |
| 5.608 | 0.884 |
| 5.609 | 0.884 |
| 5.61 | 0.883 |
| 5.611 | 0.883 |
| 5.612 | 0.883 |
| 5.613 | 0.882 |
| 5.614 | 0.882 |
| 5.615 | 0.882 |
| 5.616 | 0.881 |
| 5.617 | 0.881 |
| 5.618 | 0.88 |
| 5.619 | 0.88 |
| 5.62 | 0.88 |
| 5.621 | 0.879 |
| 5.622 | 0.879 |
| 5.623 | 0.879 |
| 5.624 | 0.878 |
| 5.625 | 0.878 |
| 5.626 | 0.878 |
| 5.627 | 0.877 |
| 5.628 | 0.877 |
| 5.628999999999999 | 0.876 |
| 5.63 | 0.876 |
| 5.631 | 0.876 |
| 5.632 | 0.875 |
| 5.633 | 0.875 |
| 5.634 | 0.875 |
| 5.635 | 0.874 |
| 5.636 | 0.874 |
| 5.636999999999999 | 0.873 |
| 5.638 | 0.873 |
| 5.639 | 0.873 |
| 5.64 | 0.872 |
| 5.641 | 0.872 |
| 5.642 | 0.872 |
| 5.643 | 0.871 |
| 5.644 | 0.871 |
| 5.644999999999999 | 0.871 |
| 5.646 | 0.87 |
| 5.647 | 0.87 |
| 5.648 | 0.869 |
| 5.649 | 0.869 |
| 5.65 | 0.869 |
| 5.651 | 0.868 |
| 5.652 | 0.868 |
| 5.652999999999999 | 0.868 |
| 5.654 | 0.867 |
| 5.655 | 0.867 |
| 5.656 | 0.866 |
| 5.657 | 0.866 |
| 5.658 | 0.866 |
| 5.659 | 0.865 |
| 5.66 | 0.865 |
| 5.660999999999999 | 0.864 |
| 5.662 | 0.864 |
| 5.663 | 0.864 |
| 5.664 | 0.863 |
| 5.665 | 0.863 |
| 5.666 | 0.863 |
| 5.667 | 0.862 |
| 5.668 | 0.862 |
| 5.668999999999999 | 0.861 |
| 5.67 | 0.861 |
| 5.671 | 0.861 |
| 5.672 | 0.86 |
| 5.673 | 0.86 |
| 5.674 | 0.859 |
| 5.675 | 0.859 |
| 5.676 | 0.859 |
| 5.677 | 0.858 |
| 5.678 | 0.858 |
| 5.679 | 0.858 |
| 5.68 | 0.857 |
| 5.681 | 0.857 |
| 5.682 | 0.856 |
| 5.683 | 0.856 |
| 5.684 | 0.856 |
| 5.685 | 0.855 |
| 5.686 | 0.855 |
| 5.687 | 0.854 |
| 5.688 | 0.854 |
| 5.689 | 0.854 |
| 5.69 | 0.853 |
| 5.691 | 0.853 |
| 5.692 | 0.852 |
| 5.693 | 0.852 |
| 5.694 | 0.852 |
| 5.695 | 0.851 |
| 5.696 | 0.851 |
| 5.697 | 0.85 |
| 5.698 | 0.85 |
| 5.699 | 0.85 |
| 5.7 | 0.849 |
| 5.701 | 0.849 |
| 5.702 | 0.849 |
| 5.703 | 0.848 |
| 5.704 | 0.848 |
| 5.705 | 0.847 |
| 5.706 | 0.847 |
| 5.707 | 0.847 |
| 5.708 | 0.846 |
| 5.709 | 0.846 |
| 5.71 | 0.845 |
| 5.711 | 0.845 |
| 5.712 | 0.845 |
| 5.713 | 0.844 |
| 5.714 | 0.844 |
| 5.715 | 0.843 |
| 5.716 | 0.843 |
| 5.717 | 0.843 |
| 5.718 | 0.842 |
| 5.719 | 0.842 |
| 5.72 | 0.841 |
| 5.721 | 0.841 |
| 5.722 | 0.84 |
| 5.723 | 0.84 |
| 5.724 | 0.84 |
| 5.725 | 0.839 |
| 5.726 | 0.839 |
| 5.727 | 0.838 |
| 5.728 | 0.838 |
| 5.729 | 0.838 |
| 5.73 | 0.837 |
| 5.731 | 0.837 |
| 5.732 | 0.836 |
| 5.733 | 0.836 |
| 5.734 | 0.836 |
| 5.735 | 0.835 |
| 5.736 | 0.835 |
| 5.737 | 0.834 |
| 5.738 | 0.834 |
| 5.739 | 0.834 |
| 5.74 | 0.833 |
| 5.741 | 0.833 |
| 5.742 | 0.832 |
| 5.743 | 0.832 |
| 5.744 | 0.832 |
| 5.745 | 0.831 |
| 5.746 | 0.831 |
| 5.747 | 0.83 |
| 5.748 | 0.83 |
| 5.749 | 0.829 |
| 5.75 | 0.829 |
| 5.751 | 0.829 |
| 5.752 | 0.828 |
| 5.753 | 0.828 |
| 5.753999999999999 | 0.827 |
| 5.755 | 0.827 |
| 5.756 | 0.827 |
| 5.757 | 0.826 |
| 5.758 | 0.826 |
| 5.759 | 0.825 |
| 5.76 | 0.825 |
| 5.761 | 0.824 |
| 5.761999999999999 | 0.824 |
| 5.763 | 0.824 |
| 5.764 | 0.823 |
| 5.765 | 0.823 |
| 5.766 | 0.822 |
| 5.767 | 0.822 |
| 5.768 | 0.822 |
| 5.769 | 0.821 |
| 5.769999999999999 | 0.821 |
| 5.771 | 0.82 |
| 5.772 | 0.82 |
| 5.773 | 0.819 |
| 5.774 | 0.819 |
| 5.775 | 0.819 |
| 5.776 | 0.818 |
| 5.777 | 0.818 |
| 5.778 | 0.817 |
| 5.779 | 0.817 |
| 5.78 | 0.816 |
| 5.781 | 0.816 |
| 5.782 | 0.816 |
| 5.783 | 0.815 |
| 5.784 | 0.815 |
| 5.785 | 0.814 |
| 5.786 | 0.814 |
| 5.787 | 0.813 |
| 5.788 | 0.813 |
| 5.789 | 0.813 |
| 5.79 | 0.812 |
| 5.791 | 0.812 |
| 5.792 | 0.811 |
| 5.793 | 0.811 |
| 5.794 | 0.81 |
| 5.795 | 0.81 |
| 5.796 | 0.81 |
| 5.797 | 0.809 |
| 5.798 | 0.809 |
| 5.799 | 0.808 |
| 5.8 | 0.808 |
| 5.801 | 0.807 |
| 5.802 | 0.807 |
| 5.803 | 0.807 |
| 5.804 | 0.806 |
| 5.805 | 0.806 |
| 5.806 | 0.805 |
| 5.807 | 0.805 |
| 5.808 | 0.804 |
| 5.809 | 0.804 |
| 5.81 | 0.804 |
| 5.811 | 0.803 |
| 5.812 | 0.803 |
| 5.813 | 0.802 |
| 5.814 | 0.802 |
| 5.815 | 0.801 |
| 5.816 | 0.801 |
| 5.817 | 0.801 |
| 5.818 | 0.8 |
| 5.819 | 0.8 |
| 5.82 | 0.799 |
| 5.821 | 0.799 |
| 5.822 | 0.798 |
| 5.823 | 0.798 |
| 5.824 | 0.797 |
| 5.825 | 0.797 |
| 5.826 | 0.797 |
| 5.827 | 0.796 |
| 5.828 | 0.796 |
| 5.829 | 0.795 |
| 5.83 | 0.795 |
| 5.831 | 0.794 |
| 5.832 | 0.794 |
| 5.833 | 0.794 |
| 5.834 | 0.793 |
| 5.835 | 0.793 |
| 5.836 | 0.792 |
| 5.837 | 0.792 |
| 5.838 | 0.791 |
| 5.839 | 0.791 |
| 5.84 | 0.79 |
| 5.841 | 0.79 |
| 5.842 | 0.79 |
| 5.843 | 0.789 |
| 5.844 | 0.789 |
| 5.845 | 0.788 |
| 5.846 | 0.788 |
| 5.847 | 0.787 |
| 5.848 | 0.787 |
| 5.849 | 0.786 |
| 5.85 | 0.786 |
| 5.851 | 0.786 |
| 5.852 | 0.785 |
| 5.853 | 0.785 |
| 5.854 | 0.784 |
| 5.855 | 0.784 |
| 5.856 | 0.783 |
| 5.857 | 0.783 |
| 5.858 | 0.782 |
| 5.859 | 0.782 |
| 5.86 | 0.782 |
| 5.861 | 0.781 |
| 5.862 | 0.781 |
| 5.863 | 0.78 |
| 5.864 | 0.78 |
| 5.865 | 0.779 |
| 5.866 | 0.779 |
| 5.867 | 0.778 |
| 5.868 | 0.778 |
| 5.869 | 0.777 |
| 5.87 | 0.777 |
| 5.871 | 0.777 |
| 5.872 | 0.776 |
| 5.873 | 0.776 |
| 5.874 | 0.775 |
| 5.875 | 0.775 |
| 5.876 | 0.774 |
| 5.877 | 0.774 |
| 5.878 | 0.773 |
| 5.879 | 0.773 |
| 5.88 | 0.772 |
| 5.881 | 0.772 |
| 5.882 | 0.772 |
| 5.883 | 0.771 |
| 5.884 | 0.771 |
| 5.885 | 0.77 |
| 5.886 | 0.77 |
| 5.887 | 0.769 |
| 5.888 | 0.769 |
| 5.889 | 0.768 |
| 5.89 | 0.768 |
| 5.891 | 0.767 |
| 5.892 | 0.767 |
| 5.893 | 0.767 |
| 5.894 | 0.766 |
| 5.895 | 0.766 |
| 5.896 | 0.765 |
| 5.897 | 0.765 |
| 5.898 | 0.764 |
| 5.899 | 0.764 |
| 5.9 | 0.763 |
| 5.901 | 0.763 |
| 5.902 | 0.762 |
| 5.903 | 0.762 |
| 5.904 | 0.762 |
| 5.905 | 0.761 |
| 5.906 | 0.761 |
| 5.907 | 0.76 |
| 5.908 | 0.76 |
| 5.909 | 0.759 |
| 5.91 | 0.759 |
| 5.911 | 0.758 |
| 5.912 | 0.758 |
| 5.913 | 0.757 |
| 5.914 | 0.757 |
| 5.915 | 0.756 |
| 5.916 | 0.756 |
| 5.917 | 0.756 |
| 5.918 | 0.755 |
| 5.919 | 0.755 |
| 5.92 | 0.754 |
| 5.921 | 0.754 |
| 5.922 | 0.753 |
| 5.923 | 0.753 |
| 5.924 | 0.752 |
| 5.925 | 0.752 |
| 5.926 | 0.751 |
| 5.927 | 0.751 |
| 5.928 | 0.75 |
| 5.929 | 0.75 |
| 5.93 | 0.75 |
| 5.931 | 0.749 |
| 5.932 | 0.749 |
| 5.933 | 0.748 |
| 5.934 | 0.748 |
| 5.935 | 0.747 |
| 5.936 | 0.747 |
| 5.937 | 0.746 |
| 5.938 | 0.746 |
| 5.939 | 0.745 |
| 5.94 | 0.745 |
| 5.941 | 0.744 |
| 5.942 | 0.744 |
| 5.943 | 0.743 |
| 5.944 | 0.743 |
| 5.945 | 0.743 |
| 5.946 | 0.742 |
| 5.947 | 0.742 |
| 5.948 | 0.741 |
| 5.949 | 0.741 |
| 5.95 | 0.74 |
| 5.951 | 0.74 |
| 5.952 | 0.739 |
| 5.953 | 0.739 |
| 5.954 | 0.738 |
| 5.955 | 0.738 |
| 5.956 | 0.737 |
| 5.957 | 0.737 |
| 5.958 | 0.736 |
| 5.959 | 0.736 |
| 5.96 | 0.736 |
| 5.961 | 0.735 |
| 5.962 | 0.735 |
| 5.963 | 0.734 |
| 5.964 | 0.734 |
| 5.965 | 0.733 |
| 5.966 | 0.733 |
| 5.967 | 0.732 |
| 5.968 | 0.732 |
| 5.969 | 0.731 |
| 5.97 | 0.731 |
| 5.971 | 0.73 |
| 5.972 | 0.73 |
| 5.973 | 0.729 |
| 5.974 | 0.729 |
| 5.975 | 0.728 |
| 5.976 | 0.728 |
| 5.977 | 0.727 |
| 5.978 | 0.727 |
| 5.979 | 0.727 |
| 5.98 | 0.726 |
| 5.981 | 0.726 |
| 5.982 | 0.725 |
| 5.983 | 0.725 |
| 5.984 | 0.724 |
| 5.985 | 0.724 |
| 5.986 | 0.723 |
| 5.987 | 0.723 |
| 5.988 | 0.722 |
| 5.989 | 0.722 |
| 5.99 | 0.721 |
| 5.991 | 0.721 |
| 5.992 | 0.72 |
| 5.993 | 0.72 |
| 5.994 | 0.719 |
| 5.995 | 0.719 |
| 5.996 | 0.718 |
| 5.997 | 0.718 |
| 5.998 | 0.717 |
| 5.999 | 0.717 |
| 6.0 | 0.717 |
| 6.001 | 0.716 |
| 6.002 | 0.716 |
| 6.003 | 0.715 |
| 6.004 | 0.715 |
| 6.005 | 0.714 |
| 6.006 | 0.714 |
| 6.007 | 0.713 |
| 6.008 | 0.713 |
| 6.009 | 0.712 |
| 6.01 | 0.712 |
| 6.011 | 0.711 |
| 6.012 | 0.711 |
| 6.013 | 0.71 |
| 6.014 | 0.71 |
| 6.015 | 0.709 |
| 6.016 | 0.709 |
| 6.017 | 0.708 |
| 6.018 | 0.708 |
| 6.019 | 0.707 |
| 6.02 | 0.707 |
| 6.021 | 0.706 |
| 6.022 | 0.706 |
| 6.023 | 0.706 |
| 6.024 | 0.705 |
| 6.025 | 0.705 |
| 6.026 | 0.704 |
| 6.027 | 0.704 |
| 6.028 | 0.703 |
| 6.029 | 0.703 |
| 6.03 | 0.702 |
| 6.031 | 0.702 |
| 6.032 | 0.701 |
| 6.033 | 0.701 |
| 6.034 | 0.7 |
| 6.035 | 0.7 |
| 6.036 | 0.699 |
| 6.037 | 0.699 |
| 6.038 | 0.698 |
| 6.039 | 0.698 |
| 6.04 | 0.697 |
| 6.041 | 0.697 |
| 6.042 | 0.696 |
| 6.043 | 0.696 |
| 6.044 | 0.695 |
| 6.045 | 0.695 |
| 6.046 | 0.694 |
| 6.047 | 0.694 |
| 6.048 | 0.693 |
| 6.049 | 0.693 |
| 6.05 | 0.692 |
| 6.051 | 0.692 |
| 6.052 | 0.691 |
| 6.053 | 0.691 |
| 6.054 | 0.691 |
| 6.055 | 0.69 |
| 6.056 | 0.69 |
| 6.057 | 0.689 |
| 6.058 | 0.689 |
| 6.059 | 0.688 |
| 6.06 | 0.688 |
| 6.061 | 0.687 |
| 6.062 | 0.687 |
| 6.063 | 0.686 |
| 6.064 | 0.686 |
| 6.065 | 0.685 |
| 6.066 | 0.685 |
| 6.067 | 0.684 |
| 6.068 | 0.684 |
| 6.069 | 0.683 |
| 6.07 | 0.683 |
| 6.071 | 0.682 |
| 6.072 | 0.682 |
| 6.073 | 0.681 |
| 6.074 | 0.681 |
| 6.075 | 0.68 |
| 6.076 | 0.68 |
| 6.077 | 0.679 |
| 6.078 | 0.679 |
| 6.079 | 0.678 |
| 6.08 | 0.678 |
| 6.081 | 0.677 |
| 6.082 | 0.677 |
| 6.083 | 0.676 |
| 6.084 | 0.676 |
| 6.085 | 0.675 |
| 6.086 | 0.675 |
| 6.087 | 0.674 |
| 6.088 | 0.674 |
| 6.089 | 0.673 |
| 6.09 | 0.673 |
| 6.091 | 0.672 |
| 6.092 | 0.672 |
| 6.093 | 0.672 |
| 6.094 | 0.671 |
| 6.095 | 0.671 |
| 6.096 | 0.67 |
| 6.097 | 0.67 |
| 6.098 | 0.669 |
| 6.099 | 0.669 |
| 6.1 | 0.668 |
| 6.101 | 0.668 |
| 6.102 | 0.667 |
| 6.103 | 0.667 |
| 6.104 | 0.666 |
| 6.105 | 0.666 |
| 6.106 | 0.665 |
| 6.107 | 0.665 |
| 6.108 | 0.664 |
| 6.109 | 0.664 |
| 6.11 | 0.663 |
| 6.111 | 0.663 |
| 6.112 | 0.662 |
| 6.113 | 0.662 |
| 6.114 | 0.661 |
| 6.115 | 0.661 |
| 6.116 | 0.66 |
| 6.117 | 0.66 |
| 6.118 | 0.659 |
| 6.119 | 0.659 |
| 6.12 | 0.658 |
| 6.121 | 0.658 |
| 6.122 | 0.657 |
| 6.123 | 0.657 |
| 6.124 | 0.656 |
| 6.125 | 0.656 |
| 6.126 | 0.655 |
| 6.127 | 0.655 |
| 6.128 | 0.654 |
| 6.129 | 0.654 |
| 6.13 | 0.653 |
| 6.131 | 0.653 |
| 6.132 | 0.652 |
| 6.133 | 0.652 |
| 6.134 | 0.651 |
| 6.135 | 0.651 |
| 6.136 | 0.65 |
| 6.137 | 0.65 |
| 6.138 | 0.649 |
| 6.139 | 0.649 |
| 6.14 | 0.648 |
| 6.141 | 0.648 |
| 6.142 | 0.647 |
| 6.143 | 0.647 |
| 6.144 | 0.646 |
| 6.145 | 0.646 |
| 6.146 | 0.645 |
| 6.147 | 0.645 |
| 6.148 | 0.644 |
| 6.149 | 0.644 |
| 6.15 | 0.643 |
| 6.151 | 0.643 |
| 6.152 | 0.643 |
| 6.153 | 0.642 |
| 6.154 | 0.642 |
| 6.155 | 0.641 |
| 6.156 | 0.641 |
| 6.157 | 0.64 |
| 6.158 | 0.64 |
| 6.159 | 0.639 |
| 6.16 | 0.639 |
| 6.161 | 0.638 |
| 6.162 | 0.638 |
| 6.163 | 0.637 |
| 6.164 | 0.637 |
| 6.165 | 0.636 |
| 6.166 | 0.636 |
| 6.167 | 0.635 |
| 6.168 | 0.635 |
| 6.169 | 0.634 |
| 6.17 | 0.634 |
| 6.171 | 0.633 |
| 6.172 | 0.633 |
| 6.173 | 0.632 |
| 6.174 | 0.632 |
| 6.175 | 0.631 |
| 6.176 | 0.631 |
| 6.177 | 0.63 |
| 6.178 | 0.63 |
| 6.179 | 0.629 |
| 6.18 | 0.629 |
| 6.181 | 0.628 |
| 6.182 | 0.628 |
| 6.183 | 0.627 |
| 6.184 | 0.627 |
| 6.185 | 0.626 |
| 6.186 | 0.626 |
| 6.187 | 0.625 |
| 6.188 | 0.625 |
| 6.189 | 0.624 |
| 6.19 | 0.624 |
| 6.191 | 0.623 |
| 6.192 | 0.623 |
| 6.193 | 0.622 |
| 6.194 | 0.622 |
| 6.195 | 0.621 |
| 6.196 | 0.621 |
| 6.197 | 0.62 |
| 6.198 | 0.62 |
| 6.199 | 0.619 |
| 6.2 | 0.619 |
| 6.201 | 0.618 |
| 6.202 | 0.618 |
| 6.203 | 0.617 |
| 6.204 | 0.617 |
| 6.205 | 0.616 |
| 6.206 | 0.616 |
| 6.207 | 0.615 |
| 6.208 | 0.615 |
| 6.209 | 0.614 |
| 6.21 | 0.614 |
| 6.211 | 0.613 |
| 6.212 | 0.613 |
| 6.213 | 0.612 |
| 6.214 | 0.612 |
| 6.215 | 0.611 |
| 6.216 | 0.611 |
| 6.217 | 0.61 |
| 6.218 | 0.61 |
| 6.219 | 0.609 |
| 6.22 | 0.609 |
| 6.221 | 0.608 |
| 6.222 | 0.608 |
| 6.223 | 0.607 |
| 6.224 | 0.607 |
| 6.225 | 0.606 |
| 6.226 | 0.606 |
| 6.227 | 0.605 |
| 6.228 | 0.605 |
| 6.229 | 0.604 |
| 6.23 | 0.604 |
| 6.231 | 0.603 |
| 6.232 | 0.603 |
| 6.233 | 0.602 |
| 6.234 | 0.602 |
| 6.235 | 0.601 |
| 6.236 | 0.601 |
| 6.237 | 0.6 |
| 6.238 | 0.6 |
| 6.239 | 0.599 |
| 6.24 | 0.599 |
| 6.241 | 0.598 |
| 6.242 | 0.598 |
| 6.243 | 0.597 |
| 6.244 | 0.597 |
| 6.245 | 0.597 |
| 6.246 | 0.596 |
| 6.247 | 0.596 |
| 6.248 | 0.595 |
| 6.249 | 0.595 |
| 6.25 | 0.594 |
| 6.251 | 0.594 |
| 6.252 | 0.593 |
| 6.253 | 0.593 |
| 6.254 | 0.592 |
| 6.255 | 0.592 |
| 6.256 | 0.591 |
| 6.257 | 0.591 |
| 6.258 | 0.59 |
| 6.259 | 0.59 |
| 6.26 | 0.589 |
| 6.261 | 0.589 |
| 6.262 | 0.588 |
| 6.263 | 0.588 |
| 6.264 | 0.587 |
| 6.265 | 0.587 |
| 6.266 | 0.586 |
| 6.267 | 0.586 |
| 6.268 | 0.585 |
| 6.269 | 0.585 |
| 6.27 | 0.584 |
| 6.271 | 0.584 |
| 6.272 | 0.583 |
| 6.273 | 0.583 |
| 6.274 | 0.582 |
| 6.275 | 0.582 |
| 6.276 | 0.581 |
| 6.277 | 0.581 |
| 6.278 | 0.58 |
| 6.279 | 0.58 |
| 6.28 | 0.579 |
| 6.281 | 0.579 |
| 6.282 | 0.578 |
| 6.283 | 0.578 |
| 6.284 | 0.577 |
| 6.285 | 0.577 |
| 6.286 | 0.576 |
| 6.287 | 0.576 |
| 6.288 | 0.575 |
| 6.289 | 0.575 |
| 6.29 | 0.574 |
| 6.291 | 0.574 |
| 6.292 | 0.573 |
| 6.293 | 0.573 |
| 6.294 | 0.572 |
| 6.295 | 0.572 |
| 6.296 | 0.571 |
| 6.297 | 0.571 |
| 6.298 | 0.57 |
| 6.299 | 0.57 |
| 6.3 | 0.569 |
| 6.301 | 0.569 |
| 6.302 | 0.568 |
| 6.303 | 0.568 |
| 6.304 | 0.567 |
| 6.305 | 0.567 |
| 6.306 | 0.566 |
| 6.307 | 0.566 |
| 6.308 | 0.565 |
| 6.309 | 0.565 |
| 6.31 | 0.564 |
| 6.311 | 0.564 |
| 6.312 | 0.563 |
| 6.313 | 0.563 |
| 6.314 | 0.562 |
| 6.315 | 0.562 |
| 6.316 | 0.561 |
| 6.317 | 0.561 |
| 6.318 | 0.56 |
| 6.319 | 0.56 |
| 6.32 | 0.559 |
| 6.321 | 0.559 |
| 6.322 | 0.558 |
| 6.323 | 0.558 |
| 6.324 | 0.557 |
| 6.325 | 0.557 |
| 6.326 | 0.556 |
| 6.327 | 0.556 |
| 6.328 | 0.556 |
| 6.329 | 0.555 |
| 6.33 | 0.555 |
| 6.331 | 0.554 |
| 6.332 | 0.554 |
| 6.333 | 0.553 |
| 6.334 | 0.553 |
| 6.335 | 0.552 |
| 6.336 | 0.552 |
| 6.337 | 0.551 |
| 6.338 | 0.551 |
| 6.339 | 0.55 |
| 6.34 | 0.55 |
| 6.341 | 0.549 |
| 6.342 | 0.549 |
| 6.343 | 0.548 |
| 6.344 | 0.548 |
| 6.345 | 0.547 |
| 6.346 | 0.547 |
| 6.347 | 0.546 |
| 6.348 | 0.546 |
| 6.349 | 0.545 |
| 6.35 | 0.545 |
| 6.351 | 0.544 |
| 6.352 | 0.544 |
| 6.353 | 0.543 |
| 6.354 | 0.543 |
| 6.355 | 0.542 |
| 6.356 | 0.542 |
| 6.357 | 0.541 |
| 6.358 | 0.541 |
| 6.359 | 0.54 |
| 6.36 | 0.54 |
| 6.361 | 0.539 |
| 6.362 | 0.539 |
| 6.363 | 0.538 |
| 6.364 | 0.538 |
| 6.365 | 0.537 |
| 6.366 | 0.537 |
| 6.367 | 0.536 |
| 6.368 | 0.536 |
| 6.369 | 0.535 |
| 6.37 | 0.535 |
| 6.371 | 0.534 |
| 6.372 | 0.534 |
| 6.373 | 0.533 |
| 6.374 | 0.533 |
| 6.375 | 0.532 |
| 6.376 | 0.532 |
| 6.377 | 0.532 |
| 6.378 | 0.531 |
| 6.379 | 0.531 |
| 6.38 | 0.53 |
| 6.381 | 0.53 |
| 6.382 | 0.529 |
| 6.383 | 0.529 |
| 6.384 | 0.528 |
| 6.385 | 0.528 |
| 6.386 | 0.527 |
| 6.387 | 0.527 |
| 6.388 | 0.526 |
| 6.389 | 0.526 |
| 6.39 | 0.525 |
| 6.391 | 0.525 |
| 6.392 | 0.524 |
| 6.393 | 0.524 |
| 6.394 | 0.523 |
| 6.395 | 0.523 |
| 6.396 | 0.522 |
| 6.397 | 0.522 |
| 6.398 | 0.521 |
| 6.399 | 0.521 |
| 6.4 | 0.52 |
| 6.401 | 0.52 |
| 6.402 | 0.519 |
| 6.403 | 0.519 |
| 6.404 | 0.518 |
| 6.405 | 0.518 |
| 6.406 | 0.517 |
| 6.407 | 0.517 |
| 6.408 | 0.516 |
| 6.409 | 0.516 |
| 6.41 | 0.515 |
| 6.411 | 0.515 |
| 6.412 | 0.514 |
| 6.413 | 0.514 |
| 6.414 | 0.514 |
| 6.415 | 0.513 |
| 6.416 | 0.513 |
| 6.417 | 0.512 |
| 6.418 | 0.512 |
| 6.419 | 0.511 |
| 6.42 | 0.511 |
| 6.421 | 0.51 |
| 6.422 | 0.51 |
| 6.423 | 0.509 |
| 6.424 | 0.509 |
| 6.425 | 0.508 |
| 6.426 | 0.508 |
| 6.427 | 0.507 |
| 6.428 | 0.507 |
| 6.429 | 0.506 |
| 6.43 | 0.506 |
| 6.431 | 0.505 |
| 6.432 | 0.505 |
| 6.433 | 0.504 |
| 6.434 | 0.504 |
| 6.435 | 0.503 |
| 6.436 | 0.503 |
| 6.437 | 0.502 |
| 6.438 | 0.502 |
| 6.439 | 0.501 |
| 6.44 | 0.501 |
| 6.441 | 0.5 |
| 6.442 | 0.5 |
| 6.443 | 0.5 |
| 6.444 | 0.499 |
| 6.445 | 0.499 |
| 6.446 | 0.498 |
| 6.447 | 0.498 |
| 6.448 | 0.497 |
| 6.449 | 0.497 |
| 6.45 | 0.496 |
| 6.451 | 0.496 |
| 6.452 | 0.495 |
| 6.453 | 0.495 |
| 6.454 | 0.494 |
| 6.455 | 0.494 |
| 6.456 | 0.493 |
| 6.457 | 0.493 |
| 6.458 | 0.492 |
| 6.459 | 0.492 |
| 6.46 | 0.491 |
| 6.461 | 0.491 |
| 6.462 | 0.49 |
| 6.463 | 0.49 |
| 6.464 | 0.489 |
| 6.465 | 0.489 |
| 6.466 | 0.489 |
| 6.467 | 0.488 |
| 6.468 | 0.488 |
| 6.469 | 0.487 |
| 6.47 | 0.487 |
| 6.471 | 0.486 |
| 6.472 | 0.486 |
| 6.473 | 0.485 |
| 6.474 | 0.485 |
| 6.475 | 0.484 |
| 6.476 | 0.484 |
| 6.477 | 0.483 |
| 6.478 | 0.483 |
| 6.479 | 0.482 |
| 6.48 | 0.482 |
| 6.481 | 0.481 |
| 6.482 | 0.481 |
| 6.483 | 0.48 |
| 6.484 | 0.48 |
| 6.485 | 0.479 |
| 6.486 | 0.479 |
| 6.487 | 0.479 |
| 6.488 | 0.478 |
| 6.489 | 0.478 |
| 6.49 | 0.477 |
| 6.491 | 0.477 |
| 6.492 | 0.476 |
| 6.493 | 0.476 |
| 6.494 | 0.475 |
| 6.495 | 0.475 |
| 6.496 | 0.474 |
| 6.497 | 0.474 |
| 6.498 | 0.473 |
| 6.499 | 0.473 |
| 6.5 | 0.472 |
| 6.501 | 0.472 |
| 6.502 | 0.471 |
| 6.503 | 0.471 |
| 6.504 | 0.47 |
| 6.505 | 0.47 |
| 6.506 | 0.47 |
| 6.507 | 0.469 |
| 6.508 | 0.469 |
| 6.509 | 0.468 |
| 6.51 | 0.468 |
| 6.511 | 0.467 |
| 6.512 | 0.467 |
| 6.513 | 0.466 |
| 6.514 | 0.466 |
| 6.515 | 0.465 |
| 6.516 | 0.465 |
| 6.517 | 0.464 |
| 6.518 | 0.464 |
| 6.519 | 0.463 |
| 6.52 | 0.463 |
| 6.521 | 0.462 |
| 6.522 | 0.462 |
| 6.523 | 0.462 |
| 6.524 | 0.461 |
| 6.525 | 0.461 |
| 6.526 | 0.46 |
| 6.527 | 0.46 |
| 6.528 | 0.459 |
| 6.529 | 0.459 |
| 6.53 | 0.458 |
| 6.531 | 0.458 |
| 6.532 | 0.457 |
| 6.533 | 0.457 |
| 6.534 | 0.456 |
| 6.535 | 0.456 |
| 6.536 | 0.455 |
| 6.537 | 0.455 |
| 6.538 | 0.455 |
| 6.539 | 0.454 |
| 6.54 | 0.454 |
| 6.541 | 0.453 |
| 6.542 | 0.453 |
| 6.543 | 0.452 |
| 6.544 | 0.452 |
| 6.545 | 0.451 |
| 6.546 | 0.451 |
| 6.547 | 0.45 |
| 6.548 | 0.45 |
| 6.549 | 0.449 |
| 6.55 | 0.449 |
| 6.551 | 0.448 |
| 6.552 | 0.448 |
| 6.553 | 0.448 |
| 6.554 | 0.447 |
| 6.555 | 0.447 |
| 6.556 | 0.446 |
| 6.557 | 0.446 |
| 6.558 | 0.445 |
| 6.559 | 0.445 |
| 6.56 | 0.444 |
| 6.561 | 0.444 |
| 6.562 | 0.443 |
| 6.563 | 0.443 |
| 6.564 | 0.442 |
| 6.565 | 0.442 |
| 6.566 | 0.442 |
| 6.567 | 0.441 |
| 6.568 | 0.441 |
| 6.569 | 0.44 |
| 6.57 | 0.44 |
| 6.571 | 0.439 |
| 6.572 | 0.439 |
| 6.573 | 0.438 |
| 6.574 | 0.438 |
| 6.575 | 0.437 |
| 6.576 | 0.437 |
| 6.577 | 0.436 |
| 6.578 | 0.436 |
| 6.579 | 0.436 |
| 6.58 | 0.435 |
| 6.581 | 0.435 |
| 6.582 | 0.434 |
| 6.583 | 0.434 |
| 6.584 | 0.433 |
| 6.585 | 0.433 |
| 6.586 | 0.432 |
| 6.587 | 0.432 |
| 6.588 | 0.431 |
| 6.589 | 0.431 |
| 6.59 | 0.431 |
| 6.591 | 0.43 |
| 6.592 | 0.43 |
| 6.593 | 0.429 |
| 6.594 | 0.429 |
| 6.595 | 0.428 |
| 6.596 | 0.428 |
| 6.597 | 0.427 |
| 6.598 | 0.427 |
| 6.599 | 0.426 |
| 6.6 | 0.426 |
| 6.601 | 0.426 |
| 6.602 | 0.425 |
| 6.603 | 0.425 |
| 6.604 | 0.424 |
| 6.605 | 0.424 |
| 6.606 | 0.423 |
| 6.607 | 0.423 |
| 6.608 | 0.422 |
| 6.609 | 0.422 |
| 6.61 | 0.421 |
| 6.611 | 0.421 |
| 6.612 | 0.421 |
| 6.613 | 0.42 |
| 6.614 | 0.42 |
| 6.615 | 0.419 |
| 6.616 | 0.419 |
| 6.617 | 0.418 |
| 6.618 | 0.418 |
| 6.619 | 0.417 |
| 6.62 | 0.417 |
| 6.621 | 0.416 |
| 6.622 | 0.416 |
| 6.623 | 0.416 |
| 6.624 | 0.415 |
| 6.625 | 0.415 |
| 6.626 | 0.414 |
| 6.627 | 0.414 |
| 6.628 | 0.413 |
| 6.628999999999999 | 0.413 |
| 6.63 | 0.412 |
| 6.631 | 0.412 |
| 6.632 | 0.412 |
| 6.633 | 0.411 |
| 6.634 | 0.411 |
| 6.635 | 0.41 |
| 6.636 | 0.41 |
| 6.636999999999999 | 0.409 |
| 6.638 | 0.409 |
| 6.639 | 0.408 |
| 6.64 | 0.408 |
| 6.641 | 0.408 |
| 6.642 | 0.407 |
| 6.643 | 0.407 |
| 6.644 | 0.406 |
| 6.644999999999999 | 0.406 |
| 6.646 | 0.405 |
| 6.647 | 0.405 |
| 6.648 | 0.404 |
| 6.649 | 0.404 |
| 6.65 | 0.404 |
| 6.651 | 0.403 |
| 6.652 | 0.403 |
| 6.652999999999999 | 0.402 |
| 6.654 | 0.402 |
| 6.655 | 0.401 |
| 6.656 | 0.401 |
| 6.657 | 0.4 |
| 6.658 | 0.4 |
| 6.659 | 0.4 |
| 6.66 | 0.399 |
| 6.660999999999999 | 0.399 |
| 6.662 | 0.398 |
| 6.663 | 0.398 |
| 6.664 | 0.397 |
| 6.665 | 0.397 |
| 6.666 | 0.396 |
| 6.667 | 0.396 |
| 6.668 | 0.396 |
| 6.668999999999999 | 0.395 |
| 6.67 | 0.395 |
| 6.671 | 0.394 |
| 6.672 | 0.394 |
| 6.673 | 0.393 |
| 6.674 | 0.393 |
| 6.675 | 0.393 |
| 6.676 | 0.392 |
| 6.677 | 0.392 |
| 6.678 | 0.391 |
| 6.679 | 0.391 |
| 6.68 | 0.39 |
| 6.681 | 0.39 |
| 6.682 | 0.389 |
| 6.683 | 0.389 |
| 6.684 | 0.389 |
| 6.685 | 0.388 |
| 6.686 | 0.388 |
| 6.687 | 0.387 |
| 6.688 | 0.387 |
| 6.689 | 0.386 |
| 6.69 | 0.386 |
| 6.691 | 0.386 |
| 6.692 | 0.385 |
| 6.693 | 0.385 |
| 6.694 | 0.384 |
| 6.695 | 0.384 |
| 6.696 | 0.383 |
| 6.697 | 0.383 |
| 6.698 | 0.382 |
| 6.699 | 0.382 |
| 6.7 | 0.382 |
| 6.701 | 0.381 |
| 6.702 | 0.381 |
| 6.703 | 0.38 |
| 6.704 | 0.38 |
| 6.705 | 0.379 |
| 6.706 | 0.379 |
| 6.707 | 0.379 |
| 6.708 | 0.378 |
| 6.709 | 0.378 |
| 6.71 | 0.377 |
| 6.711 | 0.377 |
| 6.712 | 0.376 |
| 6.713 | 0.376 |
| 6.714 | 0.376 |
| 6.715 | 0.375 |
| 6.716 | 0.375 |
| 6.717 | 0.374 |
| 6.718 | 0.374 |
| 6.719 | 0.373 |
| 6.72 | 0.373 |
| 6.721 | 0.373 |
| 6.722 | 0.372 |
| 6.723 | 0.372 |
| 6.724 | 0.371 |
| 6.725 | 0.371 |
| 6.726 | 0.37 |
| 6.727 | 0.37 |
| 6.728 | 0.37 |
| 6.729 | 0.369 |
| 6.73 | 0.369 |
| 6.731 | 0.368 |
| 6.732 | 0.368 |
| 6.733 | 0.367 |
| 6.734 | 0.367 |
| 6.735 | 0.367 |
| 6.736 | 0.366 |
| 6.737 | 0.366 |
| 6.738 | 0.365 |
| 6.739 | 0.365 |
| 6.74 | 0.365 |
| 6.741 | 0.364 |
| 6.742 | 0.364 |
| 6.743 | 0.363 |
| 6.744 | 0.363 |
| 6.745 | 0.362 |
| 6.746 | 0.362 |
| 6.747 | 0.362 |
| 6.748 | 0.361 |
| 6.749 | 0.361 |
| 6.75 | 0.36 |
| 6.751 | 0.36 |
| 6.752 | 0.359 |
| 6.753 | 0.359 |
| 6.753999999999999 | 0.359 |
| 6.755 | 0.358 |
| 6.756 | 0.358 |
| 6.757 | 0.357 |
| 6.758 | 0.357 |
| 6.759 | 0.357 |
| 6.76 | 0.356 |
| 6.761 | 0.356 |
| 6.761999999999999 | 0.355 |
| 6.763 | 0.355 |
| 6.764 | 0.354 |
| 6.765 | 0.354 |
| 6.766 | 0.354 |
| 6.767 | 0.353 |
| 6.768 | 0.353 |
| 6.769 | 0.352 |
| 6.769999999999999 | 0.352 |
| 6.771 | 0.352 |
| 6.772 | 0.351 |
| 6.773 | 0.351 |
| 6.774 | 0.35 |
| 6.775 | 0.35 |
| 6.776 | 0.349 |
| 6.777 | 0.349 |
| 6.778 | 0.349 |
| 6.779 | 0.348 |
| 6.78 | 0.348 |
| 6.781 | 0.347 |
| 6.782 | 0.347 |
| 6.783 | 0.347 |
| 6.784 | 0.346 |
| 6.785 | 0.346 |
| 6.786 | 0.345 |
| 6.787 | 0.345 |
| 6.788 | 0.345 |
| 6.789 | 0.344 |
| 6.79 | 0.344 |
| 6.791 | 0.343 |
| 6.792 | 0.343 |
| 6.793 | 0.342 |
| 6.794 | 0.342 |
| 6.795 | 0.342 |
| 6.796 | 0.341 |
| 6.797 | 0.341 |
| 6.798 | 0.34 |
| 6.799 | 0.34 |
| 6.8 | 0.34 |
| 6.801 | 0.339 |
| 6.802 | 0.339 |
| 6.803 | 0.338 |
| 6.804 | 0.338 |
| 6.805 | 0.338 |
| 6.806 | 0.337 |
| 6.807 | 0.337 |
| 6.808 | 0.336 |
| 6.809 | 0.336 |
| 6.81 | 0.336 |
| 6.811 | 0.335 |
| 6.812 | 0.335 |
| 6.813 | 0.334 |
| 6.814 | 0.334 |
| 6.815 | 0.334 |
| 6.816 | 0.333 |
| 6.817 | 0.333 |
| 6.818 | 0.332 |
| 6.819 | 0.332 |
| 6.82 | 0.331 |
| 6.821 | 0.331 |
| 6.822 | 0.331 |
| 6.823 | 0.33 |
| 6.824 | 0.33 |
| 6.825 | 0.329 |
| 6.826 | 0.329 |
| 6.827 | 0.329 |
| 6.828 | 0.328 |
| 6.829 | 0.328 |
| 6.83 | 0.327 |
| 6.831 | 0.327 |
| 6.832 | 0.327 |
| 6.833 | 0.326 |
| 6.834 | 0.326 |
| 6.835 | 0.325 |
| 6.836 | 0.325 |
| 6.837 | 0.325 |
| 6.838 | 0.324 |
| 6.839 | 0.324 |
| 6.84 | 0.324 |
| 6.841 | 0.323 |
| 6.842 | 0.323 |
| 6.843 | 0.322 |
| 6.844 | 0.322 |
| 6.845 | 0.322 |
| 6.846 | 0.321 |
| 6.847 | 0.321 |
| 6.848 | 0.32 |
| 6.849 | 0.32 |
| 6.85 | 0.32 |
| 6.851 | 0.319 |
| 6.852 | 0.319 |
| 6.853 | 0.318 |
| 6.854 | 0.318 |
| 6.855 | 0.318 |
| 6.856 | 0.317 |
| 6.857 | 0.317 |
| 6.858 | 0.316 |
| 6.859 | 0.316 |
| 6.86 | 0.316 |
| 6.861 | 0.315 |
| 6.862 | 0.315 |
| 6.863 | 0.314 |
| 6.864 | 0.314 |
| 6.865 | 0.314 |
| 6.866 | 0.313 |
| 6.867 | 0.313 |
| 6.868 | 0.313 |
| 6.869 | 0.312 |
| 6.87 | 0.312 |
| 6.871 | 0.311 |
| 6.872 | 0.311 |
| 6.873 | 0.311 |
| 6.874 | 0.31 |
| 6.875 | 0.31 |
| 6.876 | 0.309 |
| 6.877 | 0.309 |
| 6.878 | 0.309 |
| 6.879 | 0.308 |
| 6.88 | 0.308 |
| 6.881 | 0.307 |
| 6.882 | 0.307 |
| 6.883 | 0.307 |
| 6.884 | 0.306 |
| 6.885 | 0.306 |
| 6.886 | 0.306 |
| 6.887 | 0.305 |
| 6.888 | 0.305 |
| 6.889 | 0.304 |
| 6.89 | 0.304 |
| 6.891 | 0.304 |
| 6.892 | 0.303 |
| 6.893 | 0.303 |
| 6.894 | 0.302 |
| 6.895 | 0.302 |
| 6.896 | 0.302 |
| 6.897 | 0.301 |
| 6.898 | 0.301 |
| 6.899 | 0.301 |
| 6.9 | 0.3 |
| 6.901 | 0.3 |
| 6.902 | 0.299 |
| 6.903 | 0.299 |
| 6.904 | 0.299 |
| 6.905 | 0.298 |
| 6.906 | 0.298 |
| 6.907 | 0.298 |
| 6.908 | 0.297 |
| 6.909 | 0.297 |
| 6.91 | 0.296 |
| 6.911 | 0.296 |
| 6.912 | 0.296 |
| 6.913 | 0.295 |
| 6.914 | 0.295 |
| 6.915 | 0.295 |
| 6.916 | 0.294 |
| 6.917 | 0.294 |
| 6.918 | 0.293 |
| 6.919 | 0.293 |
| 6.92 | 0.293 |
| 6.921 | 0.292 |
| 6.922 | 0.292 |
| 6.923 | 0.292 |
| 6.924 | 0.291 |
| 6.925 | 0.291 |
| 6.926 | 0.29 |
| 6.927 | 0.29 |
| 6.928 | 0.29 |
| 6.929 | 0.289 |
| 6.93 | 0.289 |
| 6.931 | 0.289 |
| 6.932 | 0.288 |
| 6.933 | 0.288 |
| 6.934 | 0.287 |
| 6.935 | 0.287 |
| 6.936 | 0.287 |
| 6.937 | 0.286 |
| 6.938 | 0.286 |
| 6.939 | 0.286 |
| 6.94 | 0.285 |
| 6.941 | 0.285 |
| 6.942 | 0.284 |
| 6.943 | 0.284 |
| 6.944 | 0.284 |
| 6.945 | 0.283 |
| 6.946 | 0.283 |
| 6.947 | 0.283 |
| 6.948 | 0.282 |
| 6.949 | 0.282 |
| 6.95 | 0.282 |
| 6.951 | 0.281 |
| 6.952 | 0.281 |
| 6.953 | 0.28 |
| 6.954 | 0.28 |
| 6.955 | 0.28 |
| 6.956 | 0.279 |
| 6.957 | 0.279 |
| 6.958 | 0.279 |
| 6.959 | 0.278 |
| 6.96 | 0.278 |
| 6.961 | 0.278 |
| 6.962 | 0.277 |
| 6.963 | 0.277 |
| 6.964 | 0.276 |
| 6.965 | 0.276 |
| 6.966 | 0.276 |
| 6.967 | 0.275 |
| 6.968 | 0.275 |
| 6.969 | 0.275 |
| 6.97 | 0.274 |
| 6.971 | 0.274 |
| 6.972 | 0.274 |
| 6.973 | 0.273 |
| 6.974 | 0.273 |
| 6.975 | 0.272 |
| 6.976 | 0.272 |
| 6.977 | 0.272 |
| 6.978 | 0.271 |
| 6.979 | 0.271 |
| 6.98 | 0.271 |
| 6.981 | 0.27 |
| 6.982 | 0.27 |
| 6.983 | 0.27 |
| 6.984 | 0.269 |
| 6.985 | 0.269 |
| 6.986 | 0.269 |
| 6.987 | 0.268 |
| 6.988 | 0.268 |
| 6.989 | 0.267 |
| 6.99 | 0.267 |
| 6.991 | 0.267 |
| 6.992 | 0.266 |
| 6.993 | 0.266 |
| 6.994 | 0.266 |
| 6.995 | 0.265 |
| 6.996 | 0.265 |
| 6.997 | 0.265 |
| 6.998 | 0.264 |
| 6.999 | 0.264 |
| 7.0 | 0.264 |
| 7.001 | 0.263 |
| 7.002 | 0.263 |
| 7.003 | 0.263 |
| 7.004 | 0.262 |
| 7.005 | 0.262 |
| 7.006 | 0.261 |
| 7.007 | 0.261 |
| 7.008 | 0.261 |
| 7.009 | 0.26 |
| 7.01 | 0.26 |
| 7.011 | 0.26 |
| 7.012 | 0.259 |
| 7.013 | 0.259 |
| 7.014 | 0.259 |
| 7.015 | 0.258 |
| 7.016 | 0.258 |
| 7.017 | 0.258 |
| 7.018 | 0.257 |
| 7.019 | 0.257 |
| 7.02 | 0.257 |
| 7.021 | 0.256 |
| 7.022 | 0.256 |
| 7.023 | 0.256 |
| 7.024 | 0.255 |
| 7.025 | 0.255 |
| 7.026 | 0.255 |
| 7.027 | 0.254 |
| 7.028 | 0.254 |
| 7.029 | 0.254 |
| 7.03 | 0.253 |
| 7.031 | 0.253 |
| 7.032 | 0.253 |
| 7.033 | 0.252 |
| 7.034 | 0.252 |
| 7.035 | 0.251 |
| 7.036 | 0.251 |
| 7.037 | 0.251 |
| 7.038 | 0.25 |
| 7.039 | 0.25 |
| 7.04 | 0.25 |
| 7.041 | 0.249 |
| 7.042 | 0.249 |
| 7.043 | 0.249 |
| 7.044 | 0.248 |
| 7.045 | 0.248 |
| 7.046 | 0.248 |
| 7.047 | 0.247 |
| 7.048 | 0.247 |
| 7.049 | 0.247 |
| 7.05 | 0.246 |
| 7.051 | 0.246 |
| 7.052 | 0.246 |
| 7.053 | 0.245 |
| 7.054 | 0.245 |
| 7.055 | 0.245 |
| 7.056 | 0.244 |
| 7.057 | 0.244 |
| 7.058 | 0.244 |
| 7.059 | 0.243 |
| 7.06 | 0.243 |
| 7.061 | 0.243 |
| 7.062 | 0.242 |
| 7.063 | 0.242 |
| 7.064 | 0.242 |
| 7.065 | 0.241 |
| 7.066 | 0.241 |
| 7.067 | 0.241 |
| 7.068 | 0.24 |
| 7.069 | 0.24 |
| 7.07 | 0.24 |
| 7.071 | 0.239 |
| 7.072 | 0.239 |
| 7.073 | 0.239 |
| 7.074 | 0.238 |
| 7.075 | 0.238 |
| 7.076 | 0.238 |
| 7.077 | 0.237 |
| 7.078 | 0.237 |
| 7.079 | 0.237 |
| 7.08 | 0.236 |
| 7.081 | 0.236 |
| 7.082 | 0.236 |
| 7.083 | 0.235 |
| 7.084 | 0.235 |
| 7.085 | 0.235 |
| 7.086 | 0.234 |
| 7.087 | 0.234 |
| 7.088 | 0.234 |
| 7.089 | 0.233 |
| 7.09 | 0.233 |
| 7.091 | 0.233 |
| 7.092 | 0.233 |
| 7.093 | 0.232 |
| 7.094 | 0.232 |
| 7.095 | 0.232 |
| 7.096 | 0.231 |
| 7.097 | 0.231 |
| 7.098 | 0.231 |
| 7.099 | 0.23 |
| 7.1 | 0.23 |
| 7.101 | 0.23 |
| 7.102 | 0.229 |
| 7.103 | 0.229 |
| 7.104 | 0.229 |
| 7.105 | 0.228 |
| 7.106 | 0.228 |
| 7.107 | 0.228 |
| 7.108 | 0.227 |
| 7.109 | 0.227 |
| 7.11 | 0.227 |
| 7.111 | 0.226 |
| 7.112 | 0.226 |
| 7.113 | 0.226 |
| 7.114 | 0.225 |
| 7.115 | 0.225 |
| 7.116 | 0.225 |
| 7.117 | 0.224 |
| 7.118 | 0.224 |
| 7.119 | 0.224 |
| 7.12 | 0.224 |
| 7.121 | 0.223 |
| 7.122 | 0.223 |
| 7.123 | 0.223 |
| 7.124 | 0.222 |
| 7.125 | 0.222 |
| 7.126 | 0.222 |
| 7.127 | 0.221 |
| 7.128 | 0.221 |
| 7.129 | 0.221 |
| 7.13 | 0.22 |
| 7.131 | 0.22 |
| 7.132 | 0.22 |
| 7.133 | 0.219 |
| 7.134 | 0.219 |
| 7.135 | 0.219 |
| 7.136 | 0.219 |
| 7.137 | 0.218 |
| 7.138 | 0.218 |
| 7.139 | 0.218 |
| 7.14 | 0.217 |
| 7.141 | 0.217 |
| 7.142 | 0.217 |
| 7.143 | 0.216 |
| 7.144 | 0.216 |
| 7.145 | 0.216 |
| 7.146 | 0.215 |
| 7.147 | 0.215 |
| 7.148 | 0.215 |
| 7.149 | 0.215 |
| 7.15 | 0.214 |
| 7.151 | 0.214 |
| 7.152 | 0.214 |
| 7.153 | 0.213 |
| 7.154 | 0.213 |
| 7.155 | 0.213 |
| 7.156 | 0.212 |
| 7.157 | 0.212 |
| 7.158 | 0.212 |
| 7.159 | 0.211 |
| 7.16 | 0.211 |
| 7.161 | 0.211 |
| 7.162 | 0.211 |
| 7.163 | 0.21 |
| 7.164 | 0.21 |
| 7.165 | 0.21 |
| 7.166 | 0.209 |
| 7.167 | 0.209 |
| 7.168 | 0.209 |
| 7.169 | 0.208 |
| 7.17 | 0.208 |
| 7.171 | 0.208 |
| 7.172 | 0.208 |
| 7.173 | 0.207 |
| 7.174 | 0.207 |
| 7.175 | 0.207 |
| 7.176 | 0.206 |
| 7.177 | 0.206 |
| 7.178 | 0.206 |
| 7.179 | 0.205 |
| 7.18 | 0.205 |
| 7.181 | 0.205 |
| 7.182 | 0.205 |
| 7.183 | 0.204 |
| 7.184 | 0.204 |
| 7.185 | 0.204 |
| 7.186 | 0.203 |
| 7.187 | 0.203 |
| 7.188 | 0.203 |
| 7.189 | 0.202 |
| 7.19 | 0.202 |
| 7.191 | 0.202 |
| 7.192 | 0.202 |
| 7.193 | 0.201 |
| 7.194 | 0.201 |
| 7.195 | 0.201 |
| 7.196 | 0.2 |
| 7.197 | 0.2 |
| 7.198 | 0.2 |
| 7.199 | 0.2 |
| 7.2 | 0.199 |
| 7.201 | 0.199 |
| 7.202 | 0.199 |
| 7.203 | 0.198 |
| 7.204 | 0.198 |
| 7.205 | 0.198 |
| 7.206 | 0.197 |
| 7.207 | 0.197 |
| 7.208 | 0.197 |
| 7.209 | 0.197 |
| 7.21 | 0.196 |
| 7.211 | 0.196 |
| 7.212 | 0.196 |
| 7.213 | 0.195 |
| 7.214 | 0.195 |
| 7.215 | 0.195 |
| 7.216 | 0.195 |
| 7.217 | 0.194 |
| 7.218 | 0.194 |
| 7.219 | 0.194 |
| 7.22 | 0.193 |
| 7.221 | 0.193 |
| 7.222 | 0.193 |
| 7.223 | 0.193 |
| 7.224 | 0.192 |
| 7.225 | 0.192 |
| 7.226 | 0.192 |
| 7.227 | 0.191 |
| 7.228 | 0.191 |
| 7.229 | 0.191 |
| 7.23 | 0.191 |
| 7.231 | 0.19 |
| 7.232 | 0.19 |
| 7.233 | 0.19 |
| 7.234 | 0.189 |
| 7.235 | 0.189 |
| 7.236 | 0.189 |
| 7.237 | 0.189 |
| 7.238 | 0.188 |
| 7.239 | 0.188 |
| 7.24 | 0.188 |
| 7.241 | 0.187 |
| 7.242 | 0.187 |
| 7.243 | 0.187 |
| 7.244 | 0.187 |
| 7.245 | 0.186 |
| 7.246 | 0.186 |
| 7.247 | 0.186 |
| 7.248 | 0.186 |
| 7.249 | 0.185 |
| 7.25 | 0.185 |
| 7.251 | 0.185 |
| 7.252 | 0.184 |
| 7.253 | 0.184 |
| 7.254 | 0.184 |
| 7.255 | 0.184 |
| 7.256 | 0.183 |
| 7.257 | 0.183 |
| 7.258 | 0.183 |
| 7.259 | 0.182 |
| 7.26 | 0.182 |
| 7.261 | 0.182 |
| 7.262 | 0.182 |
| 7.263 | 0.181 |
| 7.264 | 0.181 |
| 7.265 | 0.181 |
| 7.266 | 0.181 |
| 7.267 | 0.18 |
| 7.268 | 0.18 |
| 7.269 | 0.18 |
| 7.27 | 0.179 |
| 7.271 | 0.179 |
| 7.272 | 0.179 |
| 7.273 | 0.179 |
| 7.274 | 0.178 |
| 7.275 | 0.178 |
| 7.276 | 0.178 |
| 7.277 | 0.178 |
| 7.278 | 0.177 |
| 7.279 | 0.177 |
| 7.28 | 0.177 |
| 7.281 | 0.177 |
| 7.282 | 0.176 |
| 7.283 | 0.176 |
| 7.284 | 0.176 |
| 7.285 | 0.175 |
| 7.286 | 0.175 |
| 7.287 | 0.175 |
| 7.288 | 0.175 |
| 7.289 | 0.174 |
| 7.29 | 0.174 |
| 7.291 | 0.174 |
| 7.292 | 0.174 |
| 7.293 | 0.173 |
| 7.294 | 0.173 |
| 7.295 | 0.173 |
| 7.296 | 0.173 |
| 7.297 | 0.172 |
| 7.298 | 0.172 |
| 7.299 | 0.172 |
| 7.3 | 0.171 |
| 7.301 | 0.171 |
| 7.302 | 0.171 |
| 7.303 | 0.171 |
| 7.304 | 0.17 |
| 7.305 | 0.17 |
| 7.306 | 0.17 |
| 7.307 | 0.17 |
| 7.308 | 0.169 |
| 7.309 | 0.169 |
| 7.31 | 0.169 |
| 7.311 | 0.169 |
| 7.312 | 0.168 |
| 7.313 | 0.168 |
| 7.314 | 0.168 |
| 7.315 | 0.168 |
| 7.316 | 0.167 |
| 7.317 | 0.167 |
| 7.318 | 0.167 |
| 7.319 | 0.167 |
| 7.32 | 0.166 |
| 7.321 | 0.166 |
| 7.322 | 0.166 |
| 7.323 | 0.166 |
| 7.324 | 0.165 |
| 7.325 | 0.165 |
| 7.326 | 0.165 |
| 7.327 | 0.164 |
| 7.328 | 0.164 |
| 7.329 | 0.164 |
| 7.33 | 0.164 |
| 7.331 | 0.163 |
| 7.332 | 0.163 |
| 7.333 | 0.163 |
| 7.334 | 0.163 |
| 7.335 | 0.162 |
| 7.336 | 0.162 |
| 7.337 | 0.162 |
| 7.338 | 0.162 |
| 7.339 | 0.161 |
| 7.34 | 0.161 |
| 7.341 | 0.161 |
| 7.342 | 0.161 |
| 7.343 | 0.16 |
| 7.344 | 0.16 |
| 7.345 | 0.16 |
| 7.346 | 0.16 |
| 7.347 | 0.159 |
| 7.348 | 0.159 |
| 7.349 | 0.159 |
| 7.35 | 0.159 |
| 7.351 | 0.158 |
| 7.352 | 0.158 |
| 7.353 | 0.158 |
| 7.354 | 0.158 |
| 7.355 | 0.157 |
| 7.356 | 0.157 |
| 7.357 | 0.157 |
| 7.358 | 0.157 |
| 7.359 | 0.156 |
| 7.36 | 0.156 |
| 7.361 | 0.156 |
| 7.362 | 0.156 |
| 7.363 | 0.155 |
| 7.364 | 0.155 |
| 7.365 | 0.155 |
| 7.366 | 0.155 |
| 7.367 | 0.154 |
| 7.368 | 0.154 |
| 7.369 | 0.154 |
| 7.37 | 0.154 |
| 7.371 | 0.154 |
| 7.372 | 0.153 |
| 7.373 | 0.153 |
| 7.374 | 0.153 |
| 7.375 | 0.153 |
| 7.376 | 0.152 |
| 7.377 | 0.152 |
| 7.378 | 0.152 |
| 7.379 | 0.152 |
| 7.38 | 0.151 |
| 7.381 | 0.151 |
| 7.382 | 0.151 |
| 7.383 | 0.151 |
| 7.384 | 0.15 |
| 7.385 | 0.15 |
| 7.386 | 0.15 |
| 7.387 | 0.15 |
| 7.388 | 0.149 |
| 7.389 | 0.149 |
| 7.39 | 0.149 |
| 7.391 | 0.149 |
| 7.392 | 0.148 |
| 7.393 | 0.148 |
| 7.394 | 0.148 |
| 7.395 | 0.148 |
| 7.396 | 0.148 |
| 7.397 | 0.147 |
| 7.398 | 0.147 |
| 7.399 | 0.147 |
| 7.4 | 0.147 |
| 7.401 | 0.146 |
| 7.402 | 0.146 |
| 7.403 | 0.146 |
| 7.404 | 0.146 |
| 7.405 | 0.145 |
| 7.406 | 0.145 |
| 7.407 | 0.145 |
| 7.408 | 0.145 |
| 7.409 | 0.145 |
| 7.41 | 0.144 |
| 7.411 | 0.144 |
| 7.412 | 0.144 |
| 7.413 | 0.144 |
| 7.414 | 0.143 |
| 7.415 | 0.143 |
| 7.416 | 0.143 |
| 7.417 | 0.143 |
| 7.418 | 0.142 |
| 7.419 | 0.142 |
| 7.42 | 0.142 |
| 7.421 | 0.142 |
| 7.422 | 0.142 |
| 7.423 | 0.141 |
| 7.424 | 0.141 |
| 7.425 | 0.141 |
| 7.426 | 0.141 |
| 7.427 | 0.14 |
| 7.428 | 0.14 |
| 7.429 | 0.14 |
| 7.43 | 0.14 |
| 7.431 | 0.139 |
| 7.432 | 0.139 |
| 7.433 | 0.139 |
| 7.434 | 0.139 |
| 7.435 | 0.139 |
| 7.436 | 0.138 |
| 7.437 | 0.138 |
| 7.438 | 0.138 |
| 7.439 | 0.138 |
| 7.44 | 0.137 |
| 7.441 | 0.137 |
| 7.442 | 0.137 |
| 7.443 | 0.137 |
| 7.444 | 0.137 |
| 7.445 | 0.136 |
| 7.446 | 0.136 |
| 7.447 | 0.136 |
| 7.448 | 0.136 |
| 7.449 | 0.135 |
| 7.45 | 0.135 |
| 7.451 | 0.135 |
| 7.452 | 0.135 |
| 7.453 | 0.135 |
| 7.454 | 0.134 |
| 7.455 | 0.134 |
| 7.456 | 0.134 |
| 7.457 | 0.134 |
| 7.458 | 0.133 |
| 7.459 | 0.133 |
| 7.46 | 0.133 |
| 7.461 | 0.133 |
| 7.462 | 0.133 |
| 7.463 | 0.132 |
| 7.464 | 0.132 |
| 7.465 | 0.132 |
| 7.466 | 0.132 |
| 7.467 | 0.132 |
| 7.468 | 0.131 |
| 7.469 | 0.131 |
| 7.47 | 0.131 |
| 7.471 | 0.131 |
| 7.472 | 0.13 |
| 7.473 | 0.13 |
| 7.474 | 0.13 |
| 7.475 | 0.13 |
| 7.476 | 0.13 |
| 7.477 | 0.129 |
| 7.478 | 0.129 |
| 7.479 | 0.129 |
| 7.48 | 0.129 |
| 7.481 | 0.129 |
| 7.482 | 0.128 |
| 7.483 | 0.128 |
| 7.484 | 0.128 |
| 7.485 | 0.128 |
| 7.486 | 0.127 |
| 7.487 | 0.127 |
| 7.488 | 0.127 |
| 7.489 | 0.127 |
| 7.49 | 0.127 |
| 7.491 | 0.126 |
| 7.492 | 0.126 |
| 7.493 | 0.126 |
| 7.494 | 0.126 |
| 7.495 | 0.126 |
| 7.496 | 0.125 |
| 7.497 | 0.125 |
| 7.498 | 0.125 |
| 7.499 | 0.125 |
| 7.5 | 0.125 |
| 7.501 | 0.124 |
| 7.502 | 0.124 |
| 7.503 | 0.124 |
| 7.504 | 0.124 |
| 7.505 | 0.123 |
| 7.506 | 0.123 |
| 7.507 | 0.123 |
| 7.508 | 0.123 |
| 7.509 | 0.123 |
| 7.51 | 0.122 |
| 7.511 | 0.122 |
| 7.512 | 0.122 |
| 7.513 | 0.122 |
| 7.514 | 0.122 |
| 7.515 | 0.121 |
| 7.516 | 0.121 |
| 7.517 | 0.121 |
| 7.518 | 0.121 |
| 7.519 | 0.121 |
| 7.52 | 0.12 |
| 7.521 | 0.12 |
| 7.522 | 0.12 |
| 7.523 | 0.12 |
| 7.524 | 0.12 |
| 7.525 | 0.119 |
| 7.526 | 0.119 |
| 7.527 | 0.119 |
| 7.528 | 0.119 |
| 7.529 | 0.119 |
| 7.53 | 0.118 |
| 7.531 | 0.118 |
| 7.532 | 0.118 |
| 7.533 | 0.118 |
| 7.534 | 0.118 |
| 7.535 | 0.117 |
| 7.536 | 0.117 |
| 7.537 | 0.117 |
| 7.538 | 0.117 |
| 7.539 | 0.117 |
| 7.54 | 0.116 |
| 7.541 | 0.116 |
| 7.542 | 0.116 |
| 7.543 | 0.116 |
| 7.544 | 0.116 |
| 7.545 | 0.115 |
| 7.546 | 0.115 |
| 7.547 | 0.115 |
| 7.548 | 0.115 |
| 7.549 | 0.115 |
| 7.55 | 0.114 |
| 7.551 | 0.114 |
| 7.552 | 0.114 |
| 7.553 | 0.114 |
| 7.554 | 0.114 |
| 7.555 | 0.113 |
| 7.556 | 0.113 |
| 7.557 | 0.113 |
| 7.558 | 0.113 |
| 7.559 | 0.113 |
| 7.56 | 0.113 |
| 7.561 | 0.112 |
| 7.562 | 0.112 |
| 7.563 | 0.112 |
| 7.564 | 0.112 |
| 7.565 | 0.112 |
| 7.566 | 0.111 |
| 7.567 | 0.111 |
| 7.568 | 0.111 |
| 7.569 | 0.111 |
| 7.57 | 0.111 |
| 7.571 | 0.11 |
| 7.572 | 0.11 |
| 7.573 | 0.11 |
| 7.574 | 0.11 |
| 7.575 | 0.11 |
| 7.576 | 0.109 |
| 7.577 | 0.109 |
| 7.578 | 0.109 |
| 7.579 | 0.109 |
| 7.58 | 0.109 |
| 7.581 | 0.109 |
| 7.582 | 0.108 |
| 7.583 | 0.108 |
| 7.584 | 0.108 |
| 7.585 | 0.108 |
| 7.586 | 0.108 |
| 7.587 | 0.107 |
| 7.588 | 0.107 |
| 7.589 | 0.107 |
| 7.59 | 0.107 |
| 7.591 | 0.107 |
| 7.592 | 0.107 |
| 7.593 | 0.106 |
| 7.594 | 0.106 |
| 7.595 | 0.106 |
| 7.596 | 0.106 |
| 7.597 | 0.106 |
| 7.598 | 0.105 |
| 7.599 | 0.105 |
| 7.6 | 0.105 |
| 7.601 | 0.105 |
| 7.602 | 0.105 |
| 7.603 | 0.105 |
| 7.604 | 0.104 |
| 7.605 | 0.104 |
| 7.606 | 0.104 |
| 7.607 | 0.104 |
| 7.608 | 0.104 |
| 7.609 | 0.103 |
| 7.61 | 0.103 |
| 7.611 | 0.103 |
| 7.612 | 0.103 |
| 7.613 | 0.103 |
| 7.614 | 0.103 |
| 7.615 | 0.102 |
| 7.616 | 0.102 |
| 7.617 | 0.102 |
| 7.618 | 0.102 |
| 7.619 | 0.102 |
| 7.62 | 0.101 |
| 7.621 | 0.101 |
| 7.622 | 0.101 |
| 7.623 | 0.101 |
| 7.624 | 0.101 |
| 7.625 | 0.101 |
| 7.626 | 0.1 |
| 7.627 | 0.1 |
| 7.628 | 0.1 |
| 7.628999999999999 | 0.1 |
| 7.63 | 0.1 |
| 7.631 | 0.1 |
| 7.632 | 0.099 |
| 7.633 | 0.099 |
| 7.634 | 0.099 |
| 7.635 | 0.099 |
| 7.636 | 0.099 |
| 7.636999999999999 | 0.098 |
| 7.638 | 0.098 |
| 7.639 | 0.098 |
| 7.64 | 0.098 |
| 7.641 | 0.098 |
| 7.642 | 0.098 |
| 7.643 | 0.097 |
| 7.644 | 0.097 |
| 7.644999999999999 | 0.097 |
| 7.646 | 0.097 |
| 7.647 | 0.097 |
| 7.648 | 0.097 |
| 7.649 | 0.096 |
| 7.65 | 0.096 |
| 7.651 | 0.096 |
| 7.652 | 0.096 |
| 7.652999999999999 | 0.096 |
| 7.654 | 0.096 |
| 7.655 | 0.095 |
| 7.656 | 0.095 |
| 7.657 | 0.095 |
| 7.658 | 0.095 |
| 7.659 | 0.095 |
| 7.66 | 0.095 |
| 7.660999999999999 | 0.094 |
| 7.662 | 0.094 |
| 7.663 | 0.094 |
| 7.664 | 0.094 |
| 7.665 | 0.094 |
| 7.666 | 0.094 |
| 7.667 | 0.093 |
| 7.668 | 0.093 |
| 7.668999999999999 | 0.093 |
| 7.67 | 0.093 |
| 7.671 | 0.093 |
| 7.672 | 0.093 |
| 7.673 | 0.092 |
| 7.674 | 0.092 |
| 7.675 | 0.092 |
| 7.676 | 0.092 |
| 7.677 | 0.092 |
| 7.678 | 0.092 |
| 7.679 | 0.091 |
| 7.68 | 0.091 |
| 7.681 | 0.091 |
| 7.682 | 0.091 |
| 7.683 | 0.091 |
| 7.684 | 0.091 |
| 7.685 | 0.09 |
| 7.686 | 0.09 |
| 7.687 | 0.09 |
| 7.688 | 0.09 |
| 7.689 | 0.09 |
| 7.69 | 0.09 |
| 7.691 | 0.089 |
| 7.692 | 0.089 |
| 7.693 | 0.089 |
| 7.694 | 0.089 |
| 7.695 | 0.089 |
| 7.696 | 0.089 |
| 7.697 | 0.089 |
| 7.698 | 0.088 |
| 7.699 | 0.088 |
| 7.7 | 0.088 |
| 7.701 | 0.088 |
| 7.702 | 0.088 |
| 7.703 | 0.088 |
| 7.704 | 0.087 |
| 7.705 | 0.087 |
| 7.706 | 0.087 |
| 7.707 | 0.087 |
| 7.708 | 0.087 |
| 7.709 | 0.087 |
| 7.71 | 0.086 |
| 7.711 | 0.086 |
| 7.712 | 0.086 |
| 7.713 | 0.086 |
| 7.714 | 0.086 |
| 7.715 | 0.086 |
| 7.716 | 0.086 |
| 7.717 | 0.085 |
| 7.718 | 0.085 |
| 7.719 | 0.085 |
| 7.72 | 0.085 |
| 7.721 | 0.085 |
| 7.722 | 0.085 |
| 7.723 | 0.084 |
| 7.724 | 0.084 |
| 7.725 | 0.084 |
| 7.726 | 0.084 |
| 7.727 | 0.084 |
| 7.728 | 0.084 |
| 7.729 | 0.084 |
| 7.73 | 0.083 |
| 7.731 | 0.083 |
| 7.732 | 0.083 |
| 7.733 | 0.083 |
| 7.734 | 0.083 |
| 7.735 | 0.083 |
| 7.736 | 0.082 |
| 7.737 | 0.082 |
| 7.738 | 0.082 |
| 7.739 | 0.082 |
| 7.74 | 0.082 |
| 7.741 | 0.082 |
| 7.742 | 0.082 |
| 7.743 | 0.081 |
| 7.744 | 0.081 |
| 7.745 | 0.081 |
| 7.746 | 0.081 |
| 7.747 | 0.081 |
| 7.748 | 0.081 |
| 7.749 | 0.081 |
| 7.75 | 0.08 |
| 7.751 | 0.08 |
| 7.752 | 0.08 |
| 7.753 | 0.08 |
| 7.753999999999999 | 0.08 |
| 7.755 | 0.08 |
| 7.756 | 0.08 |
| 7.757 | 0.079 |
| 7.758 | 0.079 |
| 7.759 | 0.079 |
| 7.76 | 0.079 |
| 7.761 | 0.079 |
| 7.761999999999999 | 0.079 |
| 7.763 | 0.078 |
| 7.764 | 0.078 |
| 7.765 | 0.078 |
| 7.766 | 0.078 |
| 7.767 | 0.078 |
| 7.768 | 0.078 |
| 7.769 | 0.078 |
| 7.769999999999999 | 0.077 |
| 7.771 | 0.077 |
| 7.772 | 0.077 |
| 7.773 | 0.077 |
| 7.774 | 0.077 |
| 7.775 | 0.077 |
| 7.776 | 0.077 |
| 7.777 | 0.076 |
| 7.778 | 0.076 |
| 7.779 | 0.076 |
| 7.78 | 0.076 |
| 7.781 | 0.076 |
| 7.782 | 0.076 |
| 7.783 | 0.076 |
| 7.784 | 0.076 |
| 7.785 | 0.075 |
| 7.786 | 0.075 |
| 7.787 | 0.075 |
| 7.788 | 0.075 |
| 7.789 | 0.075 |
| 7.79 | 0.075 |
| 7.791 | 0.075 |
| 7.792 | 0.074 |
| 7.793 | 0.074 |
| 7.794 | 0.074 |
| 7.795 | 0.074 |
| 7.796 | 0.074 |
| 7.797 | 0.074 |
| 7.798 | 0.074 |
| 7.799 | 0.073 |
| 7.8 | 0.073 |
| 7.801 | 0.073 |
| 7.802 | 0.073 |
| 7.803 | 0.073 |
| 7.804 | 0.073 |
| 7.805 | 0.073 |
| 7.806 | 0.072 |
| 7.807 | 0.072 |
| 7.808 | 0.072 |
| 7.809 | 0.072 |
| 7.81 | 0.072 |
| 7.811 | 0.072 |
| 7.812 | 0.072 |
| 7.813 | 0.072 |
| 7.814 | 0.071 |
| 7.815 | 0.071 |
| 7.816 | 0.071 |
| 7.817 | 0.071 |
| 7.818 | 0.071 |
| 7.819 | 0.071 |
| 7.82 | 0.071 |
| 7.821 | 0.07 |
| 7.822 | 0.07 |
| 7.823 | 0.07 |
| 7.824 | 0.07 |
| 7.825 | 0.07 |
| 7.826 | 0.07 |
| 7.827 | 0.07 |
| 7.828 | 0.07 |
| 7.829 | 0.069 |
| 7.83 | 0.069 |
| 7.831 | 0.069 |
| 7.832 | 0.069 |
| 7.833 | 0.069 |
| 7.834 | 0.069 |
| 7.835 | 0.069 |
| 7.836 | 0.068 |
| 7.837 | 0.068 |
| 7.838 | 0.068 |
| 7.839 | 0.068 |
| 7.84 | 0.068 |
| 7.841 | 0.068 |
| 7.842 | 0.068 |
| 7.843 | 0.068 |
| 7.844 | 0.067 |
| 7.845 | 0.067 |
| 7.846 | 0.067 |
| 7.847 | 0.067 |
| 7.848 | 0.067 |
| 7.849 | 0.067 |
| 7.85 | 0.067 |
| 7.851 | 0.067 |
| 7.852 | 0.066 |
| 7.853 | 0.066 |
| 7.854 | 0.066 |
| 7.855 | 0.066 |
| 7.856 | 0.066 |
| 7.857 | 0.066 |
| 7.858 | 0.066 |
| 7.859 | 0.066 |
| 7.86 | 0.065 |
| 7.861 | 0.065 |
| 7.862 | 0.065 |
| 7.863 | 0.065 |
| 7.864 | 0.065 |
| 7.865 | 0.065 |
| 7.866 | 0.065 |
| 7.867 | 0.065 |
| 7.868 | 0.064 |
| 7.869 | 0.064 |
| 7.87 | 0.064 |
| 7.871 | 0.064 |
| 7.872 | 0.064 |
| 7.873 | 0.064 |
| 7.874 | 0.064 |
| 7.875 | 0.064 |
| 7.876 | 0.063 |
| 7.877 | 0.063 |
| 7.878 | 0.063 |
| 7.879 | 0.063 |
| 7.88 | 0.063 |
| 7.881 | 0.063 |
| 7.882 | 0.063 |
| 7.883 | 0.063 |
| 7.884 | 0.063 |
| 7.885 | 0.062 |
| 7.886 | 0.062 |
| 7.887 | 0.062 |
| 7.888 | 0.062 |
| 7.889 | 0.062 |
| 7.89 | 0.062 |
| 7.891 | 0.062 |
| 7.892 | 0.062 |
| 7.893 | 0.061 |
| 7.894 | 0.061 |
| 7.895 | 0.061 |
| 7.896 | 0.061 |
| 7.897 | 0.061 |
| 7.898 | 0.061 |
| 7.899 | 0.061 |
| 7.9 | 0.061 |
| 7.901 | 0.06 |
| 7.902 | 0.06 |
| 7.903 | 0.06 |
| 7.904 | 0.06 |
| 7.905 | 0.06 |
| 7.906 | 0.06 |
| 7.907 | 0.06 |
| 7.908 | 0.06 |
| 7.909 | 0.06 |
| 7.91 | 0.059 |
| 7.911 | 0.059 |
| 7.912 | 0.059 |
| 7.913 | 0.059 |
| 7.914 | 0.059 |
| 7.915 | 0.059 |
| 7.916 | 0.059 |
| 7.917 | 0.059 |
| 7.918 | 0.059 |
| 7.919 | 0.058 |
| 7.92 | 0.058 |
| 7.921 | 0.058 |
| 7.922 | 0.058 |
| 7.923 | 0.058 |
| 7.924 | 0.058 |
| 7.925 | 0.058 |
| 7.926 | 0.058 |
| 7.927 | 0.058 |
| 7.928 | 0.057 |
| 7.929 | 0.057 |
| 7.93 | 0.057 |
| 7.931 | 0.057 |
| 7.932 | 0.057 |
| 7.933 | 0.057 |
| 7.934 | 0.057 |
| 7.935 | 0.057 |
| 7.936 | 0.057 |
| 7.937 | 0.056 |
| 7.938 | 0.056 |
| 7.939 | 0.056 |
| 7.94 | 0.056 |
| 7.941 | 0.056 |
| 7.942 | 0.056 |
| 7.943 | 0.056 |
| 7.944 | 0.056 |
| 7.945 | 0.056 |
| 7.946 | 0.055 |
| 7.947 | 0.055 |
| 7.948 | 0.055 |
| 7.949 | 0.055 |
| 7.95 | 0.055 |
| 7.951 | 0.055 |
| 7.952 | 0.055 |
| 7.953 | 0.055 |
| 7.954 | 0.055 |
| 7.955 | 0.054 |
| 7.956 | 0.054 |
| 7.957 | 0.054 |
| 7.958 | 0.054 |
| 7.959 | 0.054 |
| 7.96 | 0.054 |
| 7.961 | 0.054 |
| 7.962 | 0.054 |
| 7.963 | 0.054 |
| 7.964 | 0.053 |
| 7.965 | 0.053 |
| 7.966 | 0.053 |
| 7.967 | 0.053 |
| 7.968 | 0.053 |
| 7.969 | 0.053 |
| 7.97 | 0.053 |
| 7.971 | 0.053 |
| 7.972 | 0.053 |
| 7.973 | 0.053 |
| 7.974 | 0.052 |
| 7.975 | 0.052 |
| 7.976 | 0.052 |
| 7.977 | 0.052 |
| 7.978 | 0.052 |
| 7.979 | 0.052 |
| 7.98 | 0.052 |
| 7.981 | 0.052 |
| 7.982 | 0.052 |
| 7.983 | 0.052 |
| 7.984 | 0.051 |
| 7.985 | 0.051 |
| 7.986 | 0.051 |
| 7.987 | 0.051 |
| 7.988 | 0.051 |
| 7.989 | 0.051 |
| 7.99 | 0.051 |
| 7.991 | 0.051 |
| 7.992 | 0.051 |
| 7.993 | 0.05 |
| 7.994 | 0.05 |
| 7.995 | 0.05 |
| 7.996 | 0.05 |
| 7.997 | 0.05 |
| 7.998 | 0.05 |
| 7.999 | 0.05 |
| 8.0 | 0.05 |
| 8.001 | 0.05 |
| 8.002 | 0.05 |
| 8.003 | 0.049 |
| 8.004 | 0.049 |
| 8.005 | 0.049 |
| 8.006 | 0.049 |
| 8.007 | 0.049 |
| 8.008 | 0.049 |
| 8.009 | 0.049 |
| 8.01 | 0.049 |
| 8.011 | 0.049 |
| 8.012 | 0.049 |
| 8.013 | 0.049 |
| 8.014 | 0.048 |
| 8.015 | 0.048 |
| 8.016 | 0.048 |
| 8.017 | 0.048 |
| 8.018 | 0.048 |
| 8.019 | 0.048 |
| 8.02 | 0.048 |
| 8.021 | 0.048 |
| 8.022 | 0.048 |
| 8.023 | 0.048 |
| 8.024 | 0.047 |
| 8.025 | 0.047 |
| 8.026 | 0.047 |
| 8.027 | 0.047 |
| 8.028 | 0.047 |
| 8.029 | 0.047 |
| 8.03 | 0.047 |
| 8.031 | 0.047 |
| 8.032 | 0.047 |
| 8.033 | 0.047 |
| 8.034 | 0.046 |
| 8.035 | 0.046 |
| 8.036 | 0.046 |
| 8.037 | 0.046 |
| 8.038 | 0.046 |
| 8.039 | 0.046 |
| 8.04 | 0.046 |
| 8.041 | 0.046 |
| 8.042 | 0.046 |
| 8.043 | 0.046 |
| 8.044 | 0.046 |
| 8.045 | 0.045 |
| 8.046 | 0.045 |
| 8.047 | 0.045 |
| 8.048 | 0.045 |
| 8.049 | 0.045 |
| 8.05 | 0.045 |
| 8.051 | 0.045 |
| 8.052 | 0.045 |
| 8.053 | 0.045 |
| 8.054 | 0.045 |
| 8.055 | 0.045 |
| 8.056 | 0.044 |
| 8.057 | 0.044 |
| 8.058 | 0.044 |
| 8.059 | 0.044 |
| 8.06 | 0.044 |
| 8.061 | 0.044 |
| 8.062 | 0.044 |
| 8.063 | 0.044 |
| 8.064 | 0.044 |
| 8.065 | 0.044 |
| 8.066 | 0.044 |
| 8.067 | 0.043 |
| 8.068 | 0.043 |
| 8.069 | 0.043 |
| 8.07 | 0.043 |
| 8.071 | 0.043 |
| 8.072 | 0.043 |
| 8.073 | 0.043 |
| 8.074 | 0.043 |
| 8.075 | 0.043 |
| 8.076 | 0.043 |
| 8.077 | 0.043 |
| 8.078 | 0.043 |
| 8.079 | 0.042 |
| 8.08 | 0.042 |
| 8.081 | 0.042 |
| 8.082 | 0.042 |
| 8.083 | 0.042 |
| 8.084 | 0.042 |
| 8.085 | 0.042 |
| 8.086 | 0.042 |
| 8.087 | 0.042 |
| 8.088 | 0.042 |
| 8.089 | 0.042 |
| 8.09 | 0.041 |
| 8.091 | 0.041 |
| 8.092 | 0.041 |
| 8.093 | 0.041 |
| 8.094 | 0.041 |
| 8.095 | 0.041 |
| 8.096 | 0.041 |
| 8.097 | 0.041 |
| 8.098 | 0.041 |
| 8.099 | 0.041 |
| 8.1 | 0.041 |
| 8.101 | 0.041 |
| 8.102 | 0.04 |
| 8.103 | 0.04 |
| 8.104 | 0.04 |
| 8.105 | 0.04 |
| 8.106 | 0.04 |
| 8.107 | 0.04 |
| 8.108 | 0.04 |
| 8.109 | 0.04 |
| 8.11 | 0.04 |
| 8.111 | 0.04 |
| 8.112 | 0.04 |
| 8.113 | 0.04 |
| 8.114 | 0.039 |
| 8.115 | 0.039 |
| 8.116 | 0.039 |
| 8.117 | 0.039 |
| 8.118 | 0.039 |
| 8.119 | 0.039 |
| 8.12 | 0.039 |
| 8.121 | 0.039 |
| 8.122 | 0.039 |
| 8.123 | 0.039 |
| 8.124 | 0.039 |
| 8.125 | 0.039 |
| 8.126 | 0.038 |
| 8.127 | 0.038 |
| 8.128 | 0.038 |
| 8.129 | 0.038 |
| 8.13 | 0.038 |
| 8.131 | 0.038 |
| 8.132 | 0.038 |
| 8.133 | 0.038 |
| 8.134 | 0.038 |
| 8.135 | 0.038 |
| 8.136 | 0.038 |
| 8.137 | 0.038 |
| 8.138 | 0.038 |
| 8.139 | 0.037 |
| 8.14 | 0.037 |
| 8.141 | 0.037 |
| 8.142 | 0.037 |
| 8.143 | 0.037 |
| 8.144 | 0.037 |
| 8.145 | 0.037 |
| 8.146 | 0.037 |
| 8.147 | 0.037 |
| 8.148 | 0.037 |
| 8.149 | 0.037 |
| 8.15 | 0.037 |
| 8.151 | 0.037 |
| 8.152 | 0.036 |
| 8.153 | 0.036 |
| 8.154 | 0.036 |
| 8.155 | 0.036 |
| 8.156 | 0.036 |
| 8.157 | 0.036 |
| 8.158 | 0.036 |
| 8.159 | 0.036 |
| 8.16 | 0.036 |
| 8.161 | 0.036 |
| 8.162 | 0.036 |
| 8.163 | 0.036 |
| 8.164 | 0.036 |
| 8.165 | 0.035 |
| 8.166 | 0.035 |
| 8.167 | 0.035 |
| 8.168 | 0.035 |
| 8.169 | 0.035 |
| 8.17 | 0.035 |
| 8.171 | 0.035 |
| 8.172 | 0.035 |
| 8.173 | 0.035 |
| 8.174 | 0.035 |
| 8.175 | 0.035 |
| 8.176 | 0.035 |
| 8.177 | 0.035 |
| 8.178 | 0.035 |
| 8.179 | 0.034 |
| 8.18 | 0.034 |
| 8.181 | 0.034 |
| 8.182 | 0.034 |
| 8.183 | 0.034 |
| 8.184 | 0.034 |
| 8.185 | 0.034 |
| 8.186 | 0.034 |
| 8.187 | 0.034 |
| 8.188 | 0.034 |
| 8.189 | 0.034 |
| 8.19 | 0.034 |
| 8.191 | 0.034 |
| 8.192 | 0.033 |
| 8.193 | 0.033 |
| 8.194 | 0.033 |
| 8.195 | 0.033 |
| 8.196 | 0.033 |
| 8.197 | 0.033 |
| 8.198 | 0.033 |
| 8.199 | 0.033 |
| 8.2 | 0.033 |
| 8.201 | 0.033 |
| 8.202 | 0.033 |
| 8.203 | 0.033 |
| 8.204 | 0.033 |
| 8.205 | 0.033 |
| 8.206 | 0.033 |
| 8.207 | 0.032 |
| 8.208 | 0.032 |
| 8.209 | 0.032 |
| 8.21 | 0.032 |
| 8.211 | 0.032 |
| 8.212 | 0.032 |
| 8.213 | 0.032 |
| 8.214 | 0.032 |
| 8.215 | 0.032 |
| 8.216 | 0.032 |
| 8.217 | 0.032 |
| 8.218 | 0.032 |
| 8.219 | 0.032 |
| 8.22 | 0.032 |
| 8.221 | 0.031 |
| 8.222 | 0.031 |
| 8.223 | 0.031 |
| 8.224 | 0.031 |
| 8.225 | 0.031 |
| 8.226 | 0.031 |
| 8.227 | 0.031 |
| 8.228 | 0.031 |
| 8.229 | 0.031 |
| 8.23 | 0.031 |
| 8.231 | 0.031 |
| 8.232 | 0.031 |
| 8.233 | 0.031 |
| 8.234 | 0.031 |
| 8.235 | 0.031 |
| 8.236 | 0.03 |
| 8.237 | 0.03 |
| 8.238 | 0.03 |
| 8.239 | 0.03 |
| 8.24 | 0.03 |
| 8.241 | 0.03 |
| 8.242 | 0.03 |
| 8.243 | 0.03 |
| 8.244 | 0.03 |
| 8.245 | 0.03 |
| 8.246 | 0.03 |
| 8.247 | 0.03 |
| 8.248 | 0.03 |
| 8.249 | 0.03 |
| 8.25 | 0.03 |
| 8.251 | 0.03 |
| 8.252 | 0.029 |
| 8.253 | 0.029 |
| 8.254 | 0.029 |
| 8.255 | 0.029 |
| 8.256 | 0.029 |
| 8.257 | 0.029 |
| 8.258 | 0.029 |
| 8.259 | 0.029 |
| 8.26 | 0.029 |
| 8.261 | 0.029 |
| 8.262 | 0.029 |
| 8.263 | 0.029 |
| 8.264 | 0.029 |
| 8.265 | 0.029 |
| 8.266 | 0.029 |
| 8.267 | 0.029 |
| 8.268 | 0.028 |
| 8.269 | 0.028 |
| 8.27 | 0.028 |
| 8.271 | 0.028 |
| 8.272 | 0.028 |
| 8.273 | 0.028 |
| 8.274 | 0.028 |
| 8.275 | 0.028 |
| 8.276 | 0.028 |
| 8.277 | 0.028 |
| 8.278 | 0.028 |
| 8.279 | 0.028 |
| 8.28 | 0.028 |
| 8.281 | 0.028 |
| 8.282 | 0.028 |
| 8.283 | 0.028 |
| 8.284 | 0.027 |
| 8.285 | 0.027 |
| 8.286 | 0.027 |
| 8.287 | 0.027 |
| 8.288 | 0.027 |
| 8.289 | 0.027 |
| 8.29 | 0.027 |
| 8.291 | 0.027 |
| 8.292 | 0.027 |
| 8.293 | 0.027 |
| 8.294 | 0.027 |
| 8.295 | 0.027 |
| 8.296 | 0.027 |
| 8.297 | 0.027 |
| 8.298 | 0.027 |
| 8.299 | 0.027 |
| 8.3 | 0.027 |
| 8.301 | 0.026 |
| 8.302 | 0.026 |
| 8.303 | 0.026 |
| 8.304 | 0.026 |
| 8.305 | 0.026 |
| 8.306 | 0.026 |
| 8.307 | 0.026 |
| 8.308 | 0.026 |
| 8.309 | 0.026 |
| 8.31 | 0.026 |
| 8.311 | 0.026 |
| 8.312 | 0.026 |
| 8.313 | 0.026 |
| 8.314 | 0.026 |
| 8.315 | 0.026 |
| 8.316 | 0.026 |
| 8.317 | 0.026 |
| 8.318 | 0.025 |
| 8.319 | 0.025 |
| 8.32 | 0.025 |
| 8.321 | 0.025 |
| 8.322 | 0.025 |
| 8.323 | 0.025 |
| 8.324 | 0.025 |
| 8.325 | 0.025 |
| 8.326 | 0.025 |
| 8.327 | 0.025 |
| 8.328 | 0.025 |
| 8.329 | 0.025 |
| 8.33 | 0.025 |
| 8.331 | 0.025 |
| 8.332 | 0.025 |
| 8.333 | 0.025 |
| 8.334 | 0.025 |
| 8.335 | 0.025 |
| 8.336 | 0.024 |
| 8.337 | 0.024 |
| 8.338 | 0.024 |
| 8.339 | 0.024 |
| 8.34 | 0.024 |
| 8.341 | 0.024 |
| 8.342 | 0.024 |
| 8.343 | 0.024 |
| 8.344 | 0.024 |
| 8.345 | 0.024 |
| 8.346 | 0.024 |
| 8.347 | 0.024 |
| 8.348 | 0.024 |
| 8.349 | 0.024 |
| 8.35 | 0.024 |
| 8.351 | 0.024 |
| 8.352 | 0.024 |
| 8.353 | 0.024 |
| 8.354 | 0.024 |
| 8.355 | 0.023 |
| 8.356 | 0.023 |
| 8.357 | 0.023 |
| 8.358 | 0.023 |
| 8.359 | 0.023 |
| 8.36 | 0.023 |
| 8.361 | 0.023 |
| 8.362 | 0.023 |
| 8.363 | 0.023 |
| 8.364 | 0.023 |
| 8.365 | 0.023 |
| 8.366 | 0.023 |
| 8.367 | 0.023 |
| 8.368 | 0.023 |
| 8.369 | 0.023 |
| 8.37 | 0.023 |
| 8.371 | 0.023 |
| 8.372 | 0.023 |
| 8.373 | 0.023 |
| 8.374 | 0.022 |
| 8.375 | 0.022 |
| 8.376 | 0.022 |
| 8.377 | 0.022 |
| 8.378 | 0.022 |
| 8.379 | 0.022 |
| 8.38 | 0.022 |
| 8.381 | 0.022 |
| 8.382 | 0.022 |
| 8.383 | 0.022 |
| 8.384 | 0.022 |
| 8.385 | 0.022 |
| 8.386 | 0.022 |
| 8.387 | 0.022 |
| 8.388 | 0.022 |
| 8.389 | 0.022 |
| 8.39 | 0.022 |
| 8.391 | 0.022 |
| 8.392 | 0.022 |
| 8.393 | 0.022 |
| 8.394 | 0.021 |
| 8.395 | 0.021 |
| 8.396 | 0.021 |
| 8.397 | 0.021 |
| 8.398 | 0.021 |
| 8.399 | 0.021 |
| 8.4 | 0.021 |
| 8.401 | 0.021 |
| 8.402 | 0.021 |
| 8.403 | 0.021 |
| 8.404 | 0.021 |
| 8.405 | 0.021 |
| 8.406 | 0.021 |
| 8.407 | 0.021 |
| 8.408 | 0.021 |
| 8.409 | 0.021 |
| 8.41 | 0.021 |
| 8.411 | 0.021 |
| 8.412 | 0.021 |
| 8.413 | 0.021 |
| 8.414 | 0.021 |
| 8.415 | 0.02 |
| 8.416 | 0.02 |
| 8.417 | 0.02 |
| 8.418 | 0.02 |
| 8.419 | 0.02 |
| 8.42 | 0.02 |
| 8.421 | 0.02 |
| 8.422 | 0.02 |
| 8.423 | 0.02 |
| 8.424 | 0.02 |
| 8.425 | 0.02 |
| 8.426 | 0.02 |
| 8.427 | 0.02 |
| 8.428 | 0.02 |
| 8.429 | 0.02 |
| 8.43 | 0.02 |
| 8.431 | 0.02 |
| 8.432 | 0.02 |
| 8.433 | 0.02 |
| 8.434 | 0.02 |
| 8.435 | 0.02 |
| 8.436 | 0.02 |
| 8.437 | 0.019 |
| 8.438 | 0.019 |
| 8.439 | 0.019 |
| 8.44 | 0.019 |
| 8.441 | 0.019 |
| 8.442 | 0.019 |
| 8.443 | 0.019 |
| 8.444 | 0.019 |
| 8.445 | 0.019 |
| 8.446 | 0.019 |
| 8.447 | 0.019 |
| 8.448 | 0.019 |
| 8.449 | 0.019 |
| 8.45 | 0.019 |
| 8.451 | 0.019 |
| 8.452 | 0.019 |
| 8.453 | 0.019 |
| 8.454 | 0.019 |
| 8.455 | 0.019 |
| 8.456 | 0.019 |
| 8.457 | 0.019 |
| 8.458 | 0.019 |
| 8.459 | 0.019 |
| 8.46 | 0.018 |
| 8.461 | 0.018 |
| 8.462 | 0.018 |
| 8.463 | 0.018 |
| 8.464 | 0.018 |
| 8.465 | 0.018 |
| 8.466 | 0.018 |
| 8.467 | 0.018 |
| 8.468 | 0.018 |
| 8.469 | 0.018 |
| 8.47 | 0.018 |
| 8.471 | 0.018 |
| 8.472 | 0.018 |
| 8.473 | 0.018 |
| 8.474 | 0.018 |
| 8.475 | 0.018 |
| 8.476 | 0.018 |
| 8.477 | 0.018 |
| 8.478 | 0.018 |
| 8.479 | 0.018 |
| 8.48 | 0.018 |
| 8.481 | 0.018 |
| 8.482 | 0.018 |
| 8.483 | 0.018 |
| 8.484 | 0.017 |
| 8.485 | 0.017 |
| 8.486 | 0.017 |
| 8.487 | 0.017 |
| 8.488 | 0.017 |
| 8.489 | 0.017 |
| 8.49 | 0.017 |
| 8.491 | 0.017 |
| 8.492 | 0.017 |
| 8.493 | 0.017 |
| 8.494 | 0.017 |
| 8.495 | 0.017 |
| 8.496 | 0.017 |
| 8.497 | 0.017 |
| 8.498 | 0.017 |
| 8.499 | 0.017 |
| 8.5 | 0.017 |
| 8.501 | 0.017 |
| 8.502 | 0.017 |
| 8.503 | 0.017 |
| 8.504 | 0.017 |
| 8.505 | 0.017 |
| 8.506 | 0.017 |
| 8.507 | 0.017 |
| 8.508 | 0.017 |
| 8.509 | 0.017 |
| 8.51 | 0.016 |
| 8.511 | 0.016 |
| 8.512 | 0.016 |
| 8.513 | 0.016 |
| 8.514 | 0.016 |
| 8.515 | 0.016 |
| 8.516 | 0.016 |
| 8.517 | 0.016 |
| 8.518 | 0.016 |
| 8.519 | 0.016 |
| 8.52 | 0.016 |
| 8.521 | 0.016 |
| 8.522 | 0.016 |
| 8.523 | 0.016 |
| 8.524 | 0.016 |
| 8.525 | 0.016 |
| 8.526 | 0.016 |
| 8.527 | 0.016 |
| 8.528 | 0.016 |
| 8.529 | 0.016 |
| 8.53 | 0.016 |
| 8.531 | 0.016 |
| 8.532 | 0.016 |
| 8.533 | 0.016 |
| 8.534 | 0.016 |
| 8.535 | 0.016 |
| 8.536 | 0.015 |
| 8.537 | 0.015 |
| 8.538 | 0.015 |
| 8.539 | 0.015 |
| 8.54 | 0.015 |
| 8.541 | 0.015 |
| 8.542 | 0.015 |
| 8.543 | 0.015 |
| 8.544 | 0.015 |
| 8.545 | 0.015 |
| 8.546 | 0.015 |
| 8.547 | 0.015 |
| 8.548 | 0.015 |
| 8.549 | 0.015 |
| 8.55 | 0.015 |
| 8.551 | 0.015 |
| 8.552 | 0.015 |
| 8.553 | 0.015 |
| 8.554 | 0.015 |
| 8.555 | 0.015 |
| 8.556 | 0.015 |
| 8.557 | 0.015 |
| 8.558 | 0.015 |
| 8.559 | 0.015 |
| 8.56 | 0.015 |
| 8.561 | 0.015 |
| 8.562 | 0.015 |
| 8.563 | 0.015 |
| 8.564 | 0.014 |
| 8.565 | 0.014 |
| 8.566 | 0.014 |
| 8.567 | 0.014 |
| 8.568 | 0.014 |
| 8.569 | 0.014 |
| 8.57 | 0.014 |
| 8.571 | 0.014 |
| 8.572 | 0.014 |
| 8.573 | 0.014 |
| 8.574 | 0.014 |
| 8.575 | 0.014 |
| 8.576 | 0.014 |
| 8.577 | 0.014 |
| 8.578 | 0.014 |
| 8.579 | 0.014 |
| 8.58 | 0.014 |
| 8.581 | 0.014 |
| 8.582 | 0.014 |
| 8.583 | 0.014 |
| 8.584 | 0.014 |
| 8.585 | 0.014 |
| 8.586 | 0.014 |
| 8.587 | 0.014 |
| 8.588 | 0.014 |
| 8.589 | 0.014 |
| 8.59 | 0.014 |
| 8.591 | 0.014 |
| 8.592 | 0.014 |
| 8.593 | 0.014 |
| 8.594 | 0.013 |
| 8.595 | 0.013 |
| 8.596 | 0.013 |
| 8.597 | 0.013 |
| 8.598 | 0.013 |
| 8.599 | 0.013 |
| 8.6 | 0.013 |
| 8.601 | 0.013 |
| 8.602 | 0.013 |
| 8.603 | 0.013 |
| 8.604 | 0.013 |
| 8.605 | 0.013 |
| 8.606 | 0.013 |
| 8.607 | 0.013 |
| 8.608 | 0.013 |
| 8.609 | 0.013 |
| 8.61 | 0.013 |
| 8.611 | 0.013 |
| 8.612 | 0.013 |
| 8.613 | 0.013 |
| 8.614 | 0.013 |
| 8.615 | 0.013 |
| 8.616 | 0.013 |
| 8.617 | 0.013 |
| 8.618 | 0.013 |
| 8.619 | 0.013 |
| 8.62 | 0.013 |
| 8.621 | 0.013 |
| 8.622 | 0.013 |
| 8.623 | 0.013 |
| 8.624 | 0.013 |
| 8.625 | 0.013 |
| 8.626 | 0.012 |
| 8.627 | 0.012 |
| 8.628 | 0.012 |
| 8.629 | 0.012 |
| 8.63 | 0.012 |
| 8.631 | 0.012 |
| 8.632 | 0.012 |
| 8.633 | 0.012 |
| 8.634 | 0.012 |
| 8.635 | 0.012 |
| 8.636 | 0.012 |
| 8.637 | 0.012 |
| 8.638 | 0.012 |
| 8.639 | 0.012 |
| 8.64 | 0.012 |
| 8.641 | 0.012 |
| 8.642 | 0.012 |
| 8.643 | 0.012 |
| 8.644 | 0.012 |
| 8.645 | 0.012 |
| 8.646 | 0.012 |
| 8.647 | 0.012 |
| 8.648 | 0.012 |
| 8.649 | 0.012 |
| 8.65 | 0.012 |
| 8.651 | 0.012 |
| 8.652 | 0.012 |
| 8.653 | 0.012 |
| 8.654 | 0.012 |
| 8.655 | 0.012 |
| 8.656 | 0.012 |
| 8.657 | 0.012 |
| 8.658 | 0.012 |
| 8.659 | 0.012 |
| 8.66 | 0.012 |
| 8.661 | 0.011 |
| 8.662 | 0.011 |
| 8.663 | 0.011 |
| 8.664 | 0.011 |
| 8.665 | 0.011 |
| 8.666 | 0.011 |
| 8.667 | 0.011 |
| 8.668 | 0.011 |
| 8.669 | 0.011 |
| 8.67 | 0.011 |
| 8.671 | 0.011 |
| 8.672 | 0.011 |
| 8.673 | 0.011 |
| 8.674 | 0.011 |
| 8.675 | 0.011 |
| 8.676 | 0.011 |
| 8.677 | 0.011 |
| 8.678 | 0.011 |
| 8.679 | 0.011 |
| 8.68 | 0.011 |
| 8.681 | 0.011 |
| 8.682 | 0.011 |
| 8.683 | 0.011 |
| 8.684 | 0.011 |
| 8.685 | 0.011 |
| 8.686 | 0.011 |
| 8.687 | 0.011 |
| 8.688 | 0.011 |
| 8.689 | 0.011 |
| 8.69 | 0.011 |
| 8.691 | 0.011 |
| 8.692 | 0.011 |
| 8.693 | 0.011 |
| 8.694 | 0.011 |
| 8.695 | 0.011 |
| 8.696 | 0.011 |
| 8.697 | 0.011 |
| 8.698 | 0.01 |
| 8.699 | 0.01 |
| 8.7 | 0.01 |
| 8.701 | 0.01 |
| 8.702 | 0.01 |
| 8.703 | 0.01 |
| 8.704 | 0.01 |
| 8.705 | 0.01 |
| 8.706 | 0.01 |
| 8.707 | 0.01 |
| 8.708 | 0.01 |
| 8.709 | 0.01 |
| 8.71 | 0.01 |
| 8.711 | 0.01 |
| 8.712 | 0.01 |
| 8.713 | 0.01 |
| 8.714 | 0.01 |
| 8.715 | 0.01 |
| 8.716 | 0.01 |
| 8.717 | 0.01 |
| 8.718 | 0.01 |
| 8.719 | 0.01 |
| 8.72 | 0.01 |
| 8.721 | 0.01 |
| 8.722 | 0.01 |
| 8.723 | 0.01 |
| 8.724 | 0.01 |
| 8.725 | 0.01 |
| 8.726 | 0.01 |
| 8.727 | 0.01 |
| 8.728 | 0.01 |
| 8.729 | 0.01 |
| 8.73 | 0.01 |
| 8.731 | 0.01 |
| 8.732 | 0.01 |
| 8.733 | 0.01 |
| 8.734 | 0.01 |
| 8.735 | 0.01 |
| 8.736 | 0.01 |
| 8.737 | 0.01 |
| 8.738 | 0.009 |
| 8.739 | 0.009 |
| 8.74 | 0.009 |
| 8.741 | 0.009 |
| 8.742 | 0.009 |
| 8.743 | 0.009 |
| 8.744 | 0.009 |
| 8.745 | 0.009 |
| 8.746 | 0.009 |
| 8.747 | 0.009 |
| 8.748 | 0.009 |
| 8.749 | 0.009 |
| 8.75 | 0.009 |
| 8.751 | 0.009 |
| 8.752 | 0.009 |
| 8.753 | 0.009 |
| 8.754 | 0.009 |
| 8.755 | 0.009 |
| 8.756 | 0.009 |
| 8.757 | 0.009 |
| 8.758 | 0.009 |
| 8.759 | 0.009 |
| 8.76 | 0.009 |
| 8.761 | 0.009 |
| 8.762 | 0.009 |
| 8.763 | 0.009 |
| 8.764 | 0.009 |
| 8.765 | 0.009 |
| 8.766 | 0.009 |
| 8.767 | 0.009 |
| 8.768 | 0.009 |
| 8.769 | 0.009 |
| 8.77 | 0.009 |
| 8.771 | 0.009 |
| 8.772 | 0.009 |
| 8.773 | 0.009 |
| 8.774 | 0.009 |
| 8.775 | 0.009 |
| 8.776 | 0.009 |
| 8.777 | 0.009 |
| 8.778 | 0.009 |
| 8.779 | 0.009 |
| 8.78 | 0.009 |
| 8.781 | 0.009 |
| 8.782 | 0.008 |
| 8.783 | 0.008 |
| 8.784 | 0.008 |
| 8.785 | 0.008 |
| 8.786 | 0.008 |
| 8.787 | 0.008 |
| 8.788 | 0.008 |
| 8.789 | 0.008 |
| 8.79 | 0.008 |
| 8.791 | 0.008 |
| 8.792 | 0.008 |
| 8.793 | 0.008 |
| 8.794 | 0.008 |
| 8.795 | 0.008 |
| 8.796 | 0.008 |
| 8.797 | 0.008 |
| 8.798 | 0.008 |
| 8.799 | 0.008 |
| 8.8 | 0.008 |
| 8.801 | 0.008 |
| 8.802 | 0.008 |
| 8.803 | 0.008 |
| 8.804 | 0.008 |
| 8.805 | 0.008 |
| 8.806 | 0.008 |
| 8.807 | 0.008 |
| 8.808 | 0.008 |
| 8.809 | 0.008 |
| 8.81 | 0.008 |
| 8.811 | 0.008 |
| 8.812 | 0.008 |
| 8.813 | 0.008 |
| 8.814 | 0.008 |
| 8.815 | 0.008 |
| 8.816 | 0.008 |
| 8.817 | 0.008 |
| 8.818 | 0.008 |
| 8.819 | 0.008 |
| 8.82 | 0.008 |
| 8.821 | 0.008 |
| 8.822 | 0.008 |
| 8.823 | 0.008 |
| 8.824 | 0.008 |
| 8.825 | 0.008 |
| 8.826 | 0.008 |
| 8.827 | 0.008 |
| 8.828 | 0.008 |
| 8.829 | 0.008 |
| 8.83 | 0.008 |
| 8.831 | 0.008 |
| 8.832 | 0.007 |
| 8.833 | 0.007 |
| 8.834 | 0.007 |
| 8.835 | 0.007 |
| 8.836 | 0.007 |
| 8.837 | 0.007 |
| 8.838 | 0.007 |
| 8.839 | 0.007 |
| 8.84 | 0.007 |
| 8.841 | 0.007 |
| 8.842 | 0.007 |
| 8.843 | 0.007 |
| 8.844 | 0.007 |
| 8.845 | 0.007 |
| 8.846 | 0.007 |
| 8.847 | 0.007 |
| 8.848 | 0.007 |
| 8.849 | 0.007 |
| 8.85 | 0.007 |
| 8.851 | 0.007 |
| 8.852 | 0.007 |
| 8.853 | 0.007 |
| 8.854 | 0.007 |
| 8.855 | 0.007 |
| 8.856 | 0.007 |
| 8.857 | 0.007 |
| 8.858 | 0.007 |
| 8.859 | 0.007 |
| 8.86 | 0.007 |
| 8.861 | 0.007 |
| 8.862 | 0.007 |
| 8.863 | 0.007 |
| 8.864 | 0.007 |
| 8.865 | 0.007 |
| 8.866 | 0.007 |
| 8.867 | 0.007 |
| 8.868 | 0.007 |
| 8.869 | 0.007 |
| 8.87 | 0.007 |
| 8.871 | 0.007 |
| 8.872 | 0.007 |
| 8.873 | 0.007 |
| 8.874 | 0.007 |
| 8.875 | 0.007 |
| 8.876 | 0.007 |
| 8.877 | 0.007 |
| 8.878 | 0.007 |
| 8.879 | 0.007 |
| 8.88 | 0.007 |
| 8.881 | 0.007 |
| 8.882 | 0.007 |
| 8.883 | 0.007 |
| 8.884 | 0.007 |
| 8.885 | 0.007 |
| 8.886 | 0.007 |
| 8.887 | 0.006 |
| 8.888 | 0.006 |
| 8.889 | 0.006 |
| 8.89 | 0.006 |
| 8.891 | 0.006 |
| 8.892 | 0.006 |
| 8.893 | 0.006 |
| 8.894 | 0.006 |
| 8.895 | 0.006 |
| 8.896 | 0.006 |
| 8.897 | 0.006 |
| 8.898 | 0.006 |
| 8.899 | 0.006 |
| 8.9 | 0.006 |
| 8.901 | 0.006 |
| 8.902 | 0.006 |
| 8.903 | 0.006 |
| 8.904 | 0.006 |
| 8.905 | 0.006 |
| 8.906 | 0.006 |
| 8.907 | 0.006 |
| 8.908 | 0.006 |
| 8.909 | 0.006 |
| 8.91 | 0.006 |
| 8.911 | 0.006 |
| 8.912 | 0.006 |
| 8.913 | 0.006 |
| 8.914 | 0.006 |
| 8.915 | 0.006 |
| 8.916 | 0.006 |
| 8.917 | 0.006 |
| 8.918 | 0.006 |
| 8.919 | 0.006 |
| 8.92 | 0.006 |
| 8.921 | 0.006 |
| 8.922 | 0.006 |
| 8.923 | 0.006 |
| 8.924 | 0.006 |
| 8.925 | 0.006 |
| 8.926 | 0.006 |
| 8.927 | 0.006 |
| 8.928 | 0.006 |
| 8.929 | 0.006 |
| 8.93 | 0.006 |
| 8.931 | 0.006 |
| 8.932 | 0.006 |
| 8.933 | 0.006 |
| 8.934 | 0.006 |
| 8.935 | 0.006 |
| 8.936 | 0.006 |
| 8.937 | 0.006 |
| 8.938 | 0.006 |
| 8.939 | 0.006 |
| 8.94 | 0.006 |
| 8.941 | 0.006 |
| 8.942 | 0.006 |
| 8.943 | 0.006 |
| 8.944 | 0.006 |
| 8.945 | 0.006 |
| 8.946 | 0.006 |
| 8.947 | 0.006 |
| 8.948 | 0.006 |
| 8.949 | 0.006 |
| 8.95 | 0.006 |
| 8.951 | 0.005 |
| 8.952 | 0.005 |
| 8.953 | 0.005 |
| 8.954 | 0.005 |
| 8.955 | 0.005 |
| 8.956 | 0.005 |
| 8.957 | 0.005 |
| 8.958 | 0.005 |
| 8.959 | 0.005 |
| 8.96 | 0.005 |
| 8.961 | 0.005 |
| 8.962 | 0.005 |
| 8.963 | 0.005 |
| 8.964 | 0.005 |
| 8.965 | 0.005 |
| 8.966 | 0.005 |
| 8.967 | 0.005 |
| 8.968 | 0.005 |
| 8.969 | 0.005 |
| 8.97 | 0.005 |
| 8.971 | 0.005 |
| 8.972 | 0.005 |
| 8.973 | 0.005 |
| 8.974 | 0.005 |
| 8.975 | 0.005 |
| 8.976 | 0.005 |
| 8.977 | 0.005 |
| 8.978 | 0.005 |
| 8.979 | 0.005 |
| 8.98 | 0.005 |
| 8.981 | 0.005 |
| 8.982 | 0.005 |
| 8.983 | 0.005 |
| 8.984 | 0.005 |
| 8.985 | 0.005 |
| 8.986 | 0.005 |
| 8.987 | 0.005 |
| 8.988 | 0.005 |
| 8.989 | 0.005 |
| 8.99 | 0.005 |
| 8.991 | 0.005 |
| 8.992 | 0.005 |
| 8.993 | 0.005 |
| 8.994 | 0.005 |
| 8.995 | 0.005 |
| 8.996 | 0.005 |
| 8.997 | 0.005 |
| 8.998 | 0.005 |
| 8.999 | 0.005 |
| 9.0 | 0.005 |
| 9.001 | 0.005 |
| 9.002 | 0.005 |
| 9.003 | 0.005 |
| 9.004 | 0.005 |
| 9.005 | 0.005 |
| 9.006 | 0.005 |
| 9.007 | 0.005 |
| 9.008 | 0.005 |
| 9.009 | 0.005 |
| 9.01 | 0.005 |
| 9.011 | 0.005 |
| 9.012 | 0.005 |
| 9.013 | 0.005 |
| 9.014 | 0.005 |
| 9.015 | 0.005 |
| 9.016 | 0.005 |
| 9.017 | 0.005 |
| 9.018 | 0.005 |
| 9.019 | 0.005 |
| 9.02 | 0.005 |
| 9.021 | 0.005 |
| 9.022 | 0.005 |
| 9.023 | 0.005 |
| 9.024 | 0.005 |
| 9.025 | 0.005 |
| 9.026 | 0.005 |
| 9.027 | 0.004 |
| 9.028 | 0.004 |
| 9.029 | 0.004 |
| 9.03 | 0.004 |
| 9.031 | 0.004 |
| 9.032 | 0.004 |
| 9.033 | 0.004 |
| 9.034 | 0.004 |
| 9.035 | 0.004 |
| 9.036 | 0.004 |
| 9.037 | 0.004 |
| 9.038 | 0.004 |
| 9.039 | 0.004 |
| 9.04 | 0.004 |
| 9.041 | 0.004 |
| 9.042 | 0.004 |
| 9.043 | 0.004 |
| 9.044 | 0.004 |
| 9.045 | 0.004 |
| 9.046 | 0.004 |
| 9.047 | 0.004 |
| 9.048 | 0.004 |
| 9.049 | 0.004 |
| 9.05 | 0.004 |
| 9.051 | 0.004 |
| 9.052 | 0.004 |
| 9.053 | 0.004 |
| 9.054 | 0.004 |
| 9.055 | 0.004 |
| 9.056 | 0.004 |
| 9.057 | 0.004 |
| 9.058 | 0.004 |
| 9.059 | 0.004 |
| 9.06 | 0.004 |
| 9.061 | 0.004 |
| 9.062 | 0.004 |
| 9.063 | 0.004 |
| 9.064 | 0.004 |
| 9.065 | 0.004 |
| 9.066 | 0.004 |
| 9.067 | 0.004 |
| 9.068 | 0.004 |
| 9.069 | 0.004 |
| 9.07 | 0.004 |
| 9.071 | 0.004 |
| 9.072 | 0.004 |
| 9.073 | 0.004 |
| 9.074 | 0.004 |
| 9.075 | 0.004 |
| 9.076 | 0.004 |
| 9.077 | 0.004 |
| 9.078 | 0.004 |
| 9.079 | 0.004 |
| 9.08 | 0.004 |
| 9.081 | 0.004 |
| 9.082 | 0.004 |
| 9.083 | 0.004 |
| 9.084 | 0.004 |
| 9.085 | 0.004 |
| 9.086 | 0.004 |
| 9.087 | 0.004 |
| 9.088 | 0.004 |
| 9.089 | 0.004 |
| 9.09 | 0.004 |
| 9.091 | 0.004 |
| 9.092 | 0.004 |
| 9.093 | 0.004 |
| 9.094 | 0.004 |
| 9.095 | 0.004 |
| 9.096 | 0.004 |
| 9.097 | 0.004 |
| 9.098 | 0.004 |
| 9.099 | 0.004 |
| 9.1 | 0.004 |
| 9.101 | 0.004 |
| 9.102 | 0.004 |
| 9.103 | 0.004 |
| 9.104 | 0.004 |
| 9.105 | 0.004 |
| 9.106 | 0.004 |
| 9.107 | 0.004 |
| 9.108 | 0.004 |
| 9.109 | 0.004 |
| 9.11 | 0.004 |
| 9.111 | 0.004 |
| 9.112 | 0.004 |
| 9.113 | 0.004 |
| 9.114 | 0.004 |
| 9.115 | 0.004 |
| 9.116 | 0.004 |
| 9.117 | 0.004 |
| 9.118 | 0.004 |
| 9.119 | 0.003 |
| 9.12 | 0.003 |
| 9.121 | 0.003 |
| 9.122 | 0.003 |
| 9.123 | 0.003 |
| 9.124 | 0.003 |
| 9.125 | 0.003 |
| 9.126 | 0.003 |
| 9.127 | 0.003 |
| 9.128 | 0.003 |
| 9.129 | 0.003 |
| 9.13 | 0.003 |
| 9.131 | 0.003 |
| 9.132 | 0.003 |
| 9.133 | 0.003 |
| 9.134 | 0.003 |
| 9.135 | 0.003 |
| 9.136 | 0.003 |
| 9.137 | 0.003 |
| 9.138 | 0.003 |
| 9.139 | 0.003 |
| 9.14 | 0.003 |
| 9.141 | 0.003 |
| 9.142 | 0.003 |
| 9.143 | 0.003 |
| 9.144 | 0.003 |
| 9.145 | 0.003 |
| 9.146 | 0.003 |
| 9.147 | 0.003 |
| 9.148 | 0.003 |
| 9.149 | 0.003 |
| 9.15 | 0.003 |
| 9.151 | 0.003 |
| 9.152 | 0.003 |
| 9.153 | 0.003 |
| 9.154 | 0.003 |
| 9.155 | 0.003 |
| 9.156 | 0.003 |
| 9.157 | 0.003 |
| 9.158 | 0.003 |
| 9.159 | 0.003 |
| 9.16 | 0.003 |
| 9.161 | 0.003 |
| 9.162 | 0.003 |
| 9.163 | 0.003 |
| 9.164 | 0.003 |
| 9.165 | 0.003 |
| 9.166 | 0.003 |
| 9.167 | 0.003 |
| 9.168 | 0.003 |
| 9.169 | 0.003 |
| 9.17 | 0.003 |
| 9.171 | 0.003 |
| 9.172 | 0.003 |
| 9.173 | 0.003 |
| 9.174 | 0.003 |
| 9.175 | 0.003 |
| 9.176 | 0.003 |
| 9.177 | 0.003 |
| 9.178 | 0.003 |
| 9.179 | 0.003 |
| 9.18 | 0.003 |
| 9.181 | 0.003 |
| 9.182 | 0.003 |
| 9.183 | 0.003 |
| 9.184 | 0.003 |
| 9.185 | 0.003 |
| 9.186 | 0.003 |
| 9.187 | 0.003 |
| 9.188 | 0.003 |
| 9.189 | 0.003 |
| 9.19 | 0.003 |
| 9.191 | 0.003 |
| 9.192 | 0.003 |
| 9.193 | 0.003 |
| 9.194 | 0.003 |
| 9.195 | 0.003 |
| 9.196 | 0.003 |
| 9.197 | 0.003 |
| 9.198 | 0.003 |
| 9.199 | 0.003 |
| 9.2 | 0.003 |
| 9.201 | 0.003 |
| 9.202 | 0.003 |
| 9.203 | 0.003 |
| 9.204 | 0.003 |
| 9.205 | 0.003 |
| 9.206 | 0.003 |
| 9.207 | 0.003 |
| 9.208 | 0.003 |
| 9.209 | 0.003 |
| 9.21 | 0.003 |
| 9.211 | 0.003 |
| 9.212 | 0.003 |
| 9.213 | 0.003 |
| 9.214 | 0.003 |
| 9.215 | 0.003 |
| 9.216 | 0.003 |
| 9.217 | 0.003 |
| 9.218 | 0.003 |
| 9.219 | 0.003 |
| 9.22 | 0.003 |
| 9.221 | 0.003 |
| 9.222 | 0.003 |
| 9.223 | 0.003 |
| 9.224 | 0.003 |
| 9.225 | 0.003 |
| 9.226 | 0.003 |
| 9.227 | 0.003 |
| 9.228 | 0.003 |
| 9.229 | 0.003 |
| 9.23 | 0.003 |
| 9.231 | 0.003 |
| 9.232 | 0.003 |
| 9.233 | 0.003 |
| 9.234 | 0.003 |
| 9.235 | 0.003 |
| 9.236 | 0.003 |
| 9.237 | 0.003 |
| 9.238 | 0.003 |
| 9.239 | 0.003 |
| 9.24 | 0.002 |
| 9.241 | 0.002 |
| 9.242 | 0.002 |
| 9.243 | 0.002 |
| 9.244 | 0.002 |
| 9.245 | 0.002 |
| 9.246 | 0.002 |
| 9.247 | 0.002 |
| 9.248 | 0.002 |
| 9.249 | 0.002 |
| 9.25 | 0.002 |
| 9.251 | 0.002 |
| 9.252 | 0.002 |
| 9.253 | 0.002 |
| 9.254 | 0.002 |
| 9.255 | 0.002 |
| 9.256 | 0.002 |
| 9.257 | 0.002 |
| 9.258 | 0.002 |
| 9.259 | 0.002 |
| 9.26 | 0.002 |
| 9.261 | 0.002 |
| 9.262 | 0.002 |
| 9.263 | 0.002 |
| 9.264 | 0.002 |
| 9.265 | 0.002 |
| 9.266 | 0.002 |
| 9.267 | 0.002 |
| 9.268 | 0.002 |
| 9.269 | 0.002 |
| 9.27 | 0.002 |
| 9.271 | 0.002 |
| 9.272 | 0.002 |
| 9.273 | 0.002 |
| 9.274 | 0.002 |
| 9.275 | 0.002 |
| 9.276 | 0.002 |
| 9.277 | 0.002 |
| 9.278 | 0.002 |
| 9.279 | 0.002 |
| 9.28 | 0.002 |
| 9.281 | 0.002 |
| 9.282 | 0.002 |
| 9.283 | 0.002 |
| 9.284 | 0.002 |
| 9.285 | 0.002 |
| 9.286 | 0.002 |
| 9.287 | 0.002 |
| 9.288 | 0.002 |
| 9.289 | 0.002 |
| 9.29 | 0.002 |
| 9.291 | 0.002 |
| 9.292 | 0.002 |
| 9.293 | 0.002 |
| 9.294 | 0.002 |
| 9.295 | 0.002 |
| 9.296 | 0.002 |
| 9.297 | 0.002 |
| 9.298 | 0.002 |
| 9.299 | 0.002 |
| 9.3 | 0.002 |
| 9.301 | 0.002 |
| 9.302 | 0.002 |
| 9.303 | 0.002 |
| 9.304 | 0.002 |
| 9.305 | 0.002 |
| 9.306 | 0.002 |
| 9.307 | 0.002 |
| 9.308 | 0.002 |
| 9.309 | 0.002 |
| 9.31 | 0.002 |
| 9.311 | 0.002 |
| 9.312 | 0.002 |
| 9.313 | 0.002 |
| 9.314 | 0.002 |
| 9.315 | 0.002 |
| 9.316 | 0.002 |
| 9.317 | 0.002 |
| 9.318 | 0.002 |
| 9.319 | 0.002 |
| 9.32 | 0.002 |
| 9.321 | 0.002 |
| 9.322 | 0.002 |
| 9.323 | 0.002 |
| 9.324 | 0.002 |
| 9.325 | 0.002 |
| 9.326 | 0.002 |
| 9.327 | 0.002 |
| 9.328 | 0.002 |
| 9.329 | 0.002 |
| 9.33 | 0.002 |
| 9.331 | 0.002 |
| 9.332 | 0.002 |
| 9.333 | 0.002 |
| 9.334 | 0.002 |
| 9.335 | 0.002 |
| 9.336 | 0.002 |
| 9.337 | 0.002 |
| 9.338 | 0.002 |
| 9.339 | 0.002 |
| 9.34 | 0.002 |
| 9.341 | 0.002 |
| 9.342 | 0.002 |
| 9.343 | 0.002 |
| 9.344 | 0.002 |
| 9.345 | 0.002 |
| 9.346 | 0.002 |
| 9.347 | 0.002 |
| 9.348 | 0.002 |
| 9.349 | 0.002 |
| 9.35 | 0.002 |
| 9.351 | 0.002 |
| 9.352 | 0.002 |
| 9.353 | 0.002 |
| 9.354 | 0.002 |
| 9.355 | 0.002 |
| 9.356 | 0.002 |
| 9.357 | 0.002 |
| 9.358 | 0.002 |
| 9.359 | 0.002 |
| 9.36 | 0.002 |
| 9.361 | 0.002 |
| 9.362 | 0.002 |
| 9.363 | 0.002 |
| 9.364 | 0.002 |
| 9.365 | 0.002 |
| 9.366 | 0.002 |
| 9.367 | 0.002 |
| 9.368 | 0.002 |
| 9.369 | 0.002 |
| 9.37 | 0.002 |
| 9.371 | 0.002 |
| 9.372 | 0.002 |
| 9.373 | 0.002 |
| 9.374 | 0.002 |
| 9.375 | 0.002 |
| 9.376 | 0.002 |
| 9.377 | 0.002 |
| 9.378 | 0.002 |
| 9.379 | 0.002 |
| 9.38 | 0.002 |
| 9.381 | 0.002 |
| 9.382 | 0.002 |
| 9.383 | 0.002 |
| 9.384 | 0.002 |
| 9.385 | 0.002 |
| 9.386 | 0.002 |
| 9.387 | 0.002 |
| 9.388 | 0.002 |
| 9.389 | 0.002 |
| 9.39 | 0.002 |
| 9.391 | 0.002 |
| 9.392 | 0.002 |
| 9.393 | 0.002 |
| 9.394 | 0.002 |
| 9.395 | 0.002 |
| 9.396 | 0.002 |
| 9.397 | 0.002 |
| 9.398 | 0.002 |
| 9.399 | 0.002 |
| 9.4 | 0.002 |
| 9.401 | 0.002 |
| 9.402 | 0.002 |
| 9.403 | 0.002 |
| 9.404 | 0.002 |
| 9.405 | 0.002 |
| 9.406 | 0.002 |
| 9.407 | 0.002 |
| 9.408 | 0.002 |
| 9.409 | 0.002 |
| 9.41 | 0.002 |
| 9.411 | 0.002 |
| 9.412 | 0.002 |
| 9.413 | 0.002 |
| 9.414 | 0.002 |
| 9.415 | 0.002 |
| 9.416 | 0.002 |
| 9.417 | 0.001 |
| 9.418 | 0.001 |
| 9.419 | 0.001 |
| 9.42 | 0.001 |
| 9.421 | 0.001 |
| 9.422 | 0.001 |
| 9.423 | 0.001 |
| 9.424 | 0.001 |
| 9.425 | 0.001 |
| 9.426 | 0.001 |
| 9.427 | 0.001 |
| 9.428 | 0.001 |
| 9.429 | 0.001 |
| 9.43 | 0.001 |
| 9.431 | 0.001 |
| 9.432 | 0.001 |
| 9.433 | 0.001 |
| 9.434 | 0.001 |
| 9.435 | 0.001 |
| 9.436 | 0.001 |
| 9.437 | 0.001 |
| 9.438 | 0.001 |
| 9.439 | 0.001 |
| 9.44 | 0.001 |
| 9.441 | 0.001 |
| 9.442 | 0.001 |
| 9.443 | 0.001 |
| 9.444 | 0.001 |
| 9.445 | 0.001 |
| 9.446 | 0.001 |
| 9.447 | 0.001 |
| 9.448 | 0.001 |
| 9.449 | 0.001 |
| 9.45 | 0.001 |
| 9.451 | 0.001 |
| 9.452 | 0.001 |
| 9.453 | 0.001 |
| 9.454 | 0.001 |
| 9.455 | 0.001 |
| 9.456 | 0.001 |
| 9.457 | 0.001 |
| 9.458 | 0.001 |
| 9.459 | 0.001 |
| 9.46 | 0.001 |
| 9.461 | 0.001 |
| 9.462 | 0.001 |
| 9.463 | 0.001 |
| 9.464 | 0.001 |
| 9.465 | 0.001 |
| 9.466 | 0.001 |
| 9.467 | 0.001 |
| 9.468 | 0.001 |
| 9.469 | 0.001 |
| 9.47 | 0.001 |
| 9.471 | 0.001 |
| 9.472 | 0.001 |
| 9.473 | 0.001 |
| 9.474 | 0.001 |
| 9.475 | 0.001 |
| 9.476 | 0.001 |
| 9.477 | 0.001 |
| 9.478 | 0.001 |
| 9.479 | 0.001 |
| 9.48 | 0.001 |
| 9.481 | 0.001 |
| 9.482 | 0.001 |
| 9.483 | 0.001 |
| 9.484 | 0.001 |
| 9.485 | 0.001 |
| 9.486 | 0.001 |
| 9.487 | 0.001 |
| 9.488 | 0.001 |
| 9.489 | 0.001 |
| 9.49 | 0.001 |
| 9.491 | 0.001 |
| 9.492 | 0.001 |
| 9.493 | 0.001 |
| 9.494 | 0.001 |
| 9.495 | 0.001 |
| 9.496 | 0.001 |
| 9.497 | 0.001 |
| 9.498 | 0.001 |
| 9.499 | 0.001 |
| 9.5 | 0.001 |
| 9.501 | 0.001 |
| 9.502 | 0.001 |
| 9.503 | 0.001 |
| 9.504 | 0.001 |
| 9.505 | 0.001 |
| 9.506 | 0.001 |
| 9.507 | 0.001 |
| 9.508 | 0.001 |
| 9.509 | 0.001 |
| 9.51 | 0.001 |
| 9.511 | 0.001 |
| 9.512 | 0.001 |
| 9.513 | 0.001 |
| 9.514 | 0.001 |
| 9.515 | 0.001 |
| 9.516 | 0.001 |
| 9.517 | 0.001 |
| 9.518 | 0.001 |
| 9.519 | 0.001 |
| 9.52 | 0.001 |
| 9.521 | 0.001 |
| 9.522 | 0.001 |
| 9.523 | 0.001 |
| 9.524 | 0.001 |
| 9.525 | 0.001 |
| 9.526 | 0.001 |
| 9.527 | 0.001 |
| 9.528 | 0.001 |
| 9.529 | 0.001 |
| 9.53 | 0.001 |
| 9.531 | 0.001 |
| 9.532 | 0.001 |
| 9.533 | 0.001 |
| 9.534 | 0.001 |
| 9.535 | 0.001 |
| 9.536 | 0.001 |
| 9.537 | 0.001 |
| 9.538 | 0.001 |
| 9.539 | 0.001 |
| 9.54 | 0.001 |
| 9.541 | 0.001 |
| 9.542 | 0.001 |
| 9.543 | 0.001 |
| 9.544 | 0.001 |
| 9.545 | 0.001 |
| 9.546 | 0.001 |
| 9.547 | 0.001 |
| 9.548 | 0.001 |
| 9.549 | 0.001 |
| 9.55 | 0.001 |
| 9.551 | 0.001 |
| 9.552 | 0.001 |
| 9.553 | 0.001 |
| 9.554 | 0.001 |
| 9.555 | 0.001 |
| 9.556 | 0.001 |
| 9.557 | 0.001 |
| 9.558 | 0.001 |
| 9.559 | 0.001 |
| 9.56 | 0.001 |
| 9.561 | 0.001 |
| 9.562 | 0.001 |
| 9.563 | 0.001 |
| 9.564 | 0.001 |
| 9.565 | 0.001 |
| 9.566 | 0.001 |
| 9.567 | 0.001 |
| 9.568 | 0.001 |
| 9.569 | 0.001 |
| 9.57 | 0.001 |
| 9.571 | 0.001 |
| 9.572 | 0.001 |
| 9.573 | 0.001 |
| 9.574 | 0.001 |
| 9.575 | 0.001 |
| 9.576 | 0.001 |
| 9.577 | 0.001 |
| 9.578 | 0.001 |
| 9.579 | 0.001 |
| 9.58 | 0.001 |
| 9.581 | 0.001 |
| 9.582 | 0.001 |
| 9.583 | 0.001 |
| 9.584 | 0.001 |
| 9.585 | 0.001 |
| 9.586 | 0.001 |
| 9.587 | 0.001 |
| 9.588 | 0.001 |
| 9.589 | 0.001 |
| 9.59 | 0.001 |
| 9.591 | 0.001 |
| 9.592 | 0.001 |
| 9.593 | 0.001 |
| 9.594 | 0.001 |
| 9.595 | 0.001 |
| 9.596 | 0.001 |
| 9.597 | 0.001 |
| 9.598 | 0.001 |
| 9.599 | 0.001 |
| 9.6 | 0.001 |
| 9.601 | 0.001 |
| 9.602 | 0.001 |
| 9.603 | 0.001 |
| 9.604 | 0.001 |
| 9.605 | 0.001 |
| 9.606 | 0.001 |
| 9.607 | 0.001 |
| 9.608 | 0.001 |
| 9.609 | 0.001 |
| 9.61 | 0.001 |
| 9.611 | 0.001 |
| 9.612 | 0.001 |
| 9.613 | 0.001 |
| 9.614 | 0.001 |
| 9.615 | 0.001 |
| 9.616 | 0.001 |
| 9.617 | 0.001 |
| 9.618 | 0.001 |
| 9.619 | 0.001 |
| 9.62 | 0.001 |
| 9.621 | 0.001 |
| 9.622 | 0.001 |
| 9.623 | 0.001 |
| 9.624 | 0.001 |
| 9.625 | 0.001 |
| 9.626 | 0.001 |
| 9.627 | 0.001 |
| 9.628 | 0.001 |
| 9.629 | 0.001 |
| 9.63 | 0.001 |
| 9.631 | 0.001 |
| 9.632 | 0.001 |
| 9.633 | 0.001 |
| 9.634 | 0.001 |
| 9.635 | 0.001 |
| 9.636 | 0.001 |
| 9.637 | 0.001 |
| 9.638 | 0.001 |
| 9.639 | 0.001 |
| 9.64 | 0.001 |
| 9.641 | 0.001 |
| 9.642 | 0.001 |
| 9.643 | 0.001 |
| 9.644 | 0.001 |
| 9.645 | 0.001 |
| 9.646 | 0.001 |
| 9.647 | 0.001 |
| 9.648 | 0.001 |
| 9.649 | 0.001 |
| 9.65 | 0.001 |
| 9.651 | 0.001 |
| 9.652 | 0.001 |
| 9.653 | 0.001 |
| 9.654 | 0.001 |
| 9.655 | 0.001 |
| 9.656 | 0.001 |
| 9.657 | 0.001 |
| 9.658 | 0.001 |
| 9.659 | 0.001 |
| 9.66 | 0.001 |
| 9.661 | 0.001 |
| 9.662 | 0.001 |
| 9.663 | 0.001 |
| 9.664 | 0.001 |
| 9.665 | 0.001 |
| 9.666 | 0.001 |
| 9.667 | 0.001 |
| 9.668 | 0.001 |
| 9.669 | 0.001 |
| 9.67 | 0.001 |
| 9.671 | 0.001 |
| 9.672 | 0.001 |
| 9.673 | 0.001 |
| 9.674 | 0.001 |
| 9.675 | 0.001 |
| 9.676 | 0.001 |
| 9.677 | 0.001 |
| 9.678 | 0.001 |
| 9.679 | 0.001 |
| 9.68 | 0.001 |
| 9.681 | 0.001 |
| 9.682 | 0.001 |
| 9.683 | 0.001 |
| 9.684 | 0.001 |
| 9.685 | 0.001 |
| 9.686 | 0.001 |
| 9.687 | 0.001 |
| 9.688 | 0.001 |
| 9.689 | 0.001 |
| 9.69 | 0.001 |
| 9.691 | 0.001 |
| 9.692 | 0.001 |
| 9.693 | 0.001 |
| 9.694 | 0.001 |
| 9.695 | 0.001 |
| 9.696 | 0.001 |
| 9.697 | 0.001 |
| 9.698 | 0.001 |
| 9.699 | 0.001 |
| 9.7 | 0.001 |
| 9.701 | 0.001 |
| 9.702 | 0.001 |
| 9.703 | 0.001 |
| 9.704 | 0.001 |
| 9.705 | 0.001 |
| 9.706 | 0.001 |
| 9.707 | 0.001 |
| 9.708 | 0.001 |
| 9.709 | 0.001 |
| 9.71 | 0.001 |
| 9.711 | 0.001 |
| 9.712 | 0.001 |
| 9.713 | 0.001 |
| 9.714 | 0.001 |
| 9.715 | 0.001 |
| 9.716 | 0.001 |
| 9.717 | 0.001 |
| 9.718 | 0.001 |
| 9.719 | 0.001 |
| 9.72 | 0.001 |
| 9.721 | 0.001 |
| 9.722 | 0.001 |
| 9.723 | 0.001 |
| 9.724 | 0.001 |
| 9.725 | 0.001 |
| 9.726 | 0.001 |
| 9.727 | 0.001 |
| 9.728 | 0.001 |
| 9.729 | 0.001 |
| 9.73 | 0.001 |
| 9.731 | 0.001 |
| 9.732 | 0.001 |
| 9.733 | 0.001 |
| 9.734 | 0.001 |
| 9.735 | 0.001 |
| 9.736 | 0.001 |
| 9.737 | 0.001 |
| 9.738 | 0.001 |
| 9.739 | 0.001 |
| 9.74 | 0.001 |
| 9.741 | 0.001 |
| 9.742 | 0.001 |
| 9.743 | 0.001 |
| 9.744 | 0.001 |
| 9.745 | 0.001 |
| 9.746 | 0.001 |
| 9.747 | 0.001 |
| 9.748 | 0.001 |
| 9.749 | 0.001 |
| 9.75 | 0.001 |
| 9.751 | 0.001 |
| 9.752 | 0.001 |
| 9.753 | 0.001 |
| 9.754 | 0.001 |
| 9.755 | 0.001 |
| 9.756 | 0.001 |
| 9.757 | 0.001 |
| 9.758 | 0.001 |
| 9.759 | 0.001 |
| 9.76 | 0.001 |
| 9.761 | 0.001 |
| 9.762 | 0.001 |
| 9.763 | 0.001 |
| 9.764 | 0.001 |
| 9.765 | 0.001 |
| 9.766 | 0.001 |
| 9.767 | 0.001 |
| 9.768 | 0.001 |
| 9.769 | 0.001 |
| 9.77 | 0.001 |
| 9.771 | 0.001 |
| 9.772 | 0.001 |
| 9.773 | 0.001 |
| 9.774 | 0.001 |
| 9.775 | 0.001 |
| 9.776 | 0 |
| 9.777 | 0 |
| 9.778 | 0 |
| 9.779 | 0 |
| 9.78 | 0 |
| 9.781 | 0 |
| 9.782 | 0 |
| 9.783 | 0 |
| 9.784 | 0 |
| 9.785 | 0 |
| 9.786 | 0 |
| 9.787 | 0 |
| 9.788 | 0 |
| 9.789 | 0 |
| 9.79 | 0 |
| 9.791 | 0 |
| 9.792 | 0 |
| 9.793 | 0 |
| 9.794 | 0 |
| 9.795 | 0 |
| 9.796 | 0 |
| 9.797 | 0 |
| 9.798 | 0 |
| 9.799 | 0 |
| 9.8 | 0 |
| 9.801 | 0 |
| 9.802 | 0 |
| 9.803 | 0 |
| 9.804 | 0 |
| 9.805 | 0 |
| 9.806 | 0 |
| 9.807 | 0 |
| 9.808 | 0 |
| 9.809 | 0 |
| 9.81 | 0 |
| 9.811 | 0 |
| 9.812 | 0 |
| 9.813 | 0 |
| 9.814 | 0 |
| 9.815 | 0 |
| 9.816 | 0 |
| 9.817 | 0 |
| 9.818 | 0 |
| 9.819 | 0 |
| 9.82 | 0 |
| 9.821 | 0 |
| 9.822 | 0 |
| 9.823 | 0 |
| 9.824 | 0 |
| 9.825 | 0 |
| 9.826 | 0 |
| 9.827 | 0 |
| 9.828 | 0 |
| 9.829 | 0 |
| 9.83 | 0 |
| 9.831 | 0 |
| 9.832 | 0 |
| 9.833 | 0 |
| 9.834 | 0 |
| 9.835 | 0 |
| 9.836 | 0 |
| 9.837 | 0 |
| 9.838 | 0 |
| 9.839 | 0 |
| 9.84 | 0 |
| 9.841 | 0 |
| 9.842 | 0 |
| 9.843 | 0 |
| 9.844 | 0 |
| 9.845 | 0 |
| 9.846 | 0 |
| 9.847 | 0 |
| 9.848 | 0 |
| 9.849 | 0 |
| 9.85 | 0 |
| 9.851 | 0 |
| 9.852 | 0 |
| 9.853 | 0 |
| 9.854 | 0 |
| 9.855 | 0 |
| 9.856 | 0 |
| 9.857 | 0 |
| 9.858 | 0 |
| 9.859 | 0 |
| 9.86 | 0 |
| 9.861 | 0 |
| 9.862 | 0 |
| 9.863 | 0 |
| 9.864 | 0 |
| 9.865 | 0 |
| 9.866 | 0 |
| 9.867 | 0 |
| 9.868 | 0 |
| 9.869 | 0 |
| 9.87 | 0 |
| 9.871 | 0 |
| 9.872 | 0 |
| 9.873 | 0 |
| 9.874 | 0 |
| 9.875 | 0 |
| 9.876 | 0 |
| 9.877 | 0 |
| 9.878 | 0 |
| 9.879 | 0 |
| 9.88 | 0 |
| 9.881 | 0 |
| 9.882 | 0 |
| 9.883 | 0 |
| 9.884 | 0 |
| 9.885 | 0 |
| 9.886 | 0 |
| 9.887 | 0 |
| 9.888 | 0 |
| 9.889 | 0 |
| 9.89 | 0 |
| 9.891 | 0 |
| 9.892 | 0 |
| 9.893 | 0 |
| 9.894 | 0 |
| 9.895 | 0 |
| 9.896 | 0 |
| 9.897 | 0 |
| 9.898 | 0 |
| 9.899 | 0 |
| 9.9 | 0 |
| 9.901 | 0 |
| 9.902 | 0 |
| 9.903 | 0 |
| 9.904 | 0 |
| 9.905 | 0 |
| 9.906 | 0 |
| 9.907 | 0 |
| 9.908 | 0 |
| 9.909 | 0 |
| 9.91 | 0 |
| 9.911 | 0 |
| 9.912 | 0 |
| 9.913 | 0 |
| 9.914 | 0 |
| 9.915 | 0 |
| 9.916 | 0 |
| 9.917 | 0 |
| 9.918 | 0 |
| 9.919 | 0 |
| 9.92 | 0 |
| 9.921 | 0 |
| 9.922 | 0 |
| 9.923 | 0 |
| 9.924 | 0 |
| 9.925 | 0 |
| 9.926 | 0 |
| 9.927 | 0 |
| 9.928 | 0 |
| 9.929 | 0 |
| 9.93 | 0 |
| 9.931 | 0 |
| 9.932 | 0 |
| 9.933 | 0 |
| 9.934 | 0 |
| 9.935 | 0 |
| 9.936 | 0 |
| 9.937 | 0 |
| 9.938 | 0 |
| 9.939 | 0 |
| 9.94 | 0 |
| 9.941 | 0 |
| 9.942 | 0 |
| 9.943 | 0 |
| 9.944 | 0 |
| 9.945 | 0 |
| 9.946 | 0 |
| 9.947 | 0 |
| 9.948 | 0 |
| 9.949 | 0 |
| 9.95 | 0 |
| 9.951 | 0 |
| 9.952 | 0 |
| 9.953 | 0 |
| 9.954 | 0 |
| 9.955 | 0 |
| 9.956 | 0 |
| 9.957 | 0 |
| 9.958 | 0 |
| 9.959 | 0 |
| 9.96 | 0 |
| 9.961 | 0 |
| 9.962 | 0 |
| 9.963 | 0 |
| 9.964 | 0 |
| 9.965 | 0 |
| 9.966 | 0 |
| 9.967 | 0 |
| 9.968 | 0 |
| 9.969 | 0 |
| 9.97 | 0 |
| 9.971 | 0 |
| 9.972 | 0 |
| 9.973 | 0 |
| 9.974 | 0 |
| 9.975 | 0 |
| 9.976 | 0 |
| 9.977 | 0 |
| 9.978 | 0 |
| 9.979 | 0 |
| 9.98 | 0 |
| 9.981 | 0 |
| 9.982 | 0 |
| 9.983 | 0 |
| 9.984 | 0 |
| 9.985 | 0 |
| 9.986 | 0 |
| 9.987 | 0 |
| 9.988 | 0 |
| 9.989 | 0 |
| 9.99 | 0 |
| 9.991 | 0 |
| 9.992 | 0 |
| 9.993 | 0 |
| 9.994 | 0 |
| 9.995 | 0 |
| 9.996 | 0 |
| 9.997 | 0 |
| 9.998 | 0 |
| 9.999 | 0 |
| 10.0 | 0 |